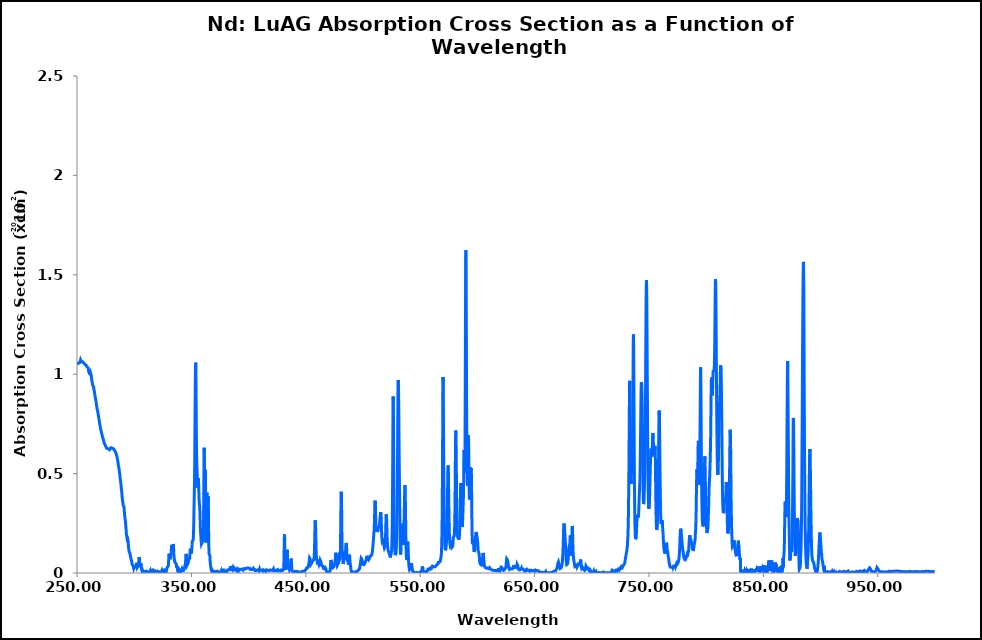
| Category | 295 K |
|---|---|
| 250.0 | 1.049 |
| 250.1 | 1.049 |
| 250.2 | 1.048 |
| 250.3 | 1.047 |
| 250.4 | 1.048 |
| 250.5 | 1.05 |
| 250.6 | 1.052 |
| 250.7 | 1.054 |
| 250.8 | 1.056 |
| 250.9 | 1.056 |
| 251.0 | 1.056 |
| 251.1 | 1.053 |
| 251.2 | 1.053 |
| 251.3 | 1.052 |
| 251.4 | 1.055 |
| 251.5 | 1.055 |
| 251.6 | 1.055 |
| 251.7 | 1.056 |
| 251.8 | 1.056 |
| 251.9 | 1.057 |
| 252.0 | 1.056 |
| 252.1 | 1.056 |
| 252.2 | 1.056 |
| 252.3 | 1.057 |
| 252.4 | 1.057 |
| 252.5 | 1.058 |
| 252.6 | 1.059 |
| 252.7 | 1.062 |
| 252.8 | 1.065 |
| 252.9 | 1.067 |
| 253.0 | 1.069 |
| 253.1 | 1.071 |
| 253.2 | 1.073 |
| 253.3 | 1.071 |
| 253.4 | 1.068 |
| 253.5 | 1.065 |
| 253.6 | 1.064 |
| 253.7 | 1.063 |
| 253.8 | 1.063 |
| 253.9 | 1.062 |
| 254.0 | 1.063 |
| 254.1 | 1.064 |
| 254.2 | 1.066 |
| 254.3 | 1.066 |
| 254.4 | 1.064 |
| 254.5 | 1.066 |
| 254.6 | 1.065 |
| 254.7 | 1.064 |
| 254.8 | 1.061 |
| 254.9 | 1.062 |
| 255.0 | 1.061 |
| 255.1 | 1.061 |
| 255.2 | 1.06 |
| 255.3 | 1.061 |
| 255.4 | 1.06 |
| 255.5 | 1.06 |
| 255.6 | 1.06 |
| 255.7 | 1.059 |
| 255.8 | 1.059 |
| 255.9 | 1.058 |
| 256.0 | 1.058 |
| 256.1 | 1.055 |
| 256.2 | 1.054 |
| 256.3 | 1.053 |
| 256.4 | 1.054 |
| 256.5 | 1.054 |
| 256.6 | 1.055 |
| 256.7 | 1.054 |
| 256.8 | 1.051 |
| 256.9 | 1.049 |
| 257.0 | 1.05 |
| 257.1 | 1.051 |
| 257.2 | 1.05 |
| 257.3 | 1.049 |
| 257.4 | 1.047 |
| 257.5 | 1.047 |
| 257.6 | 1.047 |
| 257.7 | 1.047 |
| 257.8 | 1.046 |
| 257.9 | 1.044 |
| 258.0 | 1.043 |
| 258.1 | 1.042 |
| 258.2 | 1.042 |
| 258.3 | 1.042 |
| 258.4 | 1.042 |
| 258.5 | 1.039 |
| 258.6 | 1.039 |
| 258.7 | 1.04 |
| 258.8 | 1.04 |
| 258.9 | 1.038 |
| 259.0 | 1.037 |
| 259.1 | 1.036 |
| 259.2 | 1.035 |
| 259.3 | 1.034 |
| 259.4 | 1.034 |
| 259.5 | 1.033 |
| 259.6 | 1.032 |
| 259.7 | 1.03 |
| 259.8 | 1.03 |
| 259.9 | 1.029 |
| 260.0 | 1.024 |
| 260.1 | 1.016 |
| 260.2 | 1.011 |
| 260.3 | 1.011 |
| 260.4 | 1.012 |
| 260.5 | 1.01 |
| 260.6 | 1.008 |
| 260.7 | 1.006 |
| 260.8 | 1.004 |
| 260.9 | 1.004 |
| 261.0 | 1.002 |
| 261.1 | 1 |
| 261.2 | 1 |
| 261.3 | 1.002 |
| 261.4 | 1.003 |
| 261.5 | 1 |
| 261.6 | 0.999 |
| 261.7 | 1.001 |
| 261.8 | 1.004 |
| 261.9 | 1.005 |
| 262.0 | 1.006 |
| 262.1 | 1.004 |
| 262.2 | 1.002 |
| 262.3 | 0.997 |
| 262.4 | 0.993 |
| 262.5 | 0.99 |
| 262.6 | 0.987 |
| 262.7 | 0.981 |
| 262.8 | 0.974 |
| 262.9 | 0.969 |
| 263.0 | 0.966 |
| 263.1 | 0.965 |
| 263.2 | 0.963 |
| 263.3 | 0.96 |
| 263.4 | 0.956 |
| 263.5 | 0.953 |
| 263.6 | 0.95 |
| 263.7 | 0.946 |
| 263.8 | 0.944 |
| 263.9 | 0.942 |
| 264.0 | 0.942 |
| 264.1 | 0.944 |
| 264.2 | 0.946 |
| 264.3 | 0.947 |
| 264.4 | 0.943 |
| 264.5 | 0.936 |
| 264.6 | 0.929 |
| 264.7 | 0.924 |
| 264.8 | 0.922 |
| 264.9 | 0.92 |
| 265.0 | 0.919 |
| 265.1 | 0.916 |
| 265.2 | 0.914 |
| 265.3 | 0.909 |
| 265.4 | 0.904 |
| 265.5 | 0.9 |
| 265.6 | 0.898 |
| 265.7 | 0.893 |
| 265.8 | 0.887 |
| 265.9 | 0.885 |
| 266.0 | 0.885 |
| 266.1 | 0.882 |
| 266.2 | 0.878 |
| 266.3 | 0.871 |
| 266.4 | 0.871 |
| 266.5 | 0.868 |
| 266.6 | 0.865 |
| 266.7 | 0.86 |
| 266.8 | 0.855 |
| 266.9 | 0.852 |
| 267.0 | 0.847 |
| 267.1 | 0.845 |
| 267.2 | 0.84 |
| 267.3 | 0.839 |
| 267.4 | 0.834 |
| 267.5 | 0.83 |
| 267.6 | 0.825 |
| 267.7 | 0.822 |
| 267.8 | 0.82 |
| 267.9 | 0.816 |
| 268.0 | 0.816 |
| 268.1 | 0.814 |
| 268.2 | 0.809 |
| 268.3 | 0.806 |
| 268.4 | 0.803 |
| 268.5 | 0.802 |
| 268.6 | 0.797 |
| 268.7 | 0.792 |
| 268.8 | 0.788 |
| 268.9 | 0.785 |
| 269.0 | 0.779 |
| 269.1 | 0.777 |
| 269.2 | 0.775 |
| 269.3 | 0.774 |
| 269.4 | 0.768 |
| 269.5 | 0.763 |
| 269.6 | 0.76 |
| 269.7 | 0.756 |
| 269.8 | 0.755 |
| 269.9 | 0.749 |
| 270.0 | 0.748 |
| 270.1 | 0.744 |
| 270.2 | 0.742 |
| 270.3 | 0.738 |
| 270.4 | 0.733 |
| 270.5 | 0.728 |
| 270.6 | 0.725 |
| 270.7 | 0.723 |
| 270.8 | 0.721 |
| 270.9 | 0.718 |
| 271.0 | 0.717 |
| 271.1 | 0.717 |
| 271.2 | 0.713 |
| 271.3 | 0.71 |
| 271.4 | 0.705 |
| 271.5 | 0.703 |
| 271.6 | 0.7 |
| 271.7 | 0.699 |
| 271.8 | 0.697 |
| 271.9 | 0.694 |
| 272.0 | 0.695 |
| 272.1 | 0.69 |
| 272.2 | 0.688 |
| 272.3 | 0.684 |
| 272.4 | 0.685 |
| 272.5 | 0.683 |
| 272.6 | 0.68 |
| 272.7 | 0.677 |
| 272.8 | 0.675 |
| 272.9 | 0.673 |
| 273.0 | 0.673 |
| 273.1 | 0.669 |
| 273.2 | 0.668 |
| 273.3 | 0.665 |
| 273.4 | 0.664 |
| 273.5 | 0.66 |
| 273.6 | 0.656 |
| 273.7 | 0.656 |
| 273.8 | 0.656 |
| 273.9 | 0.656 |
| 274.0 | 0.654 |
| 274.1 | 0.651 |
| 274.2 | 0.65 |
| 274.3 | 0.647 |
| 274.4 | 0.647 |
| 274.5 | 0.645 |
| 274.6 | 0.645 |
| 274.7 | 0.642 |
| 274.8 | 0.641 |
| 274.9 | 0.64 |
| 275.0 | 0.64 |
| 275.1 | 0.638 |
| 275.2 | 0.638 |
| 275.3 | 0.636 |
| 275.4 | 0.635 |
| 275.5 | 0.631 |
| 275.6 | 0.631 |
| 275.7 | 0.629 |
| 275.8 | 0.629 |
| 275.9 | 0.628 |
| 276.0 | 0.628 |
| 276.1 | 0.626 |
| 276.2 | 0.625 |
| 276.3 | 0.624 |
| 276.4 | 0.625 |
| 276.5 | 0.626 |
| 276.6 | 0.626 |
| 276.7 | 0.624 |
| 276.8 | 0.625 |
| 276.9 | 0.627 |
| 277.0 | 0.63 |
| 277.1 | 0.629 |
| 277.2 | 0.63 |
| 277.3 | 0.629 |
| 277.4 | 0.629 |
| 277.5 | 0.624 |
| 277.6 | 0.622 |
| 277.7 | 0.621 |
| 277.8 | 0.622 |
| 277.9 | 0.622 |
| 278.0 | 0.623 |
| 278.1 | 0.627 |
| 278.2 | 0.628 |
| 278.3 | 0.629 |
| 278.4 | 0.624 |
| 278.5 | 0.624 |
| 278.6 | 0.627 |
| 278.7 | 0.63 |
| 278.8 | 0.629 |
| 278.9 | 0.624 |
| 279.0 | 0.624 |
| 279.1 | 0.625 |
| 279.2 | 0.627 |
| 279.3 | 0.628 |
| 279.4 | 0.628 |
| 279.5 | 0.627 |
| 279.6 | 0.628 |
| 279.7 | 0.63 |
| 279.8 | 0.63 |
| 279.9 | 0.631 |
| 280.0 | 0.63 |
| 280.1 | 0.632 |
| 280.2 | 0.631 |
| 280.3 | 0.628 |
| 280.4 | 0.628 |
| 280.5 | 0.627 |
| 280.6 | 0.628 |
| 280.7 | 0.628 |
| 280.8 | 0.629 |
| 280.9 | 0.629 |
| 281.0 | 0.628 |
| 281.1 | 0.629 |
| 281.2 | 0.63 |
| 281.3 | 0.63 |
| 281.4 | 0.627 |
| 281.5 | 0.627 |
| 281.6 | 0.625 |
| 281.7 | 0.627 |
| 281.8 | 0.626 |
| 281.9 | 0.624 |
| 282.0 | 0.623 |
| 282.1 | 0.624 |
| 282.2 | 0.623 |
| 282.3 | 0.622 |
| 282.4 | 0.621 |
| 282.5 | 0.623 |
| 282.6 | 0.622 |
| 282.7 | 0.623 |
| 282.8 | 0.62 |
| 282.9 | 0.618 |
| 283.0 | 0.616 |
| 283.1 | 0.614 |
| 283.2 | 0.613 |
| 283.3 | 0.611 |
| 283.4 | 0.614 |
| 283.5 | 0.611 |
| 283.6 | 0.611 |
| 283.7 | 0.608 |
| 283.8 | 0.608 |
| 283.9 | 0.605 |
| 284.0 | 0.604 |
| 284.1 | 0.601 |
| 284.2 | 0.599 |
| 284.3 | 0.6 |
| 284.4 | 0.598 |
| 284.5 | 0.596 |
| 284.6 | 0.592 |
| 284.7 | 0.59 |
| 284.8 | 0.589 |
| 284.9 | 0.587 |
| 285.0 | 0.584 |
| 285.1 | 0.58 |
| 285.2 | 0.576 |
| 285.3 | 0.575 |
| 285.4 | 0.574 |
| 285.5 | 0.571 |
| 285.6 | 0.568 |
| 285.7 | 0.562 |
| 285.8 | 0.559 |
| 285.9 | 0.554 |
| 286.0 | 0.55 |
| 286.1 | 0.544 |
| 286.2 | 0.539 |
| 286.3 | 0.536 |
| 286.4 | 0.534 |
| 286.5 | 0.535 |
| 286.6 | 0.531 |
| 286.7 | 0.526 |
| 286.8 | 0.519 |
| 286.9 | 0.518 |
| 287.0 | 0.514 |
| 287.1 | 0.508 |
| 287.2 | 0.503 |
| 287.3 | 0.499 |
| 287.4 | 0.498 |
| 287.5 | 0.493 |
| 287.6 | 0.486 |
| 287.7 | 0.478 |
| 287.8 | 0.472 |
| 287.9 | 0.468 |
| 288.0 | 0.467 |
| 288.1 | 0.463 |
| 288.2 | 0.458 |
| 288.3 | 0.451 |
| 288.4 | 0.446 |
| 288.5 | 0.44 |
| 288.6 | 0.435 |
| 288.7 | 0.428 |
| 288.8 | 0.423 |
| 288.9 | 0.418 |
| 289.0 | 0.414 |
| 289.1 | 0.408 |
| 289.2 | 0.401 |
| 289.3 | 0.393 |
| 289.4 | 0.387 |
| 289.5 | 0.381 |
| 289.6 | 0.376 |
| 289.7 | 0.368 |
| 289.8 | 0.363 |
| 289.9 | 0.36 |
| 290.0 | 0.358 |
| 290.1 | 0.356 |
| 290.2 | 0.347 |
| 290.3 | 0.344 |
| 290.4 | 0.34 |
| 290.5 | 0.341 |
| 290.6 | 0.34 |
| 290.7 | 0.34 |
| 290.8 | 0.342 |
| 290.9 | 0.342 |
| 291.0 | 0.34 |
| 291.1 | 0.332 |
| 291.2 | 0.323 |
| 291.3 | 0.314 |
| 291.4 | 0.308 |
| 291.5 | 0.3 |
| 291.6 | 0.293 |
| 291.7 | 0.285 |
| 291.8 | 0.28 |
| 291.9 | 0.278 |
| 292.0 | 0.274 |
| 292.1 | 0.272 |
| 292.2 | 0.267 |
| 292.3 | 0.264 |
| 292.4 | 0.257 |
| 292.5 | 0.247 |
| 292.6 | 0.239 |
| 292.7 | 0.232 |
| 292.8 | 0.229 |
| 292.9 | 0.221 |
| 293.0 | 0.21 |
| 293.1 | 0.201 |
| 293.2 | 0.194 |
| 293.3 | 0.194 |
| 293.4 | 0.188 |
| 293.5 | 0.185 |
| 293.6 | 0.179 |
| 293.7 | 0.176 |
| 293.8 | 0.172 |
| 293.9 | 0.167 |
| 294.0 | 0.165 |
| 294.1 | 0.16 |
| 294.2 | 0.155 |
| 294.3 | 0.153 |
| 294.4 | 0.154 |
| 294.5 | 0.159 |
| 294.6 | 0.161 |
| 294.7 | 0.158 |
| 294.8 | 0.153 |
| 294.9 | 0.143 |
| 295.0 | 0.136 |
| 295.1 | 0.129 |
| 295.2 | 0.123 |
| 295.3 | 0.119 |
| 295.4 | 0.114 |
| 295.5 | 0.113 |
| 295.6 | 0.108 |
| 295.7 | 0.108 |
| 295.8 | 0.107 |
| 295.9 | 0.107 |
| 296.0 | 0.102 |
| 296.1 | 0.098 |
| 296.2 | 0.099 |
| 296.3 | 0.099 |
| 296.4 | 0.096 |
| 296.5 | 0.09 |
| 296.6 | 0.089 |
| 296.7 | 0.086 |
| 296.8 | 0.087 |
| 296.9 | 0.08 |
| 297.0 | 0.077 |
| 297.1 | 0.073 |
| 297.2 | 0.069 |
| 297.3 | 0.071 |
| 297.4 | 0.068 |
| 297.5 | 0.07 |
| 297.6 | 0.063 |
| 297.7 | 0.06 |
| 297.8 | 0.058 |
| 297.9 | 0.059 |
| 298.0 | 0.055 |
| 298.1 | 0.048 |
| 298.2 | 0.043 |
| 298.3 | 0.044 |
| 298.4 | 0.042 |
| 298.5 | 0.041 |
| 298.6 | 0.041 |
| 298.7 | 0.041 |
| 298.8 | 0.041 |
| 298.9 | 0.039 |
| 299.0 | 0.039 |
| 299.1 | 0.036 |
| 299.2 | 0.033 |
| 299.3 | 0.029 |
| 299.4 | 0.027 |
| 299.5 | 0.024 |
| 299.6 | 0.023 |
| 299.7 | 0.021 |
| 299.8 | 0.024 |
| 299.9 | 0.025 |
| 300.0 | 0.029 |
| 300.1 | 0.03 |
| 300.2 | 0.032 |
| 300.3 | 0.033 |
| 300.4 | 0.033 |
| 300.5 | 0.034 |
| 300.6 | 0.029 |
| 300.7 | 0.03 |
| 300.8 | 0.028 |
| 300.9 | 0.03 |
| 301.0 | 0.026 |
| 301.1 | 0.027 |
| 301.2 | 0.029 |
| 301.3 | 0.027 |
| 301.4 | 0.027 |
| 301.5 | 0.027 |
| 301.6 | 0.032 |
| 301.7 | 0.036 |
| 301.8 | 0.043 |
| 301.9 | 0.046 |
| 302.0 | 0.051 |
| 302.1 | 0.05 |
| 302.2 | 0.047 |
| 302.3 | 0.045 |
| 302.4 | 0.046 |
| 302.5 | 0.043 |
| 302.6 | 0.034 |
| 302.7 | 0.029 |
| 302.8 | 0.03 |
| 302.9 | 0.031 |
| 303.0 | 0.026 |
| 303.1 | 0.029 |
| 303.2 | 0.03 |
| 303.3 | 0.035 |
| 303.4 | 0.029 |
| 303.5 | 0.03 |
| 303.6 | 0.031 |
| 303.7 | 0.034 |
| 303.8 | 0.039 |
| 303.9 | 0.045 |
| 304.0 | 0.054 |
| 304.1 | 0.064 |
| 304.2 | 0.072 |
| 304.3 | 0.079 |
| 304.4 | 0.079 |
| 304.5 | 0.074 |
| 304.6 | 0.069 |
| 304.7 | 0.061 |
| 304.8 | 0.059 |
| 304.9 | 0.05 |
| 305.0 | 0.045 |
| 305.1 | 0.042 |
| 305.2 | 0.037 |
| 305.3 | 0.035 |
| 305.4 | 0.031 |
| 305.5 | 0.032 |
| 305.6 | 0.029 |
| 305.7 | 0.036 |
| 305.8 | 0.04 |
| 305.9 | 0.047 |
| 306.0 | 0.044 |
| 306.1 | 0.041 |
| 306.2 | 0.035 |
| 306.3 | 0.031 |
| 306.4 | 0.023 |
| 306.5 | 0.019 |
| 306.6 | 0.014 |
| 306.7 | 0.014 |
| 306.8 | 0.013 |
| 306.9 | 0.009 |
| 307.0 | 0.009 |
| 307.1 | 0.01 |
| 307.2 | 0.015 |
| 307.3 | 0.016 |
| 307.4 | 0.017 |
| 307.5 | 0.015 |
| 307.6 | 0.009 |
| 307.7 | 0.009 |
| 307.8 | 0.011 |
| 307.9 | 0.014 |
| 308.0 | 0.002 |
| 308.1 | 0.001 |
| 308.2 | 0.003 |
| 308.3 | 0.008 |
| 308.4 | 0.01 |
| 308.5 | 0.012 |
| 308.6 | 0.01 |
| 308.7 | 0.01 |
| 308.8 | 0.01 |
| 308.9 | 0.01 |
| 309.0 | 0.01 |
| 309.1 | 0.007 |
| 309.2 | 0.008 |
| 309.3 | 0.007 |
| 309.4 | 0.008 |
| 309.5 | 0.004 |
| 309.6 | 0.003 |
| 309.7 | 0.001 |
| 309.8 | 0.003 |
| 309.9 | 0.004 |
| 310.0 | 0.004 |
| 310.1 | 0.002 |
| 310.2 | 0.004 |
| 310.3 | 0.005 |
| 310.4 | 0.006 |
| 310.5 | 0.004 |
| 310.6 | 0.002 |
| 310.7 | 0.002 |
| 310.8 | 0.006 |
| 310.9 | 0 |
| 311.0 | 0.005 |
| 311.1 | 0.006 |
| 311.2 | 0.007 |
| 311.3 | 0.005 |
| 311.4 | 0.005 |
| 311.5 | 0.005 |
| 311.6 | 0.004 |
| 311.7 | 0.007 |
| 311.8 | 0.007 |
| 311.9 | 0.009 |
| 312.0 | 0.006 |
| 312.1 | 0.005 |
| 312.2 | 0.005 |
| 312.3 | 0.003 |
| 312.4 | 0.006 |
| 312.5 | 0.004 |
| 312.6 | 0.009 |
| 312.7 | 0.007 |
| 312.8 | 0.007 |
| 312.9 | 0.005 |
| 313.0 | 0.004 |
| 313.1 | 0.003 |
| 313.2 | 0.003 |
| 313.3 | 0.003 |
| 313.4 | 0.007 |
| 313.5 | 0.006 |
| 313.6 | 0.007 |
| 313.7 | 0.007 |
| 313.8 | 0.006 |
| 313.9 | 0.004 |
| 314.0 | 0.006 |
| 314.1 | 0.007 |
| 314.2 | 0.012 |
| 314.3 | 0.009 |
| 314.4 | 0.01 |
| 314.5 | 0.006 |
| 314.6 | 0.006 |
| 314.7 | 0.008 |
| 314.8 | 0.008 |
| 314.9 | 0.011 |
| 315.0 | 0.01 |
| 315.1 | 0.011 |
| 315.2 | 0.01 |
| 315.3 | 0.011 |
| 315.4 | 0.011 |
| 315.5 | 0.009 |
| 315.6 | 0.008 |
| 315.7 | 0.007 |
| 315.8 | 0.003 |
| 315.9 | 0.005 |
| 316.0 | 0.005 |
| 316.1 | 0.008 |
| 316.2 | 0.007 |
| 316.3 | 0.007 |
| 316.4 | 0.008 |
| 316.5 | 0.006 |
| 316.6 | 0.008 |
| 316.7 | 0.006 |
| 316.8 | 0.007 |
| 316.9 | 0.008 |
| 317.0 | 0.011 |
| 317.1 | 0.011 |
| 317.2 | 0.011 |
| 317.3 | 0.012 |
| 317.4 | 0.012 |
| 317.5 | 0.013 |
| 317.6 | 0.011 |
| 317.7 | 0.01 |
| 317.8 | 0.006 |
| 317.9 | 0.005 |
| 318.0 | 0.006 |
| 318.1 | 0.001 |
| 318.2 | 0.003 |
| 318.3 | 0.008 |
| 318.4 | 0.01 |
| 318.5 | 0.012 |
| 318.6 | 0.01 |
| 318.7 | 0.01 |
| 318.8 | 0.01 |
| 318.9 | 0.01 |
| 319.0 | 0.01 |
| 319.1 | 0.007 |
| 319.2 | 0.008 |
| 319.3 | 0.007 |
| 319.4 | 0.008 |
| 319.5 | 0.004 |
| 319.6 | 0.003 |
| 319.7 | 0.001 |
| 319.8 | 0.003 |
| 319.9 | 0.004 |
| 320.0 | 0.004 |
| 320.1 | 0.002 |
| 320.2 | 0.004 |
| 320.3 | 0.005 |
| 320.4 | 0.006 |
| 320.5 | 0.004 |
| 320.6 | 0.002 |
| 320.7 | 0.002 |
| 320.8 | 0.003 |
| 320.9 | 0 |
| 321.0 | 0.005 |
| 321.1 | 0.006 |
| 321.2 | 0.007 |
| 321.3 | 0.005 |
| 321.4 | 0.005 |
| 321.5 | 0.005 |
| 321.6 | 0.004 |
| 321.7 | 0.007 |
| 321.8 | 0.007 |
| 321.9 | 0.009 |
| 322.0 | 0.006 |
| 322.1 | 0.005 |
| 322.2 | 0.005 |
| 322.3 | 0.003 |
| 322.4 | 0.006 |
| 322.5 | 0.004 |
| 322.6 | 0.009 |
| 322.7 | 0.007 |
| 322.8 | 0.007 |
| 322.9 | 0.005 |
| 323.0 | 0.004 |
| 323.1 | 0.003 |
| 323.2 | 0.003 |
| 323.3 | 0.003 |
| 323.4 | 0.007 |
| 323.5 | 0.006 |
| 323.6 | 0.007 |
| 323.7 | 0.007 |
| 323.8 | 0.006 |
| 323.9 | 0.004 |
| 324.0 | 0.006 |
| 324.1 | 0.007 |
| 324.2 | 0.012 |
| 324.3 | 0.009 |
| 324.4 | 0.01 |
| 324.5 | 0.006 |
| 324.6 | 0.006 |
| 324.7 | 0.008 |
| 324.8 | 0.008 |
| 324.9 | 0.011 |
| 325.0 | 0.01 |
| 325.1 | 0.011 |
| 325.2 | 0.01 |
| 325.3 | 0.011 |
| 325.4 | 0.011 |
| 325.5 | 0.009 |
| 325.6 | 0.008 |
| 325.7 | 0.007 |
| 325.8 | 0.003 |
| 325.9 | 0.005 |
| 326.0 | 0.005 |
| 326.1 | 0.008 |
| 326.2 | 0.007 |
| 326.3 | 0.007 |
| 326.4 | 0.008 |
| 326.5 | 0.006 |
| 326.6 | 0.008 |
| 326.7 | 0.006 |
| 326.8 | 0.007 |
| 326.9 | 0.008 |
| 327.0 | 0.011 |
| 327.1 | 0.011 |
| 327.2 | 0.011 |
| 327.3 | 0.012 |
| 327.4 | 0.012 |
| 327.5 | 0.013 |
| 327.6 | 0.011 |
| 327.7 | 0.01 |
| 327.8 | 0.006 |
| 327.9 | 0.005 |
| 328.0 | 0.006 |
| 328.1 | 0.008 |
| 328.2 | 0.015 |
| 328.3 | 0.018 |
| 328.4 | 0.021 |
| 328.5 | 0.022 |
| 328.6 | 0.02 |
| 328.7 | 0.025 |
| 328.8 | 0.025 |
| 328.9 | 0.028 |
| 329.0 | 0.026 |
| 329.1 | 0.028 |
| 329.2 | 0.03 |
| 329.3 | 0.03 |
| 329.4 | 0.029 |
| 329.5 | 0.028 |
| 329.6 | 0.029 |
| 329.7 | 0.028 |
| 329.8 | 0.036 |
| 329.9 | 0.042 |
| 330.0 | 0.052 |
| 330.1 | 0.062 |
| 330.2 | 0.074 |
| 330.3 | 0.084 |
| 330.4 | 0.092 |
| 330.5 | 0.097 |
| 330.6 | 0.095 |
| 330.7 | 0.093 |
| 330.8 | 0.086 |
| 330.9 | 0.085 |
| 331.0 | 0.08 |
| 331.1 | 0.076 |
| 331.2 | 0.075 |
| 331.3 | 0.071 |
| 331.4 | 0.071 |
| 331.5 | 0.069 |
| 331.6 | 0.074 |
| 331.7 | 0.077 |
| 331.8 | 0.082 |
| 331.9 | 0.082 |
| 332.0 | 0.083 |
| 332.1 | 0.085 |
| 332.2 | 0.094 |
| 332.3 | 0.102 |
| 332.4 | 0.11 |
| 332.5 | 0.12 |
| 332.6 | 0.134 |
| 332.7 | 0.141 |
| 332.8 | 0.144 |
| 332.9 | 0.14 |
| 333.0 | 0.137 |
| 333.1 | 0.13 |
| 333.2 | 0.126 |
| 333.3 | 0.125 |
| 333.4 | 0.128 |
| 333.5 | 0.131 |
| 333.6 | 0.132 |
| 333.7 | 0.136 |
| 333.8 | 0.138 |
| 333.9 | 0.141 |
| 334.0 | 0.145 |
| 334.1 | 0.148 |
| 334.2 | 0.148 |
| 334.3 | 0.14 |
| 334.4 | 0.13 |
| 334.5 | 0.118 |
| 334.6 | 0.102 |
| 334.7 | 0.09 |
| 334.8 | 0.08 |
| 334.9 | 0.075 |
| 335.0 | 0.073 |
| 335.1 | 0.072 |
| 335.2 | 0.064 |
| 335.3 | 0.06 |
| 335.4 | 0.057 |
| 335.5 | 0.06 |
| 335.6 | 0.059 |
| 335.7 | 0.058 |
| 335.8 | 0.054 |
| 335.9 | 0.052 |
| 336.0 | 0.051 |
| 336.1 | 0.053 |
| 336.2 | 0.052 |
| 336.3 | 0.053 |
| 336.4 | 0.053 |
| 336.5 | 0.051 |
| 336.6 | 0.051 |
| 336.7 | 0.049 |
| 336.8 | 0.045 |
| 336.9 | 0.04 |
| 337.0 | 0.036 |
| 337.1 | 0.032 |
| 337.2 | 0.027 |
| 337.3 | 0.028 |
| 337.4 | 0.031 |
| 337.5 | 0.034 |
| 337.6 | 0.033 |
| 337.7 | 0.03 |
| 337.8 | 0.023 |
| 337.9 | 0.015 |
| 338.0 | 0.01 |
| 338.1 | 0.007 |
| 338.2 | 0.008 |
| 338.3 | 0.007 |
| 338.4 | 0.008 |
| 338.5 | 0.004 |
| 338.6 | 0.003 |
| 338.7 | 0.001 |
| 338.8 | 0.003 |
| 338.9 | 0.004 |
| 339.0 | 0.004 |
| 339.1 | 0.002 |
| 339.2 | 0.004 |
| 339.3 | 0.005 |
| 339.4 | 0.006 |
| 339.5 | 0.004 |
| 339.6 | 0.002 |
| 339.7 | 0.002 |
| 339.8 | 0.004 |
| 339.9 | 0 |
| 340.0 | 0.01 |
| 340.1 | 0.007 |
| 340.2 | 0.008 |
| 340.3 | 0.007 |
| 340.4 | 0.008 |
| 340.5 | 0.004 |
| 340.6 | 0.003 |
| 340.7 | 0.001 |
| 340.8 | 0.003 |
| 340.9 | 0.004 |
| 341.0 | 0.004 |
| 341.1 | 0.004 |
| 341.2 | 0.004 |
| 341.3 | 0.008 |
| 341.4 | 0.013 |
| 341.5 | 0.015 |
| 341.6 | 0.016 |
| 341.7 | 0.018 |
| 341.8 | 0.02 |
| 341.9 | 0.019 |
| 342.0 | 0.022 |
| 342.1 | 0.02 |
| 342.2 | 0.018 |
| 342.3 | 0.012 |
| 342.4 | 0.015 |
| 342.5 | 0.016 |
| 342.6 | 0.013 |
| 342.7 | 0.009 |
| 342.8 | 0.009 |
| 342.9 | 0.013 |
| 343.0 | 0.015 |
| 343.1 | 0.013 |
| 343.2 | 0.013 |
| 343.3 | 0.014 |
| 343.4 | 0.017 |
| 343.5 | 0.019 |
| 343.6 | 0.022 |
| 343.7 | 0.021 |
| 343.8 | 0.024 |
| 343.9 | 0.026 |
| 344.0 | 0.027 |
| 344.1 | 0.03 |
| 344.2 | 0.03 |
| 344.3 | 0.034 |
| 344.4 | 0.035 |
| 344.5 | 0.041 |
| 344.6 | 0.043 |
| 344.7 | 0.043 |
| 344.8 | 0.047 |
| 344.9 | 0.051 |
| 345.0 | 0.066 |
| 345.1 | 0.075 |
| 345.2 | 0.089 |
| 345.3 | 0.092 |
| 345.4 | 0.096 |
| 345.5 | 0.094 |
| 345.6 | 0.087 |
| 345.7 | 0.083 |
| 345.8 | 0.072 |
| 345.9 | 0.066 |
| 346.0 | 0.052 |
| 346.1 | 0.046 |
| 346.2 | 0.038 |
| 346.3 | 0.037 |
| 346.4 | 0.037 |
| 346.5 | 0.04 |
| 346.6 | 0.039 |
| 346.7 | 0.041 |
| 346.8 | 0.04 |
| 346.9 | 0.042 |
| 347.0 | 0.041 |
| 347.1 | 0.049 |
| 347.2 | 0.052 |
| 347.3 | 0.058 |
| 347.4 | 0.058 |
| 347.5 | 0.065 |
| 347.6 | 0.07 |
| 347.7 | 0.076 |
| 347.8 | 0.074 |
| 347.9 | 0.068 |
| 348.0 | 0.067 |
| 348.1 | 0.069 |
| 348.2 | 0.069 |
| 348.3 | 0.067 |
| 348.4 | 0.066 |
| 348.5 | 0.075 |
| 348.6 | 0.084 |
| 348.7 | 0.096 |
| 348.8 | 0.101 |
| 348.9 | 0.11 |
| 349.0 | 0.114 |
| 349.1 | 0.122 |
| 349.2 | 0.127 |
| 349.3 | 0.125 |
| 349.4 | 0.12 |
| 349.5 | 0.112 |
| 349.6 | 0.104 |
| 349.7 | 0.099 |
| 349.8 | 0.095 |
| 349.9 | 0.096 |
| 350.0 | 0.099 |
| 350.1 | 0.101 |
| 350.2 | 0.108 |
| 350.3 | 0.115 |
| 350.4 | 0.124 |
| 350.5 | 0.135 |
| 350.6 | 0.142 |
| 350.7 | 0.154 |
| 350.8 | 0.16 |
| 350.9 | 0.164 |
| 351.0 | 0.162 |
| 351.1 | 0.159 |
| 351.2 | 0.156 |
| 351.3 | 0.155 |
| 351.4 | 0.155 |
| 351.5 | 0.16 |
| 351.6 | 0.167 |
| 351.7 | 0.182 |
| 351.8 | 0.198 |
| 351.9 | 0.216 |
| 352.0 | 0.237 |
| 352.1 | 0.268 |
| 352.2 | 0.298 |
| 352.3 | 0.331 |
| 352.4 | 0.359 |
| 352.5 | 0.391 |
| 352.6 | 0.421 |
| 352.7 | 0.456 |
| 352.8 | 0.501 |
| 352.9 | 0.555 |
| 353.0 | 0.624 |
| 353.1 | 0.706 |
| 353.2 | 0.791 |
| 353.3 | 0.869 |
| 353.4 | 0.937 |
| 353.5 | 0.996 |
| 353.6 | 1.039 |
| 353.7 | 1.058 |
| 353.8 | 1.055 |
| 353.9 | 1.024 |
| 354.0 | 0.975 |
| 354.1 | 0.904 |
| 354.2 | 0.824 |
| 354.3 | 0.741 |
| 354.4 | 0.673 |
| 354.5 | 0.618 |
| 354.6 | 0.58 |
| 354.7 | 0.555 |
| 354.8 | 0.538 |
| 354.9 | 0.527 |
| 355.0 | 0.508 |
| 355.1 | 0.487 |
| 355.2 | 0.463 |
| 355.3 | 0.442 |
| 355.4 | 0.43 |
| 355.5 | 0.426 |
| 355.6 | 0.433 |
| 355.7 | 0.445 |
| 355.8 | 0.456 |
| 355.9 | 0.47 |
| 356.0 | 0.476 |
| 356.1 | 0.479 |
| 356.2 | 0.469 |
| 356.3 | 0.455 |
| 356.4 | 0.433 |
| 356.5 | 0.414 |
| 356.6 | 0.395 |
| 356.7 | 0.379 |
| 356.8 | 0.364 |
| 356.9 | 0.352 |
| 357.0 | 0.348 |
| 357.1 | 0.345 |
| 357.2 | 0.341 |
| 357.3 | 0.327 |
| 357.4 | 0.314 |
| 357.5 | 0.294 |
| 357.6 | 0.273 |
| 357.7 | 0.253 |
| 357.8 | 0.235 |
| 357.9 | 0.22 |
| 358.0 | 0.206 |
| 358.1 | 0.199 |
| 358.2 | 0.193 |
| 358.3 | 0.183 |
| 358.4 | 0.171 |
| 358.5 | 0.163 |
| 358.6 | 0.157 |
| 358.7 | 0.153 |
| 358.8 | 0.146 |
| 358.9 | 0.143 |
| 359.0 | 0.141 |
| 359.1 | 0.143 |
| 359.2 | 0.151 |
| 359.3 | 0.159 |
| 359.4 | 0.167 |
| 359.5 | 0.172 |
| 359.6 | 0.178 |
| 359.7 | 0.18 |
| 359.8 | 0.175 |
| 359.9 | 0.165 |
| 360.0 | 0.161 |
| 360.1 | 0.156 |
| 360.2 | 0.158 |
| 360.3 | 0.161 |
| 360.4 | 0.179 |
| 360.5 | 0.207 |
| 360.6 | 0.25 |
| 360.7 | 0.31 |
| 360.8 | 0.387 |
| 360.9 | 0.471 |
| 361.0 | 0.55 |
| 361.1 | 0.606 |
| 361.2 | 0.63 |
| 361.3 | 0.611 |
| 361.4 | 0.559 |
| 361.5 | 0.486 |
| 361.6 | 0.422 |
| 361.7 | 0.387 |
| 361.8 | 0.396 |
| 361.9 | 0.437 |
| 362.0 | 0.487 |
| 362.1 | 0.519 |
| 362.2 | 0.518 |
| 362.3 | 0.478 |
| 362.4 | 0.406 |
| 362.5 | 0.324 |
| 362.6 | 0.248 |
| 362.7 | 0.199 |
| 362.8 | 0.165 |
| 362.9 | 0.153 |
| 363.0 | 0.153 |
| 363.1 | 0.176 |
| 363.2 | 0.217 |
| 363.3 | 0.276 |
| 363.4 | 0.336 |
| 363.5 | 0.384 |
| 363.6 | 0.404 |
| 363.7 | 0.395 |
| 363.8 | 0.359 |
| 363.9 | 0.314 |
| 364.0 | 0.271 |
| 364.1 | 0.253 |
| 364.2 | 0.258 |
| 364.3 | 0.286 |
| 364.4 | 0.324 |
| 364.5 | 0.362 |
| 364.6 | 0.386 |
| 364.7 | 0.383 |
| 364.8 | 0.355 |
| 364.9 | 0.301 |
| 365.0 | 0.244 |
| 365.1 | 0.187 |
| 365.2 | 0.149 |
| 365.3 | 0.12 |
| 365.4 | 0.104 |
| 365.5 | 0.095 |
| 365.6 | 0.091 |
| 365.7 | 0.093 |
| 365.8 | 0.095 |
| 365.9 | 0.093 |
| 366.0 | 0.093 |
| 366.1 | 0.089 |
| 366.2 | 0.083 |
| 366.3 | 0.07 |
| 366.4 | 0.055 |
| 366.5 | 0.048 |
| 366.6 | 0.045 |
| 366.7 | 0.042 |
| 366.8 | 0.038 |
| 366.9 | 0.031 |
| 367.0 | 0.028 |
| 367.1 | 0.021 |
| 367.2 | 0.02 |
| 367.3 | 0.017 |
| 367.4 | 0.016 |
| 367.5 | 0.013 |
| 367.6 | 0.014 |
| 367.7 | 0.013 |
| 367.8 | 0.013 |
| 367.9 | 0.012 |
| 368.0 | 0.011 |
| 368.1 | 0.009 |
| 368.2 | 0.003 |
| 368.3 | 0.006 |
| 368.4 | 0.007 |
| 368.5 | 0.012 |
| 368.6 | 0.01 |
| 368.7 | 0.009 |
| 368.8 | 0.009 |
| 368.9 | 0.01 |
| 369.0 | 0.011 |
| 369.1 | 0.007 |
| 369.2 | 0.004 |
| 369.3 | 0.003 |
| 369.4 | 0.007 |
| 369.5 | 0.008 |
| 369.6 | 0.006 |
| 369.7 | 0.004 |
| 369.8 | 0.003 |
| 369.9 | 0.005 |
| 370.0 | 0.002 |
| 370.1 | 0.001 |
| 370.2 | 0.003 |
| 370.3 | 0.008 |
| 370.4 | 0.01 |
| 370.5 | 0.012 |
| 370.6 | 0.01 |
| 370.7 | 0.01 |
| 370.8 | 0.01 |
| 370.9 | 0.01 |
| 371.0 | 0.01 |
| 371.1 | 0.007 |
| 371.2 | 0.008 |
| 371.3 | 0.007 |
| 371.4 | 0.008 |
| 371.5 | 0.004 |
| 371.6 | 0.003 |
| 371.7 | 0.001 |
| 371.8 | 0.003 |
| 371.9 | 0.004 |
| 372.0 | 0.004 |
| 372.1 | 0.002 |
| 372.2 | 0.004 |
| 372.3 | 0.005 |
| 372.4 | 0.006 |
| 372.5 | 0.004 |
| 372.6 | 0.002 |
| 372.7 | 0.002 |
| 372.8 | 0.002 |
| 372.9 | 0 |
| 373.0 | 0.005 |
| 373.1 | 0.006 |
| 373.2 | 0.007 |
| 373.3 | 0.005 |
| 373.4 | 0.005 |
| 373.5 | 0.005 |
| 373.6 | 0.004 |
| 373.7 | 0.007 |
| 373.8 | 0.007 |
| 373.9 | 0.009 |
| 374.0 | 0.006 |
| 374.1 | 0.005 |
| 374.2 | 0.005 |
| 374.3 | 0.003 |
| 374.4 | 0.006 |
| 374.5 | 0.004 |
| 374.6 | 0.009 |
| 374.7 | 0.007 |
| 374.8 | 0.007 |
| 374.9 | 0.005 |
| 375.0 | 0.004 |
| 375.1 | 0.003 |
| 375.2 | 0.003 |
| 375.3 | 0.003 |
| 375.4 | 0.007 |
| 375.5 | 0.006 |
| 375.6 | 0.007 |
| 375.7 | 0.007 |
| 375.8 | 0.006 |
| 375.9 | 0.004 |
| 376.0 | 0.006 |
| 376.1 | 0.007 |
| 376.2 | 0.012 |
| 376.3 | 0.009 |
| 376.4 | 0.01 |
| 376.5 | 0.006 |
| 376.6 | 0.006 |
| 376.7 | 0.008 |
| 376.8 | 0.008 |
| 376.9 | 0.011 |
| 377.0 | 0.01 |
| 377.1 | 0.011 |
| 377.2 | 0.01 |
| 377.3 | 0.011 |
| 377.4 | 0.011 |
| 377.5 | 0.009 |
| 377.6 | 0.008 |
| 377.7 | 0.007 |
| 377.8 | 0.003 |
| 377.9 | 0.005 |
| 378.0 | 0.005 |
| 378.1 | 0.008 |
| 378.2 | 0.007 |
| 378.3 | 0.007 |
| 378.4 | 0.008 |
| 378.5 | 0.006 |
| 378.6 | 0.008 |
| 378.7 | 0.006 |
| 378.8 | 0.007 |
| 378.9 | 0.008 |
| 379.0 | 0.011 |
| 379.1 | 0.011 |
| 379.2 | 0.011 |
| 379.3 | 0.012 |
| 379.4 | 0.012 |
| 379.5 | 0.013 |
| 379.6 | 0.011 |
| 379.7 | 0.01 |
| 379.8 | 0.006 |
| 379.9 | 0.005 |
| 380.0 | 0.006 |
| 380.1 | 0.008 |
| 380.2 | 0.009 |
| 380.3 | 0.006 |
| 380.4 | 0.006 |
| 380.5 | 0.006 |
| 380.6 | 0.006 |
| 380.7 | 0.002 |
| 380.8 | 0.003 |
| 380.9 | 0.006 |
| 381.0 | 0.01 |
| 381.1 | 0.011 |
| 381.2 | 0.011 |
| 381.3 | 0.013 |
| 381.4 | 0.015 |
| 381.5 | 0.016 |
| 381.6 | 0.012 |
| 381.7 | 0.012 |
| 381.8 | 0.011 |
| 381.9 | 0.013 |
| 382.0 | 0.012 |
| 382.1 | 0.012 |
| 382.2 | 0.016 |
| 382.3 | 0.016 |
| 382.4 | 0.017 |
| 382.5 | 0.014 |
| 382.6 | 0.012 |
| 382.7 | 0.012 |
| 382.8 | 0.012 |
| 382.9 | 0.013 |
| 383.0 | 0.013 |
| 383.1 | 0.014 |
| 383.2 | 0.016 |
| 383.3 | 0.016 |
| 383.4 | 0.016 |
| 383.5 | 0.015 |
| 383.6 | 0.017 |
| 383.7 | 0.02 |
| 383.8 | 0.022 |
| 383.9 | 0.025 |
| 384.0 | 0.029 |
| 384.1 | 0.034 |
| 384.2 | 0.037 |
| 384.3 | 0.037 |
| 384.4 | 0.031 |
| 384.5 | 0.028 |
| 384.6 | 0.023 |
| 384.7 | 0.024 |
| 384.8 | 0.021 |
| 384.9 | 0.02 |
| 385.0 | 0.017 |
| 385.1 | 0.018 |
| 385.2 | 0.018 |
| 385.3 | 0.021 |
| 385.4 | 0.02 |
| 385.5 | 0.022 |
| 385.6 | 0.019 |
| 385.7 | 0.021 |
| 385.8 | 0.018 |
| 385.9 | 0.019 |
| 386.0 | 0.018 |
| 386.1 | 0.021 |
| 386.2 | 0.024 |
| 386.3 | 0.024 |
| 386.4 | 0.021 |
| 386.5 | 0.018 |
| 386.6 | 0.015 |
| 386.7 | 0.017 |
| 386.8 | 0.017 |
| 386.9 | 0.017 |
| 387.0 | 0.018 |
| 387.1 | 0.022 |
| 387.2 | 0.023 |
| 387.3 | 0.022 |
| 387.4 | 0.019 |
| 387.5 | 0.02 |
| 387.6 | 0.017 |
| 387.7 | 0.015 |
| 387.8 | 0.015 |
| 387.9 | 0.016 |
| 388.0 | 0.018 |
| 388.1 | 0.018 |
| 388.2 | 0.019 |
| 388.3 | 0.019 |
| 388.4 | 0.02 |
| 388.5 | 0.02 |
| 388.6 | 0.02 |
| 388.7 | 0.019 |
| 388.8 | 0.018 |
| 388.9 | 0.019 |
| 389.0 | 0.018 |
| 389.1 | 0.02 |
| 389.2 | 0.017 |
| 389.3 | 0.016 |
| 389.4 | 0.013 |
| 389.5 | 0.014 |
| 389.6 | 0.015 |
| 389.7 | 0.015 |
| 389.8 | 0.017 |
| 389.9 | 0.019 |
| 390.0 | 0.021 |
| 390.1 | 0.019 |
| 390.2 | 0.018 |
| 390.3 | 0.018 |
| 390.4 | 0.019 |
| 390.5 | 0.017 |
| 390.6 | 0.015 |
| 390.7 | 0.013 |
| 390.8 | 0.015 |
| 390.9 | 0.019 |
| 391.0 | 0.021 |
| 391.1 | 0.02 |
| 391.2 | 0.017 |
| 391.3 | 0.014 |
| 391.4 | 0.016 |
| 391.5 | 0.015 |
| 391.6 | 0.016 |
| 391.7 | 0.016 |
| 391.8 | 0.014 |
| 391.9 | 0.015 |
| 392.0 | 0.015 |
| 392.1 | 0.017 |
| 392.2 | 0.017 |
| 392.3 | 0.017 |
| 392.4 | 0.019 |
| 392.5 | 0.021 |
| 392.6 | 0.022 |
| 392.7 | 0.02 |
| 392.8 | 0.019 |
| 392.9 | 0.018 |
| 393.0 | 0.02 |
| 393.1 | 0.017 |
| 393.2 | 0.02 |
| 393.3 | 0.018 |
| 393.4 | 0.02 |
| 393.5 | 0.017 |
| 393.6 | 0.019 |
| 393.7 | 0.016 |
| 393.8 | 0.016 |
| 393.9 | 0.017 |
| 394.0 | 0.019 |
| 394.1 | 0.02 |
| 394.2 | 0.019 |
| 394.3 | 0.02 |
| 394.4 | 0.019 |
| 394.5 | 0.016 |
| 394.6 | 0.017 |
| 394.7 | 0.019 |
| 394.8 | 0.02 |
| 394.9 | 0.019 |
| 395.0 | 0.018 |
| 395.1 | 0.015 |
| 395.2 | 0.017 |
| 395.3 | 0.017 |
| 395.4 | 0.021 |
| 395.5 | 0.02 |
| 395.6 | 0.019 |
| 395.7 | 0.018 |
| 395.8 | 0.02 |
| 395.9 | 0.022 |
| 396.0 | 0.025 |
| 396.1 | 0.022 |
| 396.2 | 0.023 |
| 396.3 | 0.022 |
| 396.4 | 0.022 |
| 396.5 | 0.023 |
| 396.6 | 0.023 |
| 396.7 | 0.025 |
| 396.8 | 0.023 |
| 396.9 | 0.021 |
| 397.0 | 0.019 |
| 397.1 | 0.018 |
| 397.2 | 0.02 |
| 397.3 | 0.021 |
| 397.4 | 0.022 |
| 397.5 | 0.021 |
| 397.6 | 0.021 |
| 397.7 | 0.022 |
| 397.8 | 0.02 |
| 397.9 | 0.022 |
| 398.0 | 0.021 |
| 398.1 | 0.024 |
| 398.2 | 0.023 |
| 398.3 | 0.022 |
| 398.4 | 0.022 |
| 398.5 | 0.022 |
| 398.6 | 0.023 |
| 398.7 | 0.022 |
| 398.8 | 0.023 |
| 398.9 | 0.025 |
| 399.0 | 0.026 |
| 399.1 | 0.027 |
| 399.2 | 0.027 |
| 399.3 | 0.026 |
| 399.4 | 0.024 |
| 399.5 | 0.024 |
| 399.6 | 0.025 |
| 399.7 | 0.024 |
| 399.8 | 0.025 |
| 399.9 | 0.025 |
| 400.0 | 0.024 |
| 400.1 | 0.022 |
| 400.2 | 0.021 |
| 400.3 | 0.023 |
| 400.4 | 0.024 |
| 400.5 | 0.026 |
| 400.6 | 0.025 |
| 400.7 | 0.026 |
| 400.8 | 0.024 |
| 400.9 | 0.025 |
| 401.0 | 0.024 |
| 401.1 | 0.024 |
| 401.2 | 0.023 |
| 401.3 | 0.02 |
| 401.4 | 0.018 |
| 401.5 | 0.016 |
| 401.6 | 0.018 |
| 401.7 | 0.019 |
| 401.8 | 0.022 |
| 401.9 | 0.021 |
| 402.0 | 0.021 |
| 402.1 | 0.02 |
| 402.2 | 0.021 |
| 402.3 | 0.02 |
| 402.4 | 0.019 |
| 402.5 | 0.019 |
| 402.6 | 0.021 |
| 402.7 | 0.018 |
| 402.8 | 0.017 |
| 402.9 | 0.016 |
| 403.0 | 0.017 |
| 403.1 | 0.016 |
| 403.2 | 0.017 |
| 403.3 | 0.018 |
| 403.4 | 0.019 |
| 403.5 | 0.019 |
| 403.6 | 0.02 |
| 403.7 | 0.02 |
| 403.8 | 0.017 |
| 403.9 | 0.018 |
| 404.0 | 0.021 |
| 404.1 | 0.023 |
| 404.2 | 0.022 |
| 404.3 | 0.022 |
| 404.4 | 0.019 |
| 404.5 | 0.018 |
| 404.6 | 0.017 |
| 404.7 | 0.016 |
| 404.8 | 0.017 |
| 404.9 | 0.018 |
| 405.0 | 0.019 |
| 405.1 | 0.021 |
| 405.2 | 0.019 |
| 405.3 | 0.02 |
| 405.4 | 0.018 |
| 405.5 | 0.015 |
| 405.6 | 0.013 |
| 405.7 | 0.012 |
| 405.8 | 0.012 |
| 405.9 | 0.01 |
| 406.0 | 0.012 |
| 406.1 | 0.014 |
| 406.2 | 0.016 |
| 406.3 | 0.016 |
| 406.4 | 0.015 |
| 406.5 | 0.015 |
| 406.6 | 0.011 |
| 406.7 | 0.014 |
| 406.8 | 0.011 |
| 406.9 | 0.013 |
| 407.0 | 0.01 |
| 407.1 | 0.013 |
| 407.2 | 0.015 |
| 407.3 | 0.014 |
| 407.4 | 0.015 |
| 407.5 | 0.014 |
| 407.6 | 0.015 |
| 407.7 | 0.014 |
| 407.8 | 0.014 |
| 407.9 | 0.014 |
| 408.0 | 0.016 |
| 408.1 | 0.016 |
| 408.2 | 0.017 |
| 408.3 | 0.017 |
| 408.4 | 0.016 |
| 408.5 | 0.013 |
| 408.6 | 0.012 |
| 408.7 | 0.012 |
| 408.8 | 0.013 |
| 408.9 | 0.014 |
| 409.0 | 0.014 |
| 409.1 | 0.014 |
| 409.2 | 0.011 |
| 409.3 | 0.01 |
| 409.4 | 0.012 |
| 409.5 | 0.016 |
| 409.6 | 0.019 |
| 409.7 | 0.016 |
| 409.8 | 0.015 |
| 409.9 | 0.013 |
| 410.0 | 0.014 |
| 410.1 | 0.014 |
| 410.2 | 0.014 |
| 410.3 | 0.013 |
| 410.4 | 0.013 |
| 410.5 | 0.015 |
| 410.6 | 0.014 |
| 410.7 | 0.014 |
| 410.8 | 0.014 |
| 410.9 | 0.015 |
| 411.0 | 0.017 |
| 411.1 | 0.016 |
| 411.2 | 0.015 |
| 411.3 | 0.011 |
| 411.4 | 0.01 |
| 411.5 | 0.012 |
| 411.6 | 0.013 |
| 411.7 | 0.014 |
| 411.8 | 0.012 |
| 411.9 | 0.012 |
| 412.0 | 0.01 |
| 412.1 | 0.012 |
| 412.2 | 0.011 |
| 412.3 | 0.011 |
| 412.4 | 0.01 |
| 412.5 | 0.01 |
| 412.6 | 0.01 |
| 412.7 | 0.011 |
| 412.8 | 0.014 |
| 412.9 | 0.015 |
| 413.0 | 0.015 |
| 413.1 | 0.013 |
| 413.2 | 0.013 |
| 413.3 | 0.013 |
| 413.4 | 0.015 |
| 413.5 | 0.017 |
| 413.6 | 0.015 |
| 413.7 | 0.015 |
| 413.8 | 0.011 |
| 413.9 | 0.008 |
| 414.0 | 0.007 |
| 414.1 | 0.011 |
| 414.2 | 0.015 |
| 414.3 | 0.014 |
| 414.4 | 0.013 |
| 414.5 | 0.011 |
| 414.6 | 0.015 |
| 414.7 | 0.014 |
| 414.8 | 0.017 |
| 414.9 | 0.014 |
| 415.0 | 0.012 |
| 415.1 | 0.009 |
| 415.2 | 0.01 |
| 415.3 | 0.012 |
| 415.4 | 0.014 |
| 415.5 | 0.015 |
| 415.6 | 0.014 |
| 415.7 | 0.014 |
| 415.8 | 0.012 |
| 415.9 | 0.012 |
| 416.0 | 0.013 |
| 416.1 | 0.014 |
| 416.2 | 0.015 |
| 416.3 | 0.015 |
| 416.4 | 0.016 |
| 416.5 | 0.014 |
| 416.6 | 0.012 |
| 416.7 | 0.011 |
| 416.8 | 0.011 |
| 416.9 | 0.011 |
| 417.0 | 0.011 |
| 417.1 | 0.011 |
| 417.2 | 0.013 |
| 417.3 | 0.016 |
| 417.4 | 0.014 |
| 417.5 | 0.012 |
| 417.6 | 0.013 |
| 417.7 | 0.013 |
| 417.8 | 0.014 |
| 417.9 | 0.013 |
| 418.0 | 0.013 |
| 418.1 | 0.012 |
| 418.2 | 0.011 |
| 418.3 | 0.012 |
| 418.4 | 0.014 |
| 418.5 | 0.014 |
| 418.6 | 0.013 |
| 418.7 | 0.013 |
| 418.8 | 0.014 |
| 418.9 | 0.016 |
| 419.0 | 0.015 |
| 419.1 | 0.014 |
| 419.2 | 0.014 |
| 419.3 | 0.017 |
| 419.4 | 0.017 |
| 419.5 | 0.016 |
| 419.6 | 0.015 |
| 419.7 | 0.015 |
| 419.8 | 0.016 |
| 419.9 | 0.014 |
| 420.0 | 0.014 |
| 420.1 | 0.012 |
| 420.2 | 0.014 |
| 420.3 | 0.013 |
| 420.4 | 0.015 |
| 420.5 | 0.014 |
| 420.6 | 0.014 |
| 420.7 | 0.012 |
| 420.8 | 0.013 |
| 420.9 | 0.013 |
| 421.0 | 0.012 |
| 421.1 | 0.012 |
| 421.2 | 0.014 |
| 421.3 | 0.014 |
| 421.4 | 0.017 |
| 421.5 | 0.018 |
| 421.6 | 0.02 |
| 421.7 | 0.017 |
| 421.8 | 0.013 |
| 421.9 | 0.01 |
| 422.0 | 0.009 |
| 422.1 | 0.009 |
| 422.2 | 0.01 |
| 422.3 | 0.012 |
| 422.4 | 0.013 |
| 422.5 | 0.012 |
| 422.6 | 0.011 |
| 422.7 | 0.011 |
| 422.8 | 0.014 |
| 422.9 | 0.015 |
| 423.0 | 0.015 |
| 423.1 | 0.015 |
| 423.2 | 0.013 |
| 423.3 | 0.013 |
| 423.4 | 0.013 |
| 423.5 | 0.014 |
| 423.6 | 0.014 |
| 423.7 | 0.012 |
| 423.8 | 0.011 |
| 423.9 | 0.012 |
| 424.0 | 0.013 |
| 424.1 | 0.012 |
| 424.2 | 0.012 |
| 424.3 | 0.014 |
| 424.4 | 0.013 |
| 424.5 | 0.013 |
| 424.6 | 0.011 |
| 424.7 | 0.013 |
| 424.8 | 0.015 |
| 424.9 | 0.017 |
| 425.0 | 0.016 |
| 425.1 | 0.014 |
| 425.2 | 0.014 |
| 425.3 | 0.016 |
| 425.4 | 0.017 |
| 425.5 | 0.014 |
| 425.6 | 0.012 |
| 425.7 | 0.011 |
| 425.8 | 0.012 |
| 425.9 | 0.013 |
| 426.0 | 0.014 |
| 426.1 | 0.014 |
| 426.2 | 0.011 |
| 426.3 | 0.01 |
| 426.4 | 0.011 |
| 426.5 | 0.01 |
| 426.6 | 0.012 |
| 426.7 | 0.011 |
| 426.8 | 0.013 |
| 426.9 | 0.011 |
| 427.0 | 0.01 |
| 427.1 | 0.01 |
| 427.2 | 0.012 |
| 427.3 | 0.012 |
| 427.4 | 0.012 |
| 427.5 | 0.011 |
| 427.6 | 0.012 |
| 427.7 | 0.013 |
| 427.8 | 0.015 |
| 427.9 | 0.015 |
| 428.0 | 0.015 |
| 428.1 | 0.012 |
| 428.2 | 0.012 |
| 428.3 | 0.014 |
| 428.4 | 0.015 |
| 428.5 | 0.014 |
| 428.6 | 0.013 |
| 428.7 | 0.012 |
| 428.8 | 0.011 |
| 428.9 | 0.011 |
| 429.0 | 0.012 |
| 429.1 | 0.012 |
| 429.2 | 0.013 |
| 429.3 | 0.012 |
| 429.4 | 0.012 |
| 429.5 | 0.011 |
| 429.6 | 0.013 |
| 429.7 | 0.013 |
| 429.8 | 0.015 |
| 429.9 | 0.015 |
| 430.0 | 0.015 |
| 430.1 | 0.013 |
| 430.2 | 0.015 |
| 430.3 | 0.015 |
| 430.4 | 0.016 |
| 430.5 | 0.018 |
| 430.6 | 0.021 |
| 430.7 | 0.029 |
| 430.8 | 0.042 |
| 430.9 | 0.067 |
| 431.0 | 0.098 |
| 431.1 | 0.132 |
| 431.2 | 0.164 |
| 431.3 | 0.187 |
| 431.4 | 0.194 |
| 431.5 | 0.179 |
| 431.6 | 0.151 |
| 431.7 | 0.116 |
| 431.8 | 0.084 |
| 431.9 | 0.056 |
| 432.0 | 0.038 |
| 432.1 | 0.028 |
| 432.2 | 0.022 |
| 432.3 | 0.019 |
| 432.4 | 0.016 |
| 432.5 | 0.016 |
| 432.6 | 0.016 |
| 432.7 | 0.015 |
| 432.8 | 0.017 |
| 432.9 | 0.02 |
| 433.0 | 0.029 |
| 433.1 | 0.04 |
| 433.2 | 0.052 |
| 433.3 | 0.067 |
| 433.4 | 0.082 |
| 433.5 | 0.1 |
| 433.6 | 0.112 |
| 433.7 | 0.117 |
| 433.8 | 0.113 |
| 433.9 | 0.101 |
| 434.0 | 0.085 |
| 434.1 | 0.067 |
| 434.2 | 0.048 |
| 434.3 | 0.033 |
| 434.4 | 0.023 |
| 434.5 | 0.02 |
| 434.6 | 0.02 |
| 434.7 | 0.022 |
| 434.8 | 0.026 |
| 434.9 | 0.029 |
| 435.0 | 0.031 |
| 435.1 | 0.033 |
| 435.2 | 0.033 |
| 435.3 | 0.03 |
| 435.4 | 0.027 |
| 435.5 | 0.025 |
| 435.6 | 0.023 |
| 435.7 | 0.018 |
| 435.8 | 0.016 |
| 435.9 | 0.016 |
| 436.0 | 0.015 |
| 436.1 | 0.014 |
| 436.2 | 0.014 |
| 436.3 | 0.015 |
| 436.4 | 0.016 |
| 436.5 | 0.021 |
| 436.6 | 0.027 |
| 436.7 | 0.036 |
| 436.8 | 0.046 |
| 436.9 | 0.056 |
| 437.0 | 0.066 |
| 437.1 | 0.072 |
| 437.2 | 0.074 |
| 437.3 | 0.067 |
| 437.4 | 0.057 |
| 437.5 | 0.046 |
| 437.6 | 0.036 |
| 437.7 | 0.028 |
| 437.8 | 0.022 |
| 437.9 | 0.018 |
| 438.0 | 0.014 |
| 438.1 | 0.012 |
| 438.2 | 0.009 |
| 438.3 | 0.009 |
| 438.4 | 0.007 |
| 438.5 | 0.008 |
| 438.6 | 0.007 |
| 438.7 | 0.006 |
| 438.8 | 0.006 |
| 438.9 | 0.006 |
| 439.0 | 0.007 |
| 439.1 | 0.006 |
| 439.2 | 0.005 |
| 439.3 | 0.005 |
| 439.4 | 0.004 |
| 439.5 | 0.003 |
| 439.6 | 0.004 |
| 439.7 | 0.004 |
| 439.8 | 0.004 |
| 439.9 | 0.003 |
| 440.0 | 0.005 |
| 440.1 | 0.005 |
| 440.2 | 0.006 |
| 440.3 | 0.005 |
| 440.4 | 0.006 |
| 440.5 | 0.006 |
| 440.6 | 0.007 |
| 440.7 | 0.009 |
| 440.8 | 0.009 |
| 440.9 | 0.008 |
| 441.0 | 0.007 |
| 441.1 | 0.007 |
| 441.2 | 0.007 |
| 441.3 | 0.005 |
| 441.4 | 0.005 |
| 441.5 | 0.005 |
| 441.6 | 0.007 |
| 441.7 | 0.008 |
| 441.8 | 0.007 |
| 441.9 | 0.007 |
| 442.0 | 0.007 |
| 442.1 | 0.005 |
| 442.2 | 0.005 |
| 442.3 | 0.005 |
| 442.4 | 0.006 |
| 442.5 | 0.007 |
| 442.6 | 0.007 |
| 442.7 | 0.008 |
| 442.8 | 0.006 |
| 442.9 | 0.006 |
| 443.0 | 0.006 |
| 443.1 | 0.006 |
| 443.2 | 0.006 |
| 443.3 | 0.004 |
| 443.4 | 0.005 |
| 443.5 | 0.006 |
| 443.6 | 0.006 |
| 443.7 | 0.006 |
| 443.8 | 0.006 |
| 443.9 | 0.007 |
| 444.0 | 0.007 |
| 444.1 | 0.006 |
| 444.2 | 0.006 |
| 444.3 | 0.004 |
| 444.4 | 0.005 |
| 444.5 | 0.003 |
| 444.6 | 0.005 |
| 444.7 | 0.005 |
| 444.8 | 0.006 |
| 444.9 | 0.005 |
| 445.0 | 0.005 |
| 445.1 | 0.006 |
| 445.2 | 0.008 |
| 445.3 | 0.006 |
| 445.4 | 0.004 |
| 445.5 | 0.003 |
| 445.6 | 0.005 |
| 445.7 | 0.007 |
| 445.8 | 0.009 |
| 445.9 | 0.009 |
| 446.0 | 0.007 |
| 446.1 | 0.006 |
| 446.2 | 0.005 |
| 446.3 | 0.007 |
| 446.4 | 0.007 |
| 446.5 | 0.007 |
| 446.6 | 0.008 |
| 446.7 | 0.008 |
| 446.8 | 0.009 |
| 446.9 | 0.007 |
| 447.0 | 0.01 |
| 447.1 | 0.008 |
| 447.2 | 0.009 |
| 447.3 | 0.007 |
| 447.4 | 0.008 |
| 447.5 | 0.007 |
| 447.6 | 0.007 |
| 447.7 | 0.009 |
| 447.8 | 0.009 |
| 447.9 | 0.009 |
| 448.0 | 0.007 |
| 448.1 | 0.008 |
| 448.2 | 0.01 |
| 448.3 | 0.012 |
| 448.4 | 0.013 |
| 448.5 | 0.01 |
| 448.6 | 0.01 |
| 448.7 | 0.01 |
| 448.8 | 0.011 |
| 448.9 | 0.01 |
| 449.0 | 0.009 |
| 449.1 | 0.008 |
| 449.2 | 0.009 |
| 449.3 | 0.012 |
| 449.4 | 0.015 |
| 449.5 | 0.014 |
| 449.6 | 0.012 |
| 449.7 | 0.013 |
| 449.8 | 0.013 |
| 449.9 | 0.015 |
| 450.0 | 0.016 |
| 450.1 | 0.017 |
| 450.2 | 0.017 |
| 450.3 | 0.018 |
| 450.4 | 0.019 |
| 450.5 | 0.022 |
| 450.6 | 0.023 |
| 450.7 | 0.026 |
| 450.8 | 0.025 |
| 450.9 | 0.024 |
| 451.0 | 0.021 |
| 451.1 | 0.022 |
| 451.2 | 0.024 |
| 451.3 | 0.024 |
| 451.4 | 0.024 |
| 451.5 | 0.025 |
| 451.6 | 0.027 |
| 451.7 | 0.027 |
| 451.8 | 0.026 |
| 451.9 | 0.026 |
| 452.0 | 0.029 |
| 452.1 | 0.033 |
| 452.2 | 0.037 |
| 452.3 | 0.037 |
| 452.4 | 0.039 |
| 452.5 | 0.04 |
| 452.6 | 0.045 |
| 452.7 | 0.048 |
| 452.8 | 0.052 |
| 452.9 | 0.056 |
| 453.0 | 0.061 |
| 453.1 | 0.067 |
| 453.2 | 0.071 |
| 453.3 | 0.075 |
| 453.4 | 0.077 |
| 453.5 | 0.077 |
| 453.6 | 0.077 |
| 453.7 | 0.074 |
| 453.8 | 0.069 |
| 453.9 | 0.063 |
| 454.0 | 0.057 |
| 454.1 | 0.054 |
| 454.2 | 0.05 |
| 454.3 | 0.048 |
| 454.4 | 0.044 |
| 454.5 | 0.043 |
| 454.6 | 0.042 |
| 454.7 | 0.043 |
| 454.8 | 0.043 |
| 454.9 | 0.045 |
| 455.0 | 0.046 |
| 455.1 | 0.048 |
| 455.2 | 0.051 |
| 455.3 | 0.055 |
| 455.4 | 0.059 |
| 455.5 | 0.061 |
| 455.6 | 0.061 |
| 455.7 | 0.06 |
| 455.8 | 0.062 |
| 455.9 | 0.06 |
| 456.0 | 0.062 |
| 456.1 | 0.062 |
| 456.2 | 0.063 |
| 456.3 | 0.062 |
| 456.4 | 0.061 |
| 456.5 | 0.059 |
| 456.6 | 0.058 |
| 456.7 | 0.058 |
| 456.8 | 0.058 |
| 456.9 | 0.059 |
| 457.0 | 0.061 |
| 457.1 | 0.065 |
| 457.2 | 0.071 |
| 457.3 | 0.079 |
| 457.4 | 0.089 |
| 457.5 | 0.101 |
| 457.6 | 0.118 |
| 457.7 | 0.141 |
| 457.8 | 0.17 |
| 457.9 | 0.2 |
| 458.0 | 0.229 |
| 458.1 | 0.251 |
| 458.2 | 0.265 |
| 458.3 | 0.27 |
| 458.4 | 0.264 |
| 458.5 | 0.249 |
| 458.6 | 0.227 |
| 458.7 | 0.2 |
| 458.8 | 0.171 |
| 458.9 | 0.141 |
| 459.0 | 0.118 |
| 459.1 | 0.101 |
| 459.2 | 0.09 |
| 459.3 | 0.079 |
| 459.4 | 0.072 |
| 459.5 | 0.067 |
| 459.6 | 0.066 |
| 459.7 | 0.063 |
| 459.8 | 0.06 |
| 459.9 | 0.057 |
| 460.0 | 0.055 |
| 460.1 | 0.053 |
| 460.2 | 0.054 |
| 460.3 | 0.056 |
| 460.4 | 0.058 |
| 460.5 | 0.058 |
| 460.6 | 0.061 |
| 460.7 | 0.064 |
| 460.8 | 0.067 |
| 460.9 | 0.066 |
| 461.0 | 0.064 |
| 461.1 | 0.059 |
| 461.2 | 0.055 |
| 461.3 | 0.052 |
| 461.4 | 0.05 |
| 461.5 | 0.048 |
| 461.6 | 0.044 |
| 461.7 | 0.044 |
| 461.8 | 0.045 |
| 461.9 | 0.046 |
| 462.0 | 0.049 |
| 462.1 | 0.052 |
| 462.2 | 0.056 |
| 462.3 | 0.06 |
| 462.4 | 0.063 |
| 462.5 | 0.065 |
| 462.6 | 0.066 |
| 462.7 | 0.067 |
| 462.8 | 0.068 |
| 462.9 | 0.068 |
| 463.0 | 0.065 |
| 463.1 | 0.061 |
| 463.2 | 0.056 |
| 463.3 | 0.052 |
| 463.4 | 0.05 |
| 463.5 | 0.048 |
| 463.6 | 0.044 |
| 463.7 | 0.041 |
| 463.8 | 0.038 |
| 463.9 | 0.037 |
| 464.0 | 0.037 |
| 464.1 | 0.036 |
| 464.2 | 0.036 |
| 464.3 | 0.036 |
| 464.4 | 0.036 |
| 464.5 | 0.036 |
| 464.6 | 0.034 |
| 464.7 | 0.036 |
| 464.8 | 0.036 |
| 464.9 | 0.035 |
| 465.0 | 0.032 |
| 465.1 | 0.03 |
| 465.2 | 0.03 |
| 465.3 | 0.028 |
| 465.4 | 0.027 |
| 465.5 | 0.023 |
| 465.6 | 0.022 |
| 465.7 | 0.022 |
| 465.8 | 0.023 |
| 465.9 | 0.021 |
| 466.0 | 0.02 |
| 466.1 | 0.019 |
| 466.2 | 0.021 |
| 466.3 | 0.022 |
| 466.4 | 0.022 |
| 466.5 | 0.024 |
| 466.6 | 0.024 |
| 466.7 | 0.026 |
| 466.8 | 0.027 |
| 466.9 | 0.027 |
| 467.0 | 0.026 |
| 467.1 | 0.024 |
| 467.2 | 0.023 |
| 467.3 | 0.023 |
| 467.4 | 0.023 |
| 467.5 | 0.022 |
| 467.6 | 0.019 |
| 467.7 | 0.016 |
| 467.8 | 0.013 |
| 467.9 | 0.011 |
| 468.0 | 0.009 |
| 468.1 | 0.01 |
| 468.2 | 0.01 |
| 468.3 | 0.009 |
| 468.4 | 0.007 |
| 468.5 | 0.005 |
| 468.6 | 0.005 |
| 468.7 | 0.006 |
| 468.8 | 0.007 |
| 468.9 | 0.007 |
| 469.0 | 0.005 |
| 469.1 | 0.005 |
| 469.2 | 0.004 |
| 469.3 | 0.005 |
| 469.4 | 0.004 |
| 469.5 | 0.004 |
| 469.6 | 0.003 |
| 469.7 | 0.004 |
| 469.8 | 0.004 |
| 469.9 | 0.005 |
| 470.0 | 0.005 |
| 470.1 | 0.005 |
| 470.2 | 0.005 |
| 470.3 | 0.003 |
| 470.4 | 0.003 |
| 470.5 | 0.004 |
| 470.6 | 0.004 |
| 470.7 | 0.002 |
| 470.8 | 0.002 |
| 470.9 | 0.002 |
| 471.0 | 0.005 |
| 471.1 | 0.006 |
| 471.2 | 0.011 |
| 471.3 | 0.016 |
| 471.4 | 0.022 |
| 471.5 | 0.028 |
| 471.6 | 0.037 |
| 471.7 | 0.048 |
| 471.8 | 0.059 |
| 471.9 | 0.065 |
| 472.0 | 0.07 |
| 472.1 | 0.069 |
| 472.2 | 0.067 |
| 472.3 | 0.062 |
| 472.4 | 0.057 |
| 472.5 | 0.051 |
| 472.6 | 0.045 |
| 472.7 | 0.041 |
| 472.8 | 0.037 |
| 472.9 | 0.036 |
| 473.0 | 0.033 |
| 473.1 | 0.031 |
| 473.2 | 0.029 |
| 473.3 | 0.026 |
| 473.4 | 0.026 |
| 473.5 | 0.025 |
| 473.6 | 0.025 |
| 473.7 | 0.027 |
| 473.8 | 0.029 |
| 473.9 | 0.031 |
| 474.0 | 0.031 |
| 474.1 | 0.03 |
| 474.2 | 0.03 |
| 474.3 | 0.03 |
| 474.4 | 0.031 |
| 474.5 | 0.032 |
| 474.6 | 0.036 |
| 474.7 | 0.038 |
| 474.8 | 0.041 |
| 474.9 | 0.043 |
| 475.0 | 0.044 |
| 475.1 | 0.045 |
| 475.2 | 0.046 |
| 475.3 | 0.048 |
| 475.4 | 0.05 |
| 475.5 | 0.052 |
| 475.6 | 0.055 |
| 475.7 | 0.059 |
| 475.8 | 0.064 |
| 475.9 | 0.073 |
| 476.0 | 0.082 |
| 476.1 | 0.093 |
| 476.2 | 0.102 |
| 476.3 | 0.107 |
| 476.4 | 0.106 |
| 476.5 | 0.099 |
| 476.6 | 0.087 |
| 476.7 | 0.074 |
| 476.8 | 0.062 |
| 476.9 | 0.051 |
| 477.0 | 0.044 |
| 477.1 | 0.04 |
| 477.2 | 0.039 |
| 477.3 | 0.037 |
| 477.4 | 0.039 |
| 477.5 | 0.038 |
| 477.6 | 0.041 |
| 477.7 | 0.04 |
| 477.8 | 0.043 |
| 477.9 | 0.043 |
| 478.0 | 0.043 |
| 478.1 | 0.044 |
| 478.2 | 0.043 |
| 478.3 | 0.044 |
| 478.4 | 0.043 |
| 478.5 | 0.045 |
| 478.6 | 0.047 |
| 478.7 | 0.052 |
| 478.8 | 0.057 |
| 478.9 | 0.063 |
| 479.0 | 0.069 |
| 479.1 | 0.075 |
| 479.2 | 0.08 |
| 479.3 | 0.082 |
| 479.4 | 0.083 |
| 479.5 | 0.082 |
| 479.6 | 0.078 |
| 479.7 | 0.074 |
| 479.8 | 0.07 |
| 479.9 | 0.07 |
| 480.0 | 0.073 |
| 480.1 | 0.083 |
| 480.2 | 0.102 |
| 480.3 | 0.132 |
| 480.4 | 0.172 |
| 480.5 | 0.225 |
| 480.6 | 0.279 |
| 480.7 | 0.333 |
| 480.8 | 0.373 |
| 480.9 | 0.399 |
| 481.0 | 0.409 |
| 481.1 | 0.399 |
| 481.2 | 0.371 |
| 481.3 | 0.33 |
| 481.4 | 0.277 |
| 481.5 | 0.224 |
| 481.6 | 0.172 |
| 481.7 | 0.131 |
| 481.8 | 0.108 |
| 481.9 | 0.095 |
| 482.0 | 0.092 |
| 482.1 | 0.088 |
| 482.2 | 0.084 |
| 482.3 | 0.077 |
| 482.4 | 0.068 |
| 482.5 | 0.06 |
| 482.6 | 0.051 |
| 482.7 | 0.045 |
| 482.8 | 0.044 |
| 482.9 | 0.047 |
| 483.0 | 0.055 |
| 483.1 | 0.063 |
| 483.2 | 0.075 |
| 483.3 | 0.086 |
| 483.4 | 0.097 |
| 483.5 | 0.105 |
| 483.6 | 0.107 |
| 483.7 | 0.104 |
| 483.8 | 0.097 |
| 483.9 | 0.089 |
| 484.0 | 0.08 |
| 484.1 | 0.072 |
| 484.2 | 0.067 |
| 484.3 | 0.064 |
| 484.4 | 0.066 |
| 484.5 | 0.072 |
| 484.6 | 0.083 |
| 484.7 | 0.097 |
| 484.8 | 0.111 |
| 484.9 | 0.125 |
| 485.0 | 0.137 |
| 485.1 | 0.145 |
| 485.2 | 0.151 |
| 485.3 | 0.151 |
| 485.4 | 0.15 |
| 485.5 | 0.145 |
| 485.6 | 0.139 |
| 485.7 | 0.127 |
| 485.8 | 0.114 |
| 485.9 | 0.099 |
| 486.0 | 0.085 |
| 486.1 | 0.073 |
| 486.2 | 0.065 |
| 486.3 | 0.062 |
| 486.4 | 0.061 |
| 486.5 | 0.062 |
| 486.6 | 0.065 |
| 486.7 | 0.067 |
| 486.8 | 0.066 |
| 486.9 | 0.061 |
| 487.0 | 0.055 |
| 487.1 | 0.049 |
| 487.2 | 0.044 |
| 487.3 | 0.043 |
| 487.4 | 0.044 |
| 487.5 | 0.049 |
| 487.6 | 0.059 |
| 487.7 | 0.069 |
| 487.8 | 0.078 |
| 487.9 | 0.087 |
| 488.0 | 0.092 |
| 488.1 | 0.096 |
| 488.2 | 0.094 |
| 488.3 | 0.089 |
| 488.4 | 0.081 |
| 488.5 | 0.069 |
| 488.6 | 0.06 |
| 488.7 | 0.052 |
| 488.8 | 0.048 |
| 488.9 | 0.043 |
| 489.0 | 0.038 |
| 489.1 | 0.035 |
| 489.2 | 0.03 |
| 489.3 | 0.026 |
| 489.4 | 0.021 |
| 489.5 | 0.018 |
| 489.6 | 0.013 |
| 489.7 | 0.013 |
| 489.8 | 0.01 |
| 489.9 | 0.009 |
| 490.0 | 0.005 |
| 490.1 | 0.004 |
| 490.2 | 0.005 |
| 490.3 | 0.004 |
| 490.4 | 0.005 |
| 490.5 | 0.004 |
| 490.6 | 0.003 |
| 490.7 | 0.002 |
| 490.8 | 0.003 |
| 490.9 | 0.003 |
| 491.0 | 0.001 |
| 491.1 | 0.001 |
| 491.2 | 0.001 |
| 491.3 | 0.003 |
| 491.4 | 0.003 |
| 491.5 | 0.004 |
| 491.6 | 0.003 |
| 491.7 | 0.004 |
| 491.8 | 0.005 |
| 491.9 | 0.006 |
| 492.0 | 0.005 |
| 492.1 | 0.003 |
| 492.2 | 0.003 |
| 492.3 | 0.002 |
| 492.4 | 0.003 |
| 492.5 | 0.004 |
| 492.6 | 0.004 |
| 492.7 | 0.002 |
| 492.8 | 0 |
| 492.9 | 0.001 |
| 493.0 | 0.001 |
| 493.1 | 0.003 |
| 493.2 | 0.005 |
| 493.3 | 0.007 |
| 493.4 | 0.005 |
| 493.5 | 0.006 |
| 493.6 | 0.007 |
| 493.7 | 0.008 |
| 493.8 | 0.006 |
| 493.9 | 0.005 |
| 494.0 | 0.005 |
| 494.1 | 0.007 |
| 494.2 | 0.006 |
| 494.3 | 0.006 |
| 494.4 | 0.007 |
| 494.5 | 0.007 |
| 494.6 | 0.007 |
| 494.7 | 0.005 |
| 494.8 | 0.006 |
| 494.9 | 0.006 |
| 495.0 | 0.005 |
| 495.1 | 0.005 |
| 495.2 | 0.007 |
| 495.3 | 0.01 |
| 495.4 | 0.011 |
| 495.5 | 0.01 |
| 495.6 | 0.008 |
| 495.7 | 0.01 |
| 495.8 | 0.011 |
| 495.9 | 0.012 |
| 496.0 | 0.011 |
| 496.1 | 0.011 |
| 496.2 | 0.013 |
| 496.3 | 0.016 |
| 496.4 | 0.015 |
| 496.5 | 0.015 |
| 496.6 | 0.015 |
| 496.7 | 0.017 |
| 496.8 | 0.018 |
| 496.9 | 0.021 |
| 497.0 | 0.025 |
| 497.1 | 0.027 |
| 497.2 | 0.028 |
| 497.3 | 0.031 |
| 497.4 | 0.036 |
| 497.5 | 0.04 |
| 497.6 | 0.044 |
| 497.7 | 0.047 |
| 497.8 | 0.051 |
| 497.9 | 0.055 |
| 498.0 | 0.059 |
| 498.1 | 0.064 |
| 498.2 | 0.066 |
| 498.3 | 0.071 |
| 498.4 | 0.074 |
| 498.5 | 0.077 |
| 498.6 | 0.076 |
| 498.7 | 0.074 |
| 498.8 | 0.073 |
| 498.9 | 0.071 |
| 499.0 | 0.069 |
| 499.1 | 0.065 |
| 499.2 | 0.063 |
| 499.3 | 0.061 |
| 499.4 | 0.057 |
| 499.5 | 0.054 |
| 499.6 | 0.05 |
| 499.7 | 0.049 |
| 499.8 | 0.049 |
| 499.9 | 0.048 |
| 500.0 | 0.044 |
| 500.1 | 0.041 |
| 500.2 | 0.04 |
| 500.3 | 0.04 |
| 500.4 | 0.039 |
| 500.5 | 0.041 |
| 500.6 | 0.042 |
| 500.7 | 0.043 |
| 500.8 | 0.042 |
| 500.9 | 0.042 |
| 501.0 | 0.042 |
| 501.1 | 0.043 |
| 501.2 | 0.045 |
| 501.3 | 0.047 |
| 501.4 | 0.05 |
| 501.5 | 0.05 |
| 501.6 | 0.052 |
| 501.7 | 0.052 |
| 501.8 | 0.053 |
| 501.9 | 0.053 |
| 502.0 | 0.055 |
| 502.1 | 0.057 |
| 502.2 | 0.058 |
| 502.3 | 0.059 |
| 502.4 | 0.058 |
| 502.5 | 0.06 |
| 502.6 | 0.061 |
| 502.7 | 0.065 |
| 502.8 | 0.07 |
| 502.9 | 0.072 |
| 503.0 | 0.075 |
| 503.1 | 0.077 |
| 503.2 | 0.081 |
| 503.3 | 0.084 |
| 503.4 | 0.086 |
| 503.5 | 0.086 |
| 503.6 | 0.085 |
| 503.7 | 0.083 |
| 503.8 | 0.084 |
| 503.9 | 0.082 |
| 504.0 | 0.081 |
| 504.1 | 0.081 |
| 504.2 | 0.079 |
| 504.3 | 0.077 |
| 504.4 | 0.073 |
| 504.5 | 0.073 |
| 504.6 | 0.071 |
| 504.7 | 0.071 |
| 504.8 | 0.069 |
| 504.9 | 0.07 |
| 505.0 | 0.068 |
| 505.1 | 0.068 |
| 505.2 | 0.068 |
| 505.3 | 0.069 |
| 505.4 | 0.07 |
| 505.5 | 0.07 |
| 505.6 | 0.072 |
| 505.7 | 0.075 |
| 505.8 | 0.077 |
| 505.9 | 0.079 |
| 506.0 | 0.079 |
| 506.1 | 0.081 |
| 506.2 | 0.081 |
| 506.3 | 0.082 |
| 506.4 | 0.083 |
| 506.5 | 0.085 |
| 506.6 | 0.086 |
| 506.7 | 0.087 |
| 506.8 | 0.088 |
| 506.9 | 0.089 |
| 507.0 | 0.089 |
| 507.1 | 0.089 |
| 507.2 | 0.089 |
| 507.3 | 0.09 |
| 507.4 | 0.09 |
| 507.5 | 0.091 |
| 507.6 | 0.091 |
| 507.7 | 0.094 |
| 507.8 | 0.096 |
| 507.9 | 0.099 |
| 508.0 | 0.099 |
| 508.1 | 0.104 |
| 508.2 | 0.108 |
| 508.3 | 0.114 |
| 508.4 | 0.117 |
| 508.5 | 0.122 |
| 508.6 | 0.13 |
| 508.7 | 0.137 |
| 508.8 | 0.145 |
| 508.9 | 0.152 |
| 509.0 | 0.16 |
| 509.1 | 0.167 |
| 509.2 | 0.174 |
| 509.3 | 0.183 |
| 509.4 | 0.191 |
| 509.5 | 0.201 |
| 509.6 | 0.206 |
| 509.7 | 0.215 |
| 509.8 | 0.224 |
| 509.9 | 0.24 |
| 510.0 | 0.257 |
| 510.1 | 0.278 |
| 510.2 | 0.303 |
| 510.3 | 0.327 |
| 510.4 | 0.351 |
| 510.5 | 0.364 |
| 510.6 | 0.368 |
| 510.7 | 0.361 |
| 510.8 | 0.345 |
| 510.9 | 0.321 |
| 511.0 | 0.296 |
| 511.1 | 0.271 |
| 511.2 | 0.249 |
| 511.3 | 0.231 |
| 511.4 | 0.219 |
| 511.5 | 0.214 |
| 511.6 | 0.209 |
| 511.7 | 0.207 |
| 511.8 | 0.204 |
| 511.9 | 0.206 |
| 512.0 | 0.211 |
| 512.1 | 0.214 |
| 512.2 | 0.218 |
| 512.3 | 0.219 |
| 512.4 | 0.224 |
| 512.5 | 0.225 |
| 512.6 | 0.227 |
| 512.7 | 0.227 |
| 512.8 | 0.225 |
| 512.9 | 0.223 |
| 513.0 | 0.22 |
| 513.1 | 0.219 |
| 513.2 | 0.218 |
| 513.3 | 0.22 |
| 513.4 | 0.223 |
| 513.5 | 0.228 |
| 513.6 | 0.23 |
| 513.7 | 0.232 |
| 513.8 | 0.231 |
| 513.9 | 0.233 |
| 514.0 | 0.233 |
| 514.1 | 0.236 |
| 514.2 | 0.239 |
| 514.3 | 0.244 |
| 514.4 | 0.249 |
| 514.5 | 0.254 |
| 514.6 | 0.262 |
| 514.7 | 0.267 |
| 514.8 | 0.272 |
| 514.9 | 0.276 |
| 515.0 | 0.282 |
| 515.1 | 0.288 |
| 515.2 | 0.294 |
| 515.3 | 0.3 |
| 515.4 | 0.306 |
| 515.5 | 0.31 |
| 515.6 | 0.311 |
| 515.7 | 0.305 |
| 515.8 | 0.292 |
| 515.9 | 0.275 |
| 516.0 | 0.256 |
| 516.1 | 0.239 |
| 516.2 | 0.22 |
| 516.3 | 0.203 |
| 516.4 | 0.187 |
| 516.5 | 0.178 |
| 516.6 | 0.169 |
| 516.7 | 0.165 |
| 516.8 | 0.16 |
| 516.9 | 0.158 |
| 517.0 | 0.155 |
| 517.1 | 0.157 |
| 517.2 | 0.16 |
| 517.3 | 0.166 |
| 517.4 | 0.171 |
| 517.5 | 0.173 |
| 517.6 | 0.172 |
| 517.7 | 0.17 |
| 517.8 | 0.168 |
| 517.9 | 0.166 |
| 518.0 | 0.162 |
| 518.1 | 0.155 |
| 518.2 | 0.147 |
| 518.3 | 0.139 |
| 518.4 | 0.134 |
| 518.5 | 0.131 |
| 518.6 | 0.129 |
| 518.7 | 0.126 |
| 518.8 | 0.124 |
| 518.9 | 0.125 |
| 519.0 | 0.126 |
| 519.1 | 0.127 |
| 519.2 | 0.133 |
| 519.3 | 0.139 |
| 519.4 | 0.149 |
| 519.5 | 0.158 |
| 519.6 | 0.171 |
| 519.7 | 0.184 |
| 519.8 | 0.203 |
| 519.9 | 0.226 |
| 520.0 | 0.25 |
| 520.1 | 0.27 |
| 520.2 | 0.286 |
| 520.3 | 0.295 |
| 520.4 | 0.299 |
| 520.5 | 0.294 |
| 520.6 | 0.281 |
| 520.7 | 0.263 |
| 520.8 | 0.241 |
| 520.9 | 0.219 |
| 521.0 | 0.195 |
| 521.1 | 0.176 |
| 521.2 | 0.163 |
| 521.3 | 0.153 |
| 521.4 | 0.145 |
| 521.5 | 0.138 |
| 521.6 | 0.131 |
| 521.7 | 0.125 |
| 521.8 | 0.117 |
| 521.9 | 0.113 |
| 522.0 | 0.11 |
| 522.1 | 0.111 |
| 522.2 | 0.111 |
| 522.3 | 0.11 |
| 522.4 | 0.11 |
| 522.5 | 0.109 |
| 522.6 | 0.108 |
| 522.7 | 0.104 |
| 522.8 | 0.101 |
| 522.9 | 0.099 |
| 523.0 | 0.096 |
| 523.1 | 0.094 |
| 523.2 | 0.092 |
| 523.3 | 0.092 |
| 523.4 | 0.09 |
| 523.5 | 0.089 |
| 523.6 | 0.084 |
| 523.7 | 0.082 |
| 523.8 | 0.079 |
| 523.9 | 0.079 |
| 524.0 | 0.082 |
| 524.1 | 0.083 |
| 524.2 | 0.087 |
| 524.3 | 0.088 |
| 524.4 | 0.091 |
| 524.5 | 0.093 |
| 524.6 | 0.097 |
| 524.7 | 0.1 |
| 524.8 | 0.105 |
| 524.9 | 0.109 |
| 525.0 | 0.115 |
| 525.1 | 0.124 |
| 525.2 | 0.138 |
| 525.3 | 0.156 |
| 525.4 | 0.179 |
| 525.5 | 0.207 |
| 525.6 | 0.25 |
| 525.7 | 0.309 |
| 525.8 | 0.384 |
| 525.9 | 0.472 |
| 526.0 | 0.576 |
| 526.1 | 0.691 |
| 526.2 | 0.793 |
| 526.3 | 0.86 |
| 526.4 | 0.887 |
| 526.5 | 0.867 |
| 526.6 | 0.803 |
| 526.7 | 0.708 |
| 526.8 | 0.602 |
| 526.9 | 0.497 |
| 527.0 | 0.404 |
| 527.1 | 0.325 |
| 527.2 | 0.272 |
| 527.3 | 0.23 |
| 527.4 | 0.196 |
| 527.5 | 0.166 |
| 527.6 | 0.142 |
| 527.7 | 0.126 |
| 527.8 | 0.116 |
| 527.9 | 0.108 |
| 528.0 | 0.102 |
| 528.1 | 0.096 |
| 528.2 | 0.092 |
| 528.3 | 0.09 |
| 528.4 | 0.088 |
| 528.5 | 0.088 |
| 528.6 | 0.088 |
| 528.7 | 0.091 |
| 528.8 | 0.095 |
| 528.9 | 0.101 |
| 529.0 | 0.11 |
| 529.1 | 0.122 |
| 529.2 | 0.133 |
| 529.3 | 0.152 |
| 529.4 | 0.172 |
| 529.5 | 0.202 |
| 529.6 | 0.231 |
| 529.7 | 0.265 |
| 529.8 | 0.307 |
| 529.9 | 0.358 |
| 530.0 | 0.428 |
| 530.1 | 0.506 |
| 530.2 | 0.598 |
| 530.3 | 0.697 |
| 530.4 | 0.794 |
| 530.5 | 0.878 |
| 530.6 | 0.93 |
| 530.7 | 0.961 |
| 530.8 | 0.97 |
| 530.9 | 0.964 |
| 531.0 | 0.944 |
| 531.1 | 0.909 |
| 531.2 | 0.862 |
| 531.3 | 0.802 |
| 531.4 | 0.733 |
| 531.5 | 0.659 |
| 531.6 | 0.595 |
| 531.7 | 0.538 |
| 531.8 | 0.49 |
| 531.9 | 0.442 |
| 532.0 | 0.396 |
| 532.1 | 0.348 |
| 532.2 | 0.296 |
| 532.3 | 0.242 |
| 532.4 | 0.194 |
| 532.5 | 0.154 |
| 532.6 | 0.124 |
| 532.7 | 0.104 |
| 532.8 | 0.093 |
| 532.9 | 0.088 |
| 533.0 | 0.092 |
| 533.1 | 0.101 |
| 533.2 | 0.118 |
| 533.3 | 0.138 |
| 533.4 | 0.162 |
| 533.5 | 0.189 |
| 533.6 | 0.21 |
| 533.7 | 0.232 |
| 533.8 | 0.241 |
| 533.9 | 0.248 |
| 534.0 | 0.241 |
| 534.1 | 0.232 |
| 534.2 | 0.218 |
| 534.3 | 0.203 |
| 534.4 | 0.19 |
| 534.5 | 0.182 |
| 534.6 | 0.176 |
| 534.7 | 0.171 |
| 534.8 | 0.166 |
| 534.9 | 0.16 |
| 535.0 | 0.153 |
| 535.1 | 0.146 |
| 535.2 | 0.141 |
| 535.3 | 0.139 |
| 535.4 | 0.143 |
| 535.5 | 0.155 |
| 535.6 | 0.172 |
| 535.7 | 0.196 |
| 535.8 | 0.223 |
| 535.9 | 0.254 |
| 536.0 | 0.282 |
| 536.1 | 0.311 |
| 536.2 | 0.338 |
| 536.3 | 0.368 |
| 536.4 | 0.394 |
| 536.5 | 0.419 |
| 536.6 | 0.435 |
| 536.7 | 0.441 |
| 536.8 | 0.434 |
| 536.9 | 0.411 |
| 537.0 | 0.38 |
| 537.1 | 0.341 |
| 537.2 | 0.298 |
| 537.3 | 0.251 |
| 537.4 | 0.208 |
| 537.5 | 0.172 |
| 537.6 | 0.144 |
| 537.7 | 0.12 |
| 537.8 | 0.101 |
| 537.9 | 0.084 |
| 538.0 | 0.073 |
| 538.1 | 0.068 |
| 538.2 | 0.067 |
| 538.3 | 0.069 |
| 538.4 | 0.073 |
| 538.5 | 0.082 |
| 538.6 | 0.093 |
| 538.7 | 0.11 |
| 538.8 | 0.124 |
| 538.9 | 0.139 |
| 539.0 | 0.15 |
| 539.1 | 0.157 |
| 539.2 | 0.156 |
| 539.3 | 0.146 |
| 539.4 | 0.132 |
| 539.5 | 0.116 |
| 539.6 | 0.098 |
| 539.7 | 0.082 |
| 539.8 | 0.068 |
| 539.9 | 0.056 |
| 540.0 | 0.047 |
| 540.1 | 0.041 |
| 540.2 | 0.036 |
| 540.3 | 0.031 |
| 540.4 | 0.027 |
| 540.5 | 0.022 |
| 540.6 | 0.02 |
| 540.7 | 0.016 |
| 540.8 | 0.016 |
| 540.9 | 0.016 |
| 541.0 | 0.016 |
| 541.1 | 0.017 |
| 541.2 | 0.016 |
| 541.3 | 0.017 |
| 541.4 | 0.019 |
| 541.5 | 0.02 |
| 541.6 | 0.023 |
| 541.7 | 0.026 |
| 541.8 | 0.031 |
| 541.9 | 0.036 |
| 542.0 | 0.041 |
| 542.1 | 0.046 |
| 542.2 | 0.05 |
| 542.3 | 0.051 |
| 542.4 | 0.05 |
| 542.5 | 0.046 |
| 542.6 | 0.04 |
| 542.7 | 0.036 |
| 542.8 | 0.032 |
| 542.9 | 0.029 |
| 543.0 | 0.023 |
| 543.1 | 0.019 |
| 543.2 | 0.016 |
| 543.3 | 0.014 |
| 543.4 | 0.013 |
| 543.5 | 0.01 |
| 543.6 | 0.008 |
| 543.7 | 0.005 |
| 543.8 | 0.006 |
| 543.9 | 0.005 |
| 544.0 | 0.007 |
| 544.1 | 0.005 |
| 544.2 | 0.005 |
| 544.3 | 0.006 |
| 544.4 | 0.005 |
| 544.5 | 0.006 |
| 544.6 | 0.003 |
| 544.7 | 0.003 |
| 544.8 | 0.002 |
| 544.9 | 0.003 |
| 545.0 | 0.004 |
| 545.1 | 0.002 |
| 545.2 | 0.002 |
| 545.3 | 0.003 |
| 545.4 | 0.004 |
| 545.5 | 0.001 |
| 545.6 | 0 |
| 545.7 | 0 |
| 545.8 | 0 |
| 545.9 | 0.001 |
| 546.0 | 0.001 |
| 546.1 | 0.001 |
| 546.2 | 0.003 |
| 546.3 | 0.004 |
| 546.4 | 0.001 |
| 546.5 | 0 |
| 546.6 | 0 |
| 546.7 | 0.001 |
| 546.8 | 0.001 |
| 546.9 | 0.003 |
| 547.0 | 0.001 |
| 547.1 | 0.002 |
| 547.2 | 0.002 |
| 547.3 | 0.003 |
| 547.4 | 0.003 |
| 547.5 | 0.003 |
| 547.6 | 0 |
| 547.7 | 0 |
| 547.8 | 0 |
| 547.9 | 0 |
| 548.0 | 0 |
| 548.1 | 0.003 |
| 548.2 | 0.002 |
| 548.3 | 0.002 |
| 548.4 | 0.001 |
| 548.5 | 0.001 |
| 548.6 | 0.001 |
| 548.7 | 0.001 |
| 548.8 | 0.002 |
| 548.9 | 0.002 |
| 549.0 | 0.003 |
| 549.1 | 0.003 |
| 549.2 | 0.003 |
| 549.3 | 0.003 |
| 549.4 | 0.003 |
| 549.5 | 0.003 |
| 549.6 | 0.004 |
| 549.7 | 0.002 |
| 549.8 | 0.001 |
| 549.9 | 0.003 |
| 550.0 | 0.002 |
| 550.1 | 0.003 |
| 550.2 | 0.002 |
| 550.3 | 0.002 |
| 550.4 | 0.003 |
| 550.5 | 0.004 |
| 550.6 | 0.006 |
| 550.7 | 0.006 |
| 550.8 | 0.008 |
| 550.9 | 0.007 |
| 551.0 | 0.007 |
| 551.1 | 0.006 |
| 551.2 | 0.007 |
| 551.3 | 0.009 |
| 551.4 | 0.013 |
| 551.5 | 0.016 |
| 551.6 | 0.02 |
| 551.7 | 0.024 |
| 551.8 | 0.028 |
| 551.9 | 0.031 |
| 552.0 | 0.033 |
| 552.1 | 0.032 |
| 552.2 | 0.029 |
| 552.3 | 0.025 |
| 552.4 | 0.021 |
| 552.5 | 0.016 |
| 552.6 | 0.012 |
| 552.7 | 0.009 |
| 552.8 | 0.008 |
| 552.9 | 0.008 |
| 553.0 | 0.007 |
| 553.1 | 0.005 |
| 553.2 | 0.006 |
| 553.3 | 0.004 |
| 553.4 | 0.004 |
| 553.5 | 0.004 |
| 553.6 | 0.007 |
| 553.7 | 0.006 |
| 553.8 | 0.003 |
| 553.9 | 0.002 |
| 554.0 | 0.001 |
| 554.1 | 0.001 |
| 554.2 | 0.001 |
| 554.3 | 0.002 |
| 554.4 | 0.003 |
| 554.5 | 0.005 |
| 554.6 | 0.004 |
| 554.7 | 0.003 |
| 554.8 | 0.002 |
| 554.9 | 0.002 |
| 555.0 | 0.002 |
| 555.1 | 0.003 |
| 555.2 | 0.006 |
| 555.3 | 0.007 |
| 555.4 | 0.007 |
| 555.5 | 0.008 |
| 555.6 | 0.01 |
| 555.7 | 0.008 |
| 555.8 | 0.008 |
| 555.9 | 0.008 |
| 556.0 | 0.009 |
| 556.1 | 0.009 |
| 556.2 | 0.009 |
| 556.3 | 0.012 |
| 556.4 | 0.012 |
| 556.5 | 0.012 |
| 556.6 | 0.014 |
| 556.7 | 0.017 |
| 556.8 | 0.019 |
| 556.9 | 0.018 |
| 557.0 | 0.018 |
| 557.1 | 0.017 |
| 557.2 | 0.017 |
| 557.3 | 0.018 |
| 557.4 | 0.02 |
| 557.5 | 0.021 |
| 557.6 | 0.021 |
| 557.7 | 0.021 |
| 557.8 | 0.02 |
| 557.9 | 0.019 |
| 558.0 | 0.018 |
| 558.1 | 0.018 |
| 558.2 | 0.019 |
| 558.3 | 0.021 |
| 558.4 | 0.021 |
| 558.5 | 0.02 |
| 558.6 | 0.019 |
| 558.7 | 0.021 |
| 558.8 | 0.023 |
| 558.9 | 0.024 |
| 559.0 | 0.022 |
| 559.1 | 0.022 |
| 559.2 | 0.023 |
| 559.3 | 0.025 |
| 559.4 | 0.025 |
| 559.5 | 0.026 |
| 559.6 | 0.025 |
| 559.7 | 0.026 |
| 559.8 | 0.024 |
| 559.9 | 0.025 |
| 560.0 | 0.028 |
| 560.1 | 0.029 |
| 560.2 | 0.031 |
| 560.3 | 0.031 |
| 560.4 | 0.032 |
| 560.5 | 0.033 |
| 560.6 | 0.035 |
| 560.7 | 0.036 |
| 560.8 | 0.037 |
| 560.9 | 0.034 |
| 561.0 | 0.034 |
| 561.1 | 0.033 |
| 561.2 | 0.033 |
| 561.3 | 0.032 |
| 561.4 | 0.031 |
| 561.5 | 0.033 |
| 561.6 | 0.033 |
| 561.7 | 0.032 |
| 561.8 | 0.031 |
| 561.9 | 0.029 |
| 562.0 | 0.029 |
| 562.1 | 0.029 |
| 562.2 | 0.029 |
| 562.3 | 0.031 |
| 562.4 | 0.031 |
| 562.5 | 0.032 |
| 562.6 | 0.033 |
| 562.7 | 0.032 |
| 562.8 | 0.032 |
| 562.9 | 0.032 |
| 563.0 | 0.032 |
| 563.1 | 0.032 |
| 563.2 | 0.031 |
| 563.3 | 0.033 |
| 563.4 | 0.034 |
| 563.5 | 0.034 |
| 563.6 | 0.034 |
| 563.7 | 0.034 |
| 563.8 | 0.035 |
| 563.9 | 0.037 |
| 564.0 | 0.038 |
| 564.1 | 0.039 |
| 564.2 | 0.04 |
| 564.3 | 0.041 |
| 564.4 | 0.043 |
| 564.5 | 0.043 |
| 564.6 | 0.043 |
| 564.7 | 0.043 |
| 564.8 | 0.042 |
| 564.9 | 0.043 |
| 565.0 | 0.043 |
| 565.1 | 0.045 |
| 565.2 | 0.046 |
| 565.3 | 0.047 |
| 565.4 | 0.046 |
| 565.5 | 0.047 |
| 565.6 | 0.048 |
| 565.7 | 0.051 |
| 565.8 | 0.053 |
| 565.9 | 0.053 |
| 566.0 | 0.053 |
| 566.1 | 0.052 |
| 566.2 | 0.053 |
| 566.3 | 0.052 |
| 566.4 | 0.054 |
| 566.5 | 0.052 |
| 566.6 | 0.053 |
| 566.7 | 0.054 |
| 566.8 | 0.055 |
| 566.9 | 0.056 |
| 567.0 | 0.057 |
| 567.1 | 0.058 |
| 567.2 | 0.058 |
| 567.3 | 0.059 |
| 567.4 | 0.058 |
| 567.5 | 0.059 |
| 567.6 | 0.062 |
| 567.7 | 0.066 |
| 567.8 | 0.067 |
| 567.9 | 0.07 |
| 568.0 | 0.073 |
| 568.1 | 0.077 |
| 568.2 | 0.08 |
| 568.3 | 0.085 |
| 568.4 | 0.091 |
| 568.5 | 0.098 |
| 568.6 | 0.109 |
| 568.7 | 0.121 |
| 568.8 | 0.139 |
| 568.9 | 0.162 |
| 569.0 | 0.195 |
| 569.1 | 0.233 |
| 569.2 | 0.283 |
| 569.3 | 0.349 |
| 569.4 | 0.438 |
| 569.5 | 0.546 |
| 569.6 | 0.666 |
| 569.7 | 0.787 |
| 569.8 | 0.893 |
| 569.9 | 0.966 |
| 570.0 | 0.986 |
| 570.1 | 0.958 |
| 570.2 | 0.892 |
| 570.3 | 0.803 |
| 570.4 | 0.705 |
| 570.5 | 0.611 |
| 570.6 | 0.529 |
| 570.7 | 0.454 |
| 570.8 | 0.387 |
| 570.9 | 0.333 |
| 571.0 | 0.288 |
| 571.1 | 0.253 |
| 571.2 | 0.221 |
| 571.3 | 0.196 |
| 571.4 | 0.172 |
| 571.5 | 0.154 |
| 571.6 | 0.139 |
| 571.7 | 0.129 |
| 571.8 | 0.122 |
| 571.9 | 0.117 |
| 572.0 | 0.115 |
| 572.1 | 0.116 |
| 572.2 | 0.116 |
| 572.3 | 0.118 |
| 572.4 | 0.121 |
| 572.5 | 0.125 |
| 572.6 | 0.129 |
| 572.7 | 0.135 |
| 572.8 | 0.143 |
| 572.9 | 0.151 |
| 573.0 | 0.159 |
| 573.1 | 0.168 |
| 573.2 | 0.18 |
| 573.3 | 0.194 |
| 573.4 | 0.213 |
| 573.5 | 0.236 |
| 573.6 | 0.267 |
| 573.7 | 0.305 |
| 573.8 | 0.349 |
| 573.9 | 0.397 |
| 574.0 | 0.441 |
| 574.1 | 0.48 |
| 574.2 | 0.511 |
| 574.3 | 0.533 |
| 574.4 | 0.541 |
| 574.5 | 0.535 |
| 574.6 | 0.515 |
| 574.7 | 0.482 |
| 574.8 | 0.441 |
| 574.9 | 0.394 |
| 575.0 | 0.353 |
| 575.1 | 0.313 |
| 575.2 | 0.278 |
| 575.3 | 0.247 |
| 575.4 | 0.221 |
| 575.5 | 0.199 |
| 575.6 | 0.182 |
| 575.7 | 0.169 |
| 575.8 | 0.16 |
| 575.9 | 0.153 |
| 576.0 | 0.147 |
| 576.1 | 0.143 |
| 576.2 | 0.14 |
| 576.3 | 0.14 |
| 576.4 | 0.141 |
| 576.5 | 0.141 |
| 576.6 | 0.142 |
| 576.7 | 0.144 |
| 576.8 | 0.147 |
| 576.9 | 0.147 |
| 577.0 | 0.146 |
| 577.1 | 0.144 |
| 577.2 | 0.14 |
| 577.3 | 0.138 |
| 577.4 | 0.134 |
| 577.5 | 0.131 |
| 577.6 | 0.128 |
| 577.7 | 0.128 |
| 577.8 | 0.127 |
| 577.9 | 0.126 |
| 578.0 | 0.124 |
| 578.1 | 0.124 |
| 578.2 | 0.125 |
| 578.3 | 0.129 |
| 578.4 | 0.134 |
| 578.5 | 0.14 |
| 578.6 | 0.148 |
| 578.7 | 0.156 |
| 578.8 | 0.166 |
| 578.9 | 0.174 |
| 579.0 | 0.181 |
| 579.1 | 0.184 |
| 579.2 | 0.185 |
| 579.3 | 0.183 |
| 579.4 | 0.181 |
| 579.5 | 0.179 |
| 579.6 | 0.178 |
| 579.7 | 0.183 |
| 579.8 | 0.188 |
| 579.9 | 0.199 |
| 580.0 | 0.211 |
| 580.1 | 0.23 |
| 580.2 | 0.257 |
| 580.3 | 0.292 |
| 580.4 | 0.337 |
| 580.5 | 0.388 |
| 580.6 | 0.452 |
| 580.7 | 0.522 |
| 580.8 | 0.595 |
| 580.9 | 0.657 |
| 581.0 | 0.697 |
| 581.1 | 0.716 |
| 581.2 | 0.71 |
| 581.3 | 0.683 |
| 581.4 | 0.64 |
| 581.5 | 0.583 |
| 581.6 | 0.52 |
| 581.7 | 0.454 |
| 581.8 | 0.393 |
| 581.9 | 0.342 |
| 582.0 | 0.299 |
| 582.1 | 0.263 |
| 582.2 | 0.234 |
| 582.3 | 0.212 |
| 582.4 | 0.198 |
| 582.5 | 0.187 |
| 582.6 | 0.182 |
| 582.7 | 0.178 |
| 582.8 | 0.177 |
| 582.9 | 0.177 |
| 583.0 | 0.178 |
| 583.1 | 0.178 |
| 583.2 | 0.179 |
| 583.3 | 0.176 |
| 583.4 | 0.174 |
| 583.5 | 0.171 |
| 583.6 | 0.168 |
| 583.7 | 0.165 |
| 583.8 | 0.165 |
| 583.9 | 0.166 |
| 584.0 | 0.169 |
| 584.1 | 0.172 |
| 584.2 | 0.181 |
| 584.3 | 0.191 |
| 584.4 | 0.205 |
| 584.5 | 0.22 |
| 584.6 | 0.24 |
| 584.7 | 0.262 |
| 584.8 | 0.288 |
| 584.9 | 0.313 |
| 585.0 | 0.341 |
| 585.1 | 0.37 |
| 585.2 | 0.4 |
| 585.3 | 0.423 |
| 585.4 | 0.44 |
| 585.5 | 0.452 |
| 585.6 | 0.453 |
| 585.7 | 0.443 |
| 585.8 | 0.422 |
| 585.9 | 0.396 |
| 586.0 | 0.366 |
| 586.1 | 0.333 |
| 586.2 | 0.301 |
| 586.3 | 0.275 |
| 586.4 | 0.255 |
| 586.5 | 0.24 |
| 586.6 | 0.231 |
| 586.7 | 0.226 |
| 586.8 | 0.229 |
| 586.9 | 0.235 |
| 587.0 | 0.247 |
| 587.1 | 0.263 |
| 587.2 | 0.282 |
| 587.3 | 0.301 |
| 587.4 | 0.32 |
| 587.5 | 0.337 |
| 587.6 | 0.352 |
| 587.7 | 0.367 |
| 587.8 | 0.39 |
| 587.9 | 0.424 |
| 588.0 | 0.471 |
| 588.1 | 0.525 |
| 588.2 | 0.575 |
| 588.3 | 0.608 |
| 588.4 | 0.619 |
| 588.5 | 0.604 |
| 588.6 | 0.571 |
| 588.7 | 0.536 |
| 588.8 | 0.511 |
| 588.9 | 0.506 |
| 589.0 | 0.524 |
| 589.1 | 0.576 |
| 589.2 | 0.659 |
| 589.3 | 0.789 |
| 589.4 | 0.953 |
| 589.5 | 1.145 |
| 589.6 | 1.321 |
| 589.7 | 1.47 |
| 589.8 | 1.572 |
| 589.9 | 1.623 |
| 590.0 | 1.615 |
| 590.1 | 1.553 |
| 590.2 | 1.444 |
| 590.3 | 1.299 |
| 590.4 | 1.137 |
| 590.5 | 0.973 |
| 590.6 | 0.836 |
| 590.7 | 0.722 |
| 590.8 | 0.63 |
| 590.9 | 0.558 |
| 591.0 | 0.504 |
| 591.1 | 0.472 |
| 591.2 | 0.451 |
| 591.3 | 0.44 |
| 591.4 | 0.443 |
| 591.5 | 0.457 |
| 591.6 | 0.486 |
| 591.7 | 0.523 |
| 591.8 | 0.571 |
| 591.9 | 0.618 |
| 592.0 | 0.661 |
| 592.1 | 0.687 |
| 592.2 | 0.694 |
| 592.3 | 0.673 |
| 592.4 | 0.631 |
| 592.5 | 0.576 |
| 592.6 | 0.521 |
| 592.7 | 0.468 |
| 592.8 | 0.424 |
| 592.9 | 0.389 |
| 593.0 | 0.37 |
| 593.1 | 0.365 |
| 593.2 | 0.375 |
| 593.3 | 0.398 |
| 593.4 | 0.429 |
| 593.5 | 0.464 |
| 593.6 | 0.495 |
| 593.7 | 0.519 |
| 593.8 | 0.531 |
| 593.9 | 0.534 |
| 594.0 | 0.529 |
| 594.1 | 0.523 |
| 594.2 | 0.515 |
| 594.3 | 0.513 |
| 594.4 | 0.518 |
| 594.5 | 0.526 |
| 594.6 | 0.527 |
| 594.7 | 0.514 |
| 594.8 | 0.483 |
| 594.9 | 0.436 |
| 595.0 | 0.379 |
| 595.1 | 0.316 |
| 595.2 | 0.263 |
| 595.3 | 0.215 |
| 595.4 | 0.185 |
| 595.5 | 0.162 |
| 595.6 | 0.153 |
| 595.7 | 0.145 |
| 595.8 | 0.143 |
| 595.9 | 0.144 |
| 596.0 | 0.151 |
| 596.1 | 0.157 |
| 596.2 | 0.164 |
| 596.3 | 0.17 |
| 596.4 | 0.169 |
| 596.5 | 0.164 |
| 596.6 | 0.153 |
| 596.7 | 0.143 |
| 596.8 | 0.131 |
| 596.9 | 0.12 |
| 597.0 | 0.112 |
| 597.1 | 0.106 |
| 597.2 | 0.103 |
| 597.3 | 0.101 |
| 597.4 | 0.102 |
| 597.5 | 0.105 |
| 597.6 | 0.107 |
| 597.7 | 0.111 |
| 597.8 | 0.116 |
| 597.9 | 0.123 |
| 598.0 | 0.132 |
| 598.1 | 0.142 |
| 598.2 | 0.155 |
| 598.3 | 0.167 |
| 598.4 | 0.181 |
| 598.5 | 0.191 |
| 598.6 | 0.198 |
| 598.7 | 0.203 |
| 598.8 | 0.206 |
| 598.9 | 0.208 |
| 599.0 | 0.205 |
| 599.1 | 0.2 |
| 599.2 | 0.196 |
| 599.3 | 0.194 |
| 599.4 | 0.191 |
| 599.5 | 0.186 |
| 599.6 | 0.183 |
| 599.7 | 0.181 |
| 599.8 | 0.179 |
| 599.9 | 0.173 |
| 600.0 | 0.167 |
| 600.1 | 0.161 |
| 600.2 | 0.155 |
| 600.3 | 0.145 |
| 600.4 | 0.136 |
| 600.5 | 0.126 |
| 600.6 | 0.118 |
| 600.7 | 0.113 |
| 600.8 | 0.109 |
| 600.9 | 0.106 |
| 601.0 | 0.105 |
| 601.1 | 0.105 |
| 601.2 | 0.109 |
| 601.3 | 0.109 |
| 601.4 | 0.108 |
| 601.5 | 0.103 |
| 601.6 | 0.094 |
| 601.7 | 0.084 |
| 601.8 | 0.073 |
| 601.9 | 0.063 |
| 602.0 | 0.057 |
| 602.1 | 0.052 |
| 602.2 | 0.05 |
| 602.3 | 0.047 |
| 602.4 | 0.047 |
| 602.5 | 0.046 |
| 602.6 | 0.046 |
| 602.7 | 0.044 |
| 602.8 | 0.043 |
| 602.9 | 0.041 |
| 603.0 | 0.042 |
| 603.1 | 0.043 |
| 603.2 | 0.043 |
| 603.3 | 0.043 |
| 603.4 | 0.042 |
| 603.5 | 0.04 |
| 603.6 | 0.04 |
| 603.7 | 0.039 |
| 603.8 | 0.041 |
| 603.9 | 0.042 |
| 604.0 | 0.044 |
| 604.1 | 0.047 |
| 604.2 | 0.052 |
| 604.3 | 0.057 |
| 604.4 | 0.064 |
| 604.5 | 0.07 |
| 604.6 | 0.078 |
| 604.7 | 0.086 |
| 604.8 | 0.094 |
| 604.9 | 0.101 |
| 605.0 | 0.105 |
| 605.1 | 0.104 |
| 605.2 | 0.1 |
| 605.3 | 0.092 |
| 605.4 | 0.085 |
| 605.5 | 0.076 |
| 605.6 | 0.068 |
| 605.7 | 0.061 |
| 605.8 | 0.055 |
| 605.9 | 0.049 |
| 606.0 | 0.045 |
| 606.1 | 0.04 |
| 606.2 | 0.036 |
| 606.3 | 0.033 |
| 606.4 | 0.031 |
| 606.5 | 0.031 |
| 606.6 | 0.029 |
| 606.7 | 0.028 |
| 606.8 | 0.028 |
| 606.9 | 0.028 |
| 607.0 | 0.026 |
| 607.1 | 0.025 |
| 607.2 | 0.024 |
| 607.3 | 0.025 |
| 607.4 | 0.026 |
| 607.5 | 0.028 |
| 607.6 | 0.028 |
| 607.7 | 0.026 |
| 607.8 | 0.024 |
| 607.9 | 0.024 |
| 608.0 | 0.025 |
| 608.1 | 0.026 |
| 608.2 | 0.026 |
| 608.3 | 0.028 |
| 608.4 | 0.029 |
| 608.5 | 0.027 |
| 608.6 | 0.026 |
| 608.7 | 0.025 |
| 608.8 | 0.025 |
| 608.9 | 0.023 |
| 609.0 | 0.021 |
| 609.1 | 0.022 |
| 609.2 | 0.023 |
| 609.3 | 0.023 |
| 609.4 | 0.024 |
| 609.5 | 0.022 |
| 609.6 | 0.023 |
| 609.7 | 0.022 |
| 609.8 | 0.025 |
| 609.9 | 0.024 |
| 610.0 | 0.025 |
| 610.1 | 0.024 |
| 610.2 | 0.024 |
| 610.3 | 0.025 |
| 610.4 | 0.025 |
| 610.5 | 0.028 |
| 610.6 | 0.027 |
| 610.7 | 0.028 |
| 610.8 | 0.029 |
| 610.9 | 0.027 |
| 611.0 | 0.026 |
| 611.1 | 0.024 |
| 611.2 | 0.024 |
| 611.3 | 0.023 |
| 611.4 | 0.021 |
| 611.5 | 0.021 |
| 611.6 | 0.019 |
| 611.7 | 0.018 |
| 611.8 | 0.017 |
| 611.9 | 0.017 |
| 612.0 | 0.017 |
| 612.1 | 0.016 |
| 612.2 | 0.016 |
| 612.3 | 0.016 |
| 612.4 | 0.017 |
| 612.5 | 0.017 |
| 612.6 | 0.017 |
| 612.7 | 0.017 |
| 612.8 | 0.017 |
| 612.9 | 0.015 |
| 613.0 | 0.015 |
| 613.1 | 0.013 |
| 613.2 | 0.014 |
| 613.3 | 0.013 |
| 613.4 | 0.014 |
| 613.5 | 0.014 |
| 613.6 | 0.016 |
| 613.7 | 0.015 |
| 613.8 | 0.015 |
| 613.9 | 0.014 |
| 614.0 | 0.014 |
| 614.1 | 0.013 |
| 614.2 | 0.012 |
| 614.3 | 0.013 |
| 614.4 | 0.011 |
| 614.5 | 0.012 |
| 614.6 | 0.013 |
| 614.7 | 0.015 |
| 614.8 | 0.016 |
| 614.9 | 0.014 |
| 615.0 | 0.012 |
| 615.1 | 0.011 |
| 615.2 | 0.01 |
| 615.3 | 0.01 |
| 615.4 | 0.011 |
| 615.5 | 0.013 |
| 615.6 | 0.012 |
| 615.7 | 0.01 |
| 615.8 | 0.01 |
| 615.9 | 0.012 |
| 616.0 | 0.013 |
| 616.1 | 0.012 |
| 616.2 | 0.009 |
| 616.3 | 0.008 |
| 616.4 | 0.01 |
| 616.5 | 0.013 |
| 616.6 | 0.014 |
| 616.7 | 0.013 |
| 616.8 | 0.012 |
| 616.9 | 0.014 |
| 617.0 | 0.015 |
| 617.1 | 0.013 |
| 617.2 | 0.013 |
| 617.3 | 0.013 |
| 617.4 | 0.016 |
| 617.5 | 0.014 |
| 617.6 | 0.013 |
| 617.7 | 0.011 |
| 617.8 | 0.012 |
| 617.9 | 0.015 |
| 618.0 | 0.017 |
| 618.1 | 0.017 |
| 618.2 | 0.017 |
| 618.3 | 0.017 |
| 618.4 | 0.02 |
| 618.5 | 0.021 |
| 618.6 | 0.021 |
| 618.7 | 0.021 |
| 618.8 | 0.019 |
| 618.9 | 0.018 |
| 619.0 | 0.016 |
| 619.1 | 0.015 |
| 619.2 | 0.015 |
| 619.3 | 0.016 |
| 619.4 | 0.016 |
| 619.5 | 0.014 |
| 619.6 | 0.013 |
| 619.7 | 0.012 |
| 619.8 | 0.014 |
| 619.9 | 0.015 |
| 620.0 | 0.018 |
| 620.1 | 0.021 |
| 620.2 | 0.024 |
| 620.3 | 0.025 |
| 620.4 | 0.026 |
| 620.5 | 0.026 |
| 620.6 | 0.028 |
| 620.7 | 0.03 |
| 620.8 | 0.03 |
| 620.9 | 0.029 |
| 621.0 | 0.029 |
| 621.1 | 0.029 |
| 621.2 | 0.032 |
| 621.3 | 0.033 |
| 621.4 | 0.034 |
| 621.5 | 0.03 |
| 621.6 | 0.026 |
| 621.7 | 0.025 |
| 621.8 | 0.021 |
| 621.9 | 0.019 |
| 622.0 | 0.016 |
| 622.1 | 0.017 |
| 622.2 | 0.015 |
| 622.3 | 0.016 |
| 622.4 | 0.017 |
| 622.5 | 0.018 |
| 622.6 | 0.016 |
| 622.7 | 0.014 |
| 622.8 | 0.013 |
| 622.9 | 0.013 |
| 623.0 | 0.015 |
| 623.1 | 0.017 |
| 623.2 | 0.017 |
| 623.3 | 0.017 |
| 623.4 | 0.016 |
| 623.5 | 0.016 |
| 623.6 | 0.017 |
| 623.7 | 0.018 |
| 623.8 | 0.018 |
| 623.9 | 0.018 |
| 624.0 | 0.017 |
| 624.1 | 0.017 |
| 624.2 | 0.017 |
| 624.3 | 0.017 |
| 624.4 | 0.019 |
| 624.5 | 0.021 |
| 624.6 | 0.025 |
| 624.7 | 0.026 |
| 624.8 | 0.028 |
| 624.9 | 0.03 |
| 625.0 | 0.037 |
| 625.1 | 0.042 |
| 625.2 | 0.049 |
| 625.3 | 0.055 |
| 625.4 | 0.063 |
| 625.5 | 0.068 |
| 625.6 | 0.072 |
| 625.7 | 0.074 |
| 625.8 | 0.075 |
| 625.9 | 0.075 |
| 626.0 | 0.071 |
| 626.1 | 0.069 |
| 626.2 | 0.067 |
| 626.3 | 0.064 |
| 626.4 | 0.061 |
| 626.5 | 0.057 |
| 626.6 | 0.054 |
| 626.7 | 0.05 |
| 626.8 | 0.047 |
| 626.9 | 0.046 |
| 627.0 | 0.043 |
| 627.1 | 0.039 |
| 627.2 | 0.036 |
| 627.3 | 0.032 |
| 627.4 | 0.029 |
| 627.5 | 0.025 |
| 627.6 | 0.024 |
| 627.7 | 0.022 |
| 627.8 | 0.021 |
| 627.9 | 0.02 |
| 628.0 | 0.019 |
| 628.1 | 0.019 |
| 628.2 | 0.021 |
| 628.3 | 0.021 |
| 628.4 | 0.021 |
| 628.5 | 0.02 |
| 628.6 | 0.022 |
| 628.7 | 0.021 |
| 628.8 | 0.022 |
| 628.9 | 0.023 |
| 629.0 | 0.026 |
| 629.1 | 0.025 |
| 629.2 | 0.026 |
| 629.3 | 0.023 |
| 629.4 | 0.024 |
| 629.5 | 0.021 |
| 629.6 | 0.022 |
| 629.7 | 0.02 |
| 629.8 | 0.02 |
| 629.9 | 0.02 |
| 630.0 | 0.023 |
| 630.1 | 0.023 |
| 630.2 | 0.025 |
| 630.3 | 0.025 |
| 630.4 | 0.024 |
| 630.5 | 0.023 |
| 630.6 | 0.022 |
| 630.7 | 0.021 |
| 630.8 | 0.018 |
| 630.9 | 0.016 |
| 631.0 | 0.019 |
| 631.1 | 0.021 |
| 631.2 | 0.024 |
| 631.3 | 0.025 |
| 631.4 | 0.026 |
| 631.5 | 0.029 |
| 631.6 | 0.033 |
| 631.7 | 0.037 |
| 631.8 | 0.04 |
| 631.9 | 0.039 |
| 632.0 | 0.037 |
| 632.1 | 0.034 |
| 632.2 | 0.034 |
| 632.3 | 0.032 |
| 632.4 | 0.03 |
| 632.5 | 0.028 |
| 632.6 | 0.027 |
| 632.7 | 0.029 |
| 632.8 | 0.029 |
| 632.9 | 0.031 |
| 633.0 | 0.03 |
| 633.1 | 0.03 |
| 633.2 | 0.029 |
| 633.3 | 0.029 |
| 633.4 | 0.027 |
| 633.5 | 0.026 |
| 633.6 | 0.026 |
| 633.7 | 0.027 |
| 633.8 | 0.028 |
| 633.9 | 0.027 |
| 634.0 | 0.028 |
| 634.1 | 0.029 |
| 634.2 | 0.031 |
| 634.3 | 0.032 |
| 634.4 | 0.034 |
| 634.5 | 0.037 |
| 634.6 | 0.041 |
| 634.7 | 0.044 |
| 634.8 | 0.045 |
| 634.9 | 0.047 |
| 635.0 | 0.047 |
| 635.1 | 0.046 |
| 635.2 | 0.041 |
| 635.3 | 0.037 |
| 635.4 | 0.033 |
| 635.5 | 0.03 |
| 635.6 | 0.029 |
| 635.7 | 0.026 |
| 635.8 | 0.022 |
| 635.9 | 0.019 |
| 636.0 | 0.017 |
| 636.1 | 0.019 |
| 636.2 | 0.016 |
| 636.3 | 0.017 |
| 636.4 | 0.016 |
| 636.5 | 0.016 |
| 636.6 | 0.016 |
| 636.7 | 0.017 |
| 636.8 | 0.018 |
| 636.9 | 0.016 |
| 637.0 | 0.016 |
| 637.1 | 0.015 |
| 637.2 | 0.015 |
| 637.3 | 0.015 |
| 637.4 | 0.015 |
| 637.5 | 0.018 |
| 637.6 | 0.017 |
| 637.7 | 0.018 |
| 637.8 | 0.018 |
| 637.9 | 0.019 |
| 638.0 | 0.02 |
| 638.1 | 0.022 |
| 638.2 | 0.023 |
| 638.3 | 0.024 |
| 638.4 | 0.024 |
| 638.5 | 0.026 |
| 638.6 | 0.025 |
| 638.7 | 0.024 |
| 638.8 | 0.02 |
| 638.9 | 0.02 |
| 639.0 | 0.019 |
| 639.1 | 0.02 |
| 639.2 | 0.021 |
| 639.3 | 0.023 |
| 639.4 | 0.024 |
| 639.5 | 0.024 |
| 639.6 | 0.023 |
| 639.7 | 0.02 |
| 639.8 | 0.019 |
| 639.9 | 0.017 |
| 640.0 | 0.017 |
| 640.1 | 0.017 |
| 640.2 | 0.019 |
| 640.3 | 0.018 |
| 640.4 | 0.018 |
| 640.5 | 0.015 |
| 640.6 | 0.017 |
| 640.7 | 0.016 |
| 640.8 | 0.018 |
| 640.9 | 0.015 |
| 641.0 | 0.015 |
| 641.1 | 0.014 |
| 641.2 | 0.014 |
| 641.3 | 0.014 |
| 641.4 | 0.01 |
| 641.5 | 0.01 |
| 641.6 | 0.009 |
| 641.7 | 0.013 |
| 641.8 | 0.014 |
| 641.9 | 0.014 |
| 642.0 | 0.014 |
| 642.1 | 0.016 |
| 642.2 | 0.015 |
| 642.3 | 0.015 |
| 642.4 | 0.014 |
| 642.5 | 0.015 |
| 642.6 | 0.016 |
| 642.7 | 0.018 |
| 642.8 | 0.019 |
| 642.9 | 0.02 |
| 643.0 | 0.019 |
| 643.1 | 0.019 |
| 643.2 | 0.017 |
| 643.3 | 0.017 |
| 643.4 | 0.017 |
| 643.5 | 0.015 |
| 643.6 | 0.013 |
| 643.7 | 0.012 |
| 643.8 | 0.014 |
| 643.9 | 0.014 |
| 644.0 | 0.014 |
| 644.1 | 0.013 |
| 644.2 | 0.014 |
| 644.3 | 0.014 |
| 644.4 | 0.015 |
| 644.5 | 0.014 |
| 644.6 | 0.013 |
| 644.7 | 0.014 |
| 644.8 | 0.015 |
| 644.9 | 0.015 |
| 645.0 | 0.013 |
| 645.1 | 0.013 |
| 645.2 | 0.013 |
| 645.3 | 0.014 |
| 645.4 | 0.015 |
| 645.5 | 0.015 |
| 645.6 | 0.014 |
| 645.7 | 0.011 |
| 645.8 | 0.009 |
| 645.9 | 0.009 |
| 646.0 | 0.01 |
| 646.1 | 0.01 |
| 646.2 | 0.01 |
| 646.3 | 0.011 |
| 646.4 | 0.013 |
| 646.5 | 0.011 |
| 646.6 | 0.012 |
| 646.7 | 0.012 |
| 646.8 | 0.013 |
| 646.9 | 0.011 |
| 647.0 | 0.011 |
| 647.1 | 0.011 |
| 647.2 | 0.013 |
| 647.3 | 0.013 |
| 647.4 | 0.014 |
| 647.5 | 0.014 |
| 647.6 | 0.013 |
| 647.7 | 0.014 |
| 647.8 | 0.012 |
| 647.9 | 0.015 |
| 648.0 | 0.013 |
| 648.1 | 0.014 |
| 648.2 | 0.013 |
| 648.3 | 0.013 |
| 648.4 | 0.013 |
| 648.5 | 0.011 |
| 648.6 | 0.011 |
| 648.7 | 0.01 |
| 648.8 | 0.012 |
| 648.9 | 0.011 |
| 649.0 | 0.011 |
| 649.1 | 0.012 |
| 649.2 | 0.012 |
| 649.3 | 0.012 |
| 649.4 | 0.012 |
| 649.5 | 0.011 |
| 649.6 | 0.012 |
| 649.7 | 0.012 |
| 649.8 | 0.014 |
| 649.9 | 0.015 |
| 650.0 | 0.015 |
| 650.1 | 0.014 |
| 650.2 | 0.013 |
| 650.3 | 0.014 |
| 650.4 | 0.015 |
| 650.5 | 0.014 |
| 650.6 | 0.013 |
| 650.7 | 0.009 |
| 650.8 | 0.01 |
| 650.9 | 0.009 |
| 651.0 | 0.01 |
| 651.1 | 0.009 |
| 651.2 | 0.009 |
| 651.3 | 0.011 |
| 651.4 | 0.013 |
| 651.5 | 0.014 |
| 651.6 | 0.013 |
| 651.7 | 0.011 |
| 651.8 | 0.01 |
| 651.9 | 0.011 |
| 652.0 | 0.012 |
| 652.1 | 0.012 |
| 652.2 | 0.014 |
| 652.3 | 0.014 |
| 652.4 | 0.013 |
| 652.5 | 0.012 |
| 652.6 | 0.011 |
| 652.7 | 0.011 |
| 652.8 | 0.01 |
| 652.9 | 0.009 |
| 653.0 | 0.011 |
| 653.1 | 0.013 |
| 653.2 | 0.014 |
| 653.3 | 0.013 |
| 653.4 | 0.011 |
| 653.5 | 0.008 |
| 653.6 | 0.008 |
| 653.7 | 0.007 |
| 653.8 | 0.009 |
| 653.9 | 0.006 |
| 654.0 | 0.006 |
| 654.1 | 0.006 |
| 654.2 | 0.007 |
| 654.3 | 0.007 |
| 654.4 | 0.005 |
| 654.5 | 0.004 |
| 654.6 | 0.006 |
| 654.7 | 0.006 |
| 654.8 | 0.005 |
| 654.9 | 0.005 |
| 655.0 | 0.005 |
| 655.1 | 0.005 |
| 655.2 | 0.006 |
| 655.3 | 0.008 |
| 655.4 | 0.008 |
| 655.5 | 0.008 |
| 655.6 | 0.006 |
| 655.7 | 0.007 |
| 655.8 | 0.005 |
| 655.9 | 0.004 |
| 656.0 | 0.004 |
| 656.1 | 0.004 |
| 656.2 | 0.005 |
| 656.3 | 0.005 |
| 656.4 | 0.007 |
| 656.5 | 0.007 |
| 656.6 | 0.006 |
| 656.7 | 0.005 |
| 656.8 | 0.004 |
| 656.9 | 0.004 |
| 657.0 | 0.003 |
| 657.1 | 0.002 |
| 657.2 | 0.003 |
| 657.3 | 0.001 |
| 657.4 | 0.004 |
| 657.5 | 0.001 |
| 657.6 | 0.004 |
| 657.7 | 0.002 |
| 657.8 | 0 |
| 657.9 | 0.001 |
| 658.0 | 0.001 |
| 658.1 | 0.002 |
| 658.2 | 0.002 |
| 658.3 | 0.001 |
| 658.4 | 0.001 |
| 658.5 | 0.001 |
| 658.6 | 0.001 |
| 658.7 | 0.001 |
| 658.8 | 0.001 |
| 658.9 | 0.002 |
| 659.0 | 0.001 |
| 659.1 | 0.004 |
| 659.2 | 0.001 |
| 659.3 | 0 |
| 659.4 | 0.001 |
| 659.5 | 0.007 |
| 659.6 | 0.001 |
| 659.7 | 0.001 |
| 659.8 | 0.002 |
| 659.9 | 0 |
| 660.0 | 0.002 |
| 660.1 | 0.002 |
| 660.2 | 0.001 |
| 660.3 | 0.001 |
| 660.4 | 0.001 |
| 660.5 | 0.001 |
| 660.6 | 0 |
| 660.7 | 0 |
| 660.8 | 0 |
| 660.9 | 0.001 |
| 661.0 | 0.001 |
| 661.1 | 0.002 |
| 661.2 | 0.002 |
| 661.3 | 0.001 |
| 661.4 | 0.002 |
| 661.5 | 0.002 |
| 661.6 | 0.002 |
| 661.7 | 0.003 |
| 661.8 | 0.003 |
| 661.9 | 0.003 |
| 662.0 | 0.003 |
| 662.1 | 0 |
| 662.2 | 0.002 |
| 662.3 | 0.001 |
| 662.4 | 0.004 |
| 662.5 | 0.002 |
| 662.6 | 0.003 |
| 662.7 | 0.001 |
| 662.8 | 0.001 |
| 662.9 | 0.001 |
| 663.0 | 0.001 |
| 663.1 | 0.001 |
| 663.2 | 0.001 |
| 663.3 | 0.002 |
| 663.4 | 0.003 |
| 663.5 | 0.004 |
| 663.6 | 0.004 |
| 663.7 | 0.001 |
| 663.8 | 0.001 |
| 663.9 | 0.001 |
| 664.0 | 0.003 |
| 664.1 | 0.003 |
| 664.2 | 0.003 |
| 664.3 | 0.003 |
| 664.4 | 0.003 |
| 664.5 | 0.004 |
| 664.6 | 0.006 |
| 664.7 | 0.006 |
| 664.8 | 0.004 |
| 664.9 | 0.002 |
| 665.0 | 0.002 |
| 665.1 | 0.001 |
| 665.2 | 0.004 |
| 665.3 | 0.006 |
| 665.4 | 0.006 |
| 665.5 | 0.006 |
| 665.6 | 0.006 |
| 665.7 | 0.005 |
| 665.8 | 0.005 |
| 665.9 | 0.004 |
| 666.0 | 0.006 |
| 666.1 | 0.005 |
| 666.2 | 0.006 |
| 666.3 | 0.004 |
| 666.4 | 0.005 |
| 666.5 | 0.004 |
| 666.6 | 0.007 |
| 666.7 | 0.008 |
| 666.8 | 0.009 |
| 666.9 | 0.008 |
| 667.0 | 0.006 |
| 667.1 | 0.007 |
| 667.2 | 0.006 |
| 667.3 | 0.007 |
| 667.4 | 0.006 |
| 667.5 | 0.008 |
| 667.6 | 0.008 |
| 667.7 | 0.01 |
| 667.8 | 0.011 |
| 667.9 | 0.012 |
| 668.0 | 0.011 |
| 668.1 | 0.011 |
| 668.2 | 0.012 |
| 668.3 | 0.013 |
| 668.4 | 0.012 |
| 668.5 | 0.013 |
| 668.6 | 0.013 |
| 668.7 | 0.015 |
| 668.8 | 0.015 |
| 668.9 | 0.017 |
| 669.0 | 0.017 |
| 669.1 | 0.018 |
| 669.2 | 0.019 |
| 669.3 | 0.021 |
| 669.4 | 0.022 |
| 669.5 | 0.024 |
| 669.6 | 0.026 |
| 669.7 | 0.028 |
| 669.8 | 0.031 |
| 669.9 | 0.036 |
| 670.0 | 0.038 |
| 670.1 | 0.039 |
| 670.2 | 0.043 |
| 670.3 | 0.045 |
| 670.4 | 0.05 |
| 670.5 | 0.051 |
| 670.6 | 0.055 |
| 670.7 | 0.055 |
| 670.8 | 0.056 |
| 670.9 | 0.054 |
| 671.0 | 0.052 |
| 671.1 | 0.048 |
| 671.2 | 0.044 |
| 671.3 | 0.04 |
| 671.4 | 0.036 |
| 671.5 | 0.035 |
| 671.6 | 0.034 |
| 671.7 | 0.032 |
| 671.8 | 0.032 |
| 671.9 | 0.03 |
| 672.0 | 0.028 |
| 672.1 | 0.025 |
| 672.2 | 0.024 |
| 672.3 | 0.023 |
| 672.4 | 0.022 |
| 672.5 | 0.022 |
| 672.6 | 0.024 |
| 672.7 | 0.023 |
| 672.8 | 0.025 |
| 672.9 | 0.027 |
| 673.0 | 0.027 |
| 673.1 | 0.027 |
| 673.2 | 0.026 |
| 673.3 | 0.027 |
| 673.4 | 0.028 |
| 673.5 | 0.03 |
| 673.6 | 0.032 |
| 673.7 | 0.032 |
| 673.8 | 0.036 |
| 673.9 | 0.04 |
| 674.0 | 0.046 |
| 674.1 | 0.049 |
| 674.2 | 0.053 |
| 674.3 | 0.06 |
| 674.4 | 0.069 |
| 674.5 | 0.079 |
| 674.6 | 0.088 |
| 674.7 | 0.097 |
| 674.8 | 0.109 |
| 674.9 | 0.124 |
| 675.0 | 0.14 |
| 675.1 | 0.157 |
| 675.2 | 0.178 |
| 675.3 | 0.202 |
| 675.4 | 0.225 |
| 675.5 | 0.241 |
| 675.6 | 0.249 |
| 675.7 | 0.251 |
| 675.8 | 0.248 |
| 675.9 | 0.244 |
| 676.0 | 0.237 |
| 676.1 | 0.232 |
| 676.2 | 0.225 |
| 676.3 | 0.214 |
| 676.4 | 0.202 |
| 676.5 | 0.192 |
| 676.6 | 0.182 |
| 676.7 | 0.174 |
| 676.8 | 0.163 |
| 676.9 | 0.152 |
| 677.0 | 0.137 |
| 677.1 | 0.122 |
| 677.2 | 0.108 |
| 677.3 | 0.093 |
| 677.4 | 0.081 |
| 677.5 | 0.069 |
| 677.6 | 0.062 |
| 677.7 | 0.055 |
| 677.8 | 0.049 |
| 677.9 | 0.044 |
| 678.0 | 0.042 |
| 678.1 | 0.043 |
| 678.2 | 0.042 |
| 678.3 | 0.04 |
| 678.4 | 0.038 |
| 678.5 | 0.039 |
| 678.6 | 0.041 |
| 678.7 | 0.043 |
| 678.8 | 0.043 |
| 678.9 | 0.047 |
| 679.0 | 0.05 |
| 679.1 | 0.053 |
| 679.2 | 0.058 |
| 679.3 | 0.065 |
| 679.4 | 0.075 |
| 679.5 | 0.082 |
| 679.6 | 0.091 |
| 679.7 | 0.102 |
| 679.8 | 0.113 |
| 679.9 | 0.123 |
| 680.0 | 0.129 |
| 680.1 | 0.133 |
| 680.2 | 0.135 |
| 680.3 | 0.135 |
| 680.4 | 0.135 |
| 680.5 | 0.134 |
| 680.6 | 0.134 |
| 680.7 | 0.138 |
| 680.8 | 0.146 |
| 680.9 | 0.159 |
| 681.0 | 0.171 |
| 681.1 | 0.182 |
| 681.2 | 0.188 |
| 681.3 | 0.186 |
| 681.4 | 0.174 |
| 681.5 | 0.154 |
| 681.6 | 0.13 |
| 681.7 | 0.112 |
| 681.8 | 0.095 |
| 681.9 | 0.088 |
| 682.0 | 0.083 |
| 682.1 | 0.086 |
| 682.2 | 0.09 |
| 682.3 | 0.102 |
| 682.4 | 0.12 |
| 682.5 | 0.147 |
| 682.6 | 0.176 |
| 682.7 | 0.204 |
| 682.8 | 0.225 |
| 682.9 | 0.237 |
| 683.0 | 0.239 |
| 683.1 | 0.229 |
| 683.2 | 0.208 |
| 683.3 | 0.181 |
| 683.4 | 0.155 |
| 683.5 | 0.134 |
| 683.6 | 0.117 |
| 683.7 | 0.103 |
| 683.8 | 0.092 |
| 683.9 | 0.083 |
| 684.0 | 0.078 |
| 684.1 | 0.071 |
| 684.2 | 0.067 |
| 684.3 | 0.063 |
| 684.4 | 0.06 |
| 684.5 | 0.058 |
| 684.6 | 0.053 |
| 684.7 | 0.05 |
| 684.8 | 0.046 |
| 684.9 | 0.042 |
| 685.0 | 0.039 |
| 685.1 | 0.038 |
| 685.2 | 0.036 |
| 685.3 | 0.032 |
| 685.4 | 0.029 |
| 685.5 | 0.028 |
| 685.6 | 0.028 |
| 685.7 | 0.028 |
| 685.8 | 0.028 |
| 685.9 | 0.03 |
| 686.0 | 0.032 |
| 686.1 | 0.033 |
| 686.2 | 0.035 |
| 686.3 | 0.034 |
| 686.4 | 0.034 |
| 686.5 | 0.036 |
| 686.6 | 0.037 |
| 686.7 | 0.039 |
| 686.8 | 0.038 |
| 686.9 | 0.039 |
| 687.0 | 0.04 |
| 687.1 | 0.04 |
| 687.2 | 0.038 |
| 687.3 | 0.032 |
| 687.4 | 0.031 |
| 687.5 | 0.031 |
| 687.6 | 0.034 |
| 687.7 | 0.033 |
| 687.8 | 0.031 |
| 687.9 | 0.033 |
| 688.0 | 0.036 |
| 688.1 | 0.041 |
| 688.2 | 0.04 |
| 688.3 | 0.04 |
| 688.4 | 0.04 |
| 688.5 | 0.042 |
| 688.6 | 0.04 |
| 688.7 | 0.041 |
| 688.8 | 0.041 |
| 688.9 | 0.046 |
| 689.0 | 0.043 |
| 689.1 | 0.043 |
| 689.2 | 0.039 |
| 689.3 | 0.042 |
| 689.4 | 0.043 |
| 689.5 | 0.046 |
| 689.6 | 0.049 |
| 689.7 | 0.05 |
| 689.8 | 0.05 |
| 689.9 | 0.054 |
| 690.0 | 0.061 |
| 690.1 | 0.065 |
| 690.2 | 0.068 |
| 690.3 | 0.065 |
| 690.4 | 0.063 |
| 690.5 | 0.057 |
| 690.6 | 0.05 |
| 690.7 | 0.044 |
| 690.8 | 0.036 |
| 690.9 | 0.03 |
| 691.0 | 0.027 |
| 691.1 | 0.025 |
| 691.2 | 0.025 |
| 691.3 | 0.023 |
| 691.4 | 0.025 |
| 691.5 | 0.026 |
| 691.6 | 0.028 |
| 691.7 | 0.03 |
| 691.8 | 0.034 |
| 691.9 | 0.035 |
| 692.0 | 0.034 |
| 692.1 | 0.032 |
| 692.2 | 0.031 |
| 692.3 | 0.029 |
| 692.4 | 0.027 |
| 692.5 | 0.025 |
| 692.6 | 0.023 |
| 692.7 | 0.02 |
| 692.8 | 0.018 |
| 692.9 | 0.015 |
| 693.0 | 0.016 |
| 693.1 | 0.014 |
| 693.2 | 0.015 |
| 693.3 | 0.014 |
| 693.4 | 0.013 |
| 693.5 | 0.013 |
| 693.6 | 0.013 |
| 693.7 | 0.013 |
| 693.8 | 0.013 |
| 693.9 | 0.014 |
| 694.0 | 0.012 |
| 694.1 | 0.011 |
| 694.2 | 0.013 |
| 694.3 | 0.018 |
| 694.4 | 0.018 |
| 694.5 | 0.019 |
| 694.6 | 0.022 |
| 694.7 | 0.027 |
| 694.8 | 0.032 |
| 694.9 | 0.035 |
| 695.0 | 0.034 |
| 695.1 | 0.035 |
| 695.2 | 0.036 |
| 695.3 | 0.038 |
| 695.4 | 0.036 |
| 695.5 | 0.031 |
| 695.6 | 0.028 |
| 695.7 | 0.026 |
| 695.8 | 0.026 |
| 695.9 | 0.026 |
| 696.0 | 0.023 |
| 696.1 | 0.021 |
| 696.2 | 0.019 |
| 696.3 | 0.019 |
| 696.4 | 0.019 |
| 696.5 | 0.02 |
| 696.6 | 0.019 |
| 696.7 | 0.02 |
| 696.8 | 0.02 |
| 696.9 | 0.023 |
| 697.0 | 0.023 |
| 697.1 | 0.023 |
| 697.2 | 0.02 |
| 697.3 | 0.017 |
| 697.4 | 0.016 |
| 697.5 | 0.017 |
| 697.6 | 0.016 |
| 697.7 | 0.015 |
| 697.8 | 0.011 |
| 697.9 | 0.012 |
| 698.0 | 0.013 |
| 698.1 | 0.016 |
| 698.2 | 0.012 |
| 698.3 | 0.01 |
| 698.4 | 0.006 |
| 698.5 | 0.009 |
| 698.6 | 0.005 |
| 698.7 | 0.007 |
| 698.8 | 0.009 |
| 698.9 | 0.012 |
| 699.0 | 0.015 |
| 699.1 | 0.013 |
| 699.2 | 0.011 |
| 699.3 | 0.009 |
| 699.4 | 0.008 |
| 699.5 | 0.008 |
| 699.6 | 0.005 |
| 699.7 | 0.005 |
| 699.8 | 0.006 |
| 699.9 | 0.007 |
| 700.0 | 0.008 |
| 700.1 | 0.005 |
| 700.2 | 0.002 |
| 700.3 | 0 |
| 700.4 | 0.001 |
| 700.5 | 0.004 |
| 700.6 | 0.005 |
| 700.7 | 0.007 |
| 700.8 | 0.004 |
| 700.9 | 0.003 |
| 701.0 | 0.003 |
| 701.1 | 0.004 |
| 701.2 | 0.003 |
| 701.3 | 0.003 |
| 701.4 | 0.004 |
| 701.5 | 0.004 |
| 701.6 | 0.005 |
| 701.7 | 0.007 |
| 701.8 | 0.01 |
| 701.9 | 0.009 |
| 702.0 | 0.007 |
| 702.1 | 0.005 |
| 702.2 | 0.005 |
| 702.3 | 0.005 |
| 702.4 | 0.004 |
| 702.5 | 0.005 |
| 702.6 | 0.005 |
| 702.7 | 0.007 |
| 702.8 | 0.005 |
| 702.9 | 0.004 |
| 703.0 | 0.001 |
| 703.1 | 0 |
| 703.2 | 0.001 |
| 703.3 | 0 |
| 703.4 | 0.001 |
| 703.5 | 0.003 |
| 703.6 | 0.004 |
| 703.7 | 0.007 |
| 703.8 | 0.006 |
| 703.9 | 0.005 |
| 704.0 | 0.002 |
| 704.1 | 0.001 |
| 704.2 | 0.002 |
| 704.3 | 0.003 |
| 704.4 | 0 |
| 704.5 | 0.004 |
| 704.6 | 0 |
| 704.7 | 0.002 |
| 704.8 | 0.002 |
| 704.9 | 0 |
| 705.0 | 0.001 |
| 705.1 | 0.002 |
| 705.2 | 0.005 |
| 705.3 | 0.004 |
| 705.4 | 0.001 |
| 705.5 | 0.002 |
| 705.6 | 0.002 |
| 705.7 | 0.004 |
| 705.8 | 0.002 |
| 705.9 | 0.002 |
| 706.0 | 0.002 |
| 706.1 | 0.002 |
| 706.2 | 0.004 |
| 706.3 | 0.007 |
| 706.4 | 0.003 |
| 706.5 | 0.002 |
| 706.6 | 0.002 |
| 706.7 | 0 |
| 706.8 | 0.002 |
| 706.9 | 0.001 |
| 707.0 | 0.002 |
| 707.1 | 0.005 |
| 707.2 | 0.006 |
| 707.3 | 0.005 |
| 707.4 | 0.002 |
| 707.5 | 0.001 |
| 707.6 | 0.001 |
| 707.7 | 0.002 |
| 707.8 | 0.005 |
| 707.9 | 0.001 |
| 708.0 | 0.004 |
| 708.1 | 0.003 |
| 708.2 | 0 |
| 708.3 | 0.001 |
| 708.4 | 0.002 |
| 708.5 | 0.003 |
| 708.6 | 0.002 |
| 708.7 | 0.003 |
| 708.8 | 0.001 |
| 708.9 | 0.002 |
| 709.0 | 0.003 |
| 709.1 | 0.005 |
| 709.2 | 0.003 |
| 709.3 | 0.001 |
| 709.4 | 0.005 |
| 709.5 | 0.003 |
| 709.6 | 0.001 |
| 709.7 | 0.003 |
| 709.8 | 0.004 |
| 709.9 | 0.003 |
| 710.0 | 0.001 |
| 710.1 | 0.005 |
| 710.2 | 0.003 |
| 710.3 | 0.001 |
| 710.4 | 0.005 |
| 710.5 | 0.003 |
| 710.6 | 0.001 |
| 710.7 | 0.005 |
| 710.8 | 0.003 |
| 710.9 | 0.001 |
| 711.0 | 0.005 |
| 711.1 | 0.003 |
| 711.2 | 0.001 |
| 711.3 | 0.001 |
| 711.4 | 0.001 |
| 711.5 | 0.005 |
| 711.6 | 0.003 |
| 711.7 | 0.001 |
| 711.8 | 0.001 |
| 711.9 | 0.001 |
| 712.0 | 0.001 |
| 712.1 | 0.001 |
| 712.2 | 0.001 |
| 712.3 | 0.001 |
| 712.4 | 0 |
| 712.5 | 0 |
| 712.6 | 0 |
| 712.7 | 0.001 |
| 712.8 | 0.002 |
| 712.9 | 0.002 |
| 713.0 | 0 |
| 713.1 | 0 |
| 713.2 | 0.001 |
| 713.3 | 0.002 |
| 713.4 | 0.001 |
| 713.5 | 0.002 |
| 713.6 | 0.001 |
| 713.7 | 0.002 |
| 713.8 | 0.002 |
| 713.9 | 0.002 |
| 714.0 | 0.001 |
| 714.1 | 0.005 |
| 714.2 | 0 |
| 714.3 | 0.004 |
| 714.4 | 0.001 |
| 714.5 | 0 |
| 714.6 | 0.001 |
| 714.7 | 0.003 |
| 714.8 | 0.005 |
| 714.9 | 0.001 |
| 715.0 | 0.001 |
| 715.1 | 0.003 |
| 715.2 | 0.001 |
| 715.3 | 0 |
| 715.4 | 0.001 |
| 715.5 | 0.002 |
| 715.6 | 0.003 |
| 715.7 | 0.001 |
| 715.8 | 0 |
| 715.9 | 0.003 |
| 716.0 | 0.004 |
| 716.1 | 0.004 |
| 716.2 | 0.004 |
| 716.3 | 0.003 |
| 716.4 | 0.005 |
| 716.5 | 0.003 |
| 716.6 | 0.004 |
| 716.7 | 0.003 |
| 716.8 | 0.005 |
| 716.9 | 0.004 |
| 717.0 | 0.003 |
| 717.1 | 0.004 |
| 717.2 | 0.008 |
| 717.3 | 0.009 |
| 717.4 | 0.009 |
| 717.5 | 0.007 |
| 717.6 | 0.005 |
| 717.7 | 0.002 |
| 717.8 | 0.002 |
| 717.9 | 0.003 |
| 718.0 | 0.006 |
| 718.1 | 0.004 |
| 718.2 | 0.003 |
| 718.3 | 0.005 |
| 718.4 | 0.006 |
| 718.5 | 0.01 |
| 718.6 | 0.005 |
| 718.7 | 0.007 |
| 718.8 | 0.005 |
| 718.9 | 0.006 |
| 719.0 | 0.005 |
| 719.1 | 0.004 |
| 719.2 | 0.006 |
| 719.3 | 0.008 |
| 719.4 | 0.009 |
| 719.5 | 0.005 |
| 719.6 | 0.006 |
| 719.7 | 0.005 |
| 719.8 | 0.01 |
| 719.9 | 0.008 |
| 720.0 | 0.006 |
| 720.1 | 0.005 |
| 720.2 | 0.006 |
| 720.3 | 0.008 |
| 720.4 | 0.008 |
| 720.5 | 0.009 |
| 720.6 | 0.01 |
| 720.7 | 0.012 |
| 720.8 | 0.01 |
| 720.9 | 0.013 |
| 721.0 | 0.012 |
| 721.1 | 0.014 |
| 721.2 | 0.014 |
| 721.3 | 0.014 |
| 721.4 | 0.013 |
| 721.5 | 0.013 |
| 721.6 | 0.012 |
| 721.7 | 0.011 |
| 721.8 | 0.01 |
| 721.9 | 0.01 |
| 722.0 | 0.014 |
| 722.1 | 0.015 |
| 722.2 | 0.017 |
| 722.3 | 0.016 |
| 722.4 | 0.016 |
| 722.5 | 0.015 |
| 722.6 | 0.014 |
| 722.7 | 0.014 |
| 722.8 | 0.016 |
| 722.9 | 0.02 |
| 723.0 | 0.02 |
| 723.1 | 0.021 |
| 723.2 | 0.019 |
| 723.3 | 0.021 |
| 723.4 | 0.021 |
| 723.5 | 0.021 |
| 723.6 | 0.02 |
| 723.7 | 0.019 |
| 723.8 | 0.016 |
| 723.9 | 0.014 |
| 724.0 | 0.013 |
| 724.1 | 0.014 |
| 724.2 | 0.017 |
| 724.3 | 0.018 |
| 724.4 | 0.02 |
| 724.5 | 0.019 |
| 724.6 | 0.02 |
| 724.7 | 0.018 |
| 724.8 | 0.021 |
| 724.9 | 0.022 |
| 725.0 | 0.025 |
| 725.1 | 0.018 |
| 725.2 | 0.019 |
| 725.3 | 0.015 |
| 725.4 | 0.018 |
| 725.5 | 0.021 |
| 725.6 | 0.027 |
| 725.7 | 0.026 |
| 725.8 | 0.023 |
| 725.9 | 0.026 |
| 726.0 | 0.028 |
| 726.1 | 0.031 |
| 726.2 | 0.029 |
| 726.3 | 0.027 |
| 726.4 | 0.026 |
| 726.5 | 0.026 |
| 726.6 | 0.03 |
| 726.7 | 0.03 |
| 726.8 | 0.03 |
| 726.9 | 0.029 |
| 727.0 | 0.032 |
| 727.1 | 0.034 |
| 727.2 | 0.036 |
| 727.3 | 0.034 |
| 727.4 | 0.035 |
| 727.5 | 0.035 |
| 727.6 | 0.038 |
| 727.7 | 0.035 |
| 727.8 | 0.036 |
| 727.9 | 0.035 |
| 728.0 | 0.039 |
| 728.1 | 0.038 |
| 728.2 | 0.042 |
| 728.3 | 0.044 |
| 728.4 | 0.046 |
| 728.5 | 0.045 |
| 728.6 | 0.045 |
| 728.7 | 0.046 |
| 728.8 | 0.051 |
| 728.9 | 0.055 |
| 729.0 | 0.058 |
| 729.1 | 0.06 |
| 729.2 | 0.063 |
| 729.3 | 0.069 |
| 729.4 | 0.075 |
| 729.5 | 0.077 |
| 729.6 | 0.078 |
| 729.7 | 0.081 |
| 729.8 | 0.085 |
| 729.9 | 0.09 |
| 730.0 | 0.092 |
| 730.1 | 0.097 |
| 730.2 | 0.098 |
| 730.3 | 0.102 |
| 730.4 | 0.103 |
| 730.5 | 0.108 |
| 730.6 | 0.11 |
| 730.7 | 0.117 |
| 730.8 | 0.124 |
| 730.9 | 0.129 |
| 731.0 | 0.132 |
| 731.1 | 0.135 |
| 731.2 | 0.146 |
| 731.3 | 0.158 |
| 731.4 | 0.169 |
| 731.5 | 0.179 |
| 731.6 | 0.19 |
| 731.7 | 0.209 |
| 731.8 | 0.233 |
| 731.9 | 0.26 |
| 732.0 | 0.292 |
| 732.1 | 0.333 |
| 732.2 | 0.382 |
| 732.3 | 0.441 |
| 732.4 | 0.498 |
| 732.5 | 0.568 |
| 732.6 | 0.642 |
| 732.7 | 0.726 |
| 732.8 | 0.804 |
| 732.9 | 0.871 |
| 733.0 | 0.928 |
| 733.1 | 0.959 |
| 733.2 | 0.966 |
| 733.3 | 0.94 |
| 733.4 | 0.901 |
| 733.5 | 0.843 |
| 733.6 | 0.778 |
| 733.7 | 0.706 |
| 733.8 | 0.643 |
| 733.9 | 0.586 |
| 734.0 | 0.537 |
| 734.1 | 0.494 |
| 734.2 | 0.465 |
| 734.3 | 0.449 |
| 734.4 | 0.452 |
| 734.5 | 0.468 |
| 734.6 | 0.498 |
| 734.7 | 0.536 |
| 734.8 | 0.576 |
| 734.9 | 0.618 |
| 735.0 | 0.65 |
| 735.1 | 0.677 |
| 735.2 | 0.687 |
| 735.3 | 0.685 |
| 735.4 | 0.678 |
| 735.5 | 0.671 |
| 735.6 | 0.675 |
| 735.7 | 0.697 |
| 735.8 | 0.747 |
| 735.9 | 0.827 |
| 736.0 | 0.931 |
| 736.1 | 1.036 |
| 736.2 | 1.127 |
| 736.3 | 1.181 |
| 736.4 | 1.199 |
| 736.5 | 1.175 |
| 736.6 | 1.12 |
| 736.7 | 1.037 |
| 736.8 | 0.941 |
| 736.9 | 0.829 |
| 737.0 | 0.715 |
| 737.1 | 0.604 |
| 737.2 | 0.511 |
| 737.3 | 0.437 |
| 737.4 | 0.375 |
| 737.5 | 0.324 |
| 737.6 | 0.28 |
| 737.7 | 0.249 |
| 737.8 | 0.224 |
| 737.9 | 0.206 |
| 738.0 | 0.188 |
| 738.1 | 0.177 |
| 738.2 | 0.17 |
| 738.3 | 0.167 |
| 738.4 | 0.167 |
| 738.5 | 0.167 |
| 738.6 | 0.169 |
| 738.7 | 0.173 |
| 738.8 | 0.179 |
| 738.9 | 0.19 |
| 739.0 | 0.201 |
| 739.1 | 0.216 |
| 739.2 | 0.231 |
| 739.3 | 0.245 |
| 739.4 | 0.257 |
| 739.5 | 0.269 |
| 739.6 | 0.278 |
| 739.7 | 0.287 |
| 739.8 | 0.29 |
| 739.9 | 0.293 |
| 740.0 | 0.29 |
| 740.1 | 0.285 |
| 740.2 | 0.281 |
| 740.3 | 0.278 |
| 740.4 | 0.277 |
| 740.5 | 0.274 |
| 740.6 | 0.273 |
| 740.7 | 0.274 |
| 740.8 | 0.283 |
| 740.9 | 0.292 |
| 741.0 | 0.306 |
| 741.1 | 0.32 |
| 741.2 | 0.338 |
| 741.3 | 0.357 |
| 741.4 | 0.374 |
| 741.5 | 0.39 |
| 741.6 | 0.403 |
| 741.7 | 0.416 |
| 741.8 | 0.43 |
| 741.9 | 0.445 |
| 742.0 | 0.459 |
| 742.1 | 0.48 |
| 742.2 | 0.504 |
| 742.3 | 0.54 |
| 742.4 | 0.58 |
| 742.5 | 0.629 |
| 742.6 | 0.679 |
| 742.7 | 0.731 |
| 742.8 | 0.783 |
| 742.9 | 0.835 |
| 743.0 | 0.882 |
| 743.1 | 0.921 |
| 743.2 | 0.946 |
| 743.3 | 0.959 |
| 743.4 | 0.963 |
| 743.5 | 0.961 |
| 743.6 | 0.949 |
| 743.7 | 0.933 |
| 743.8 | 0.913 |
| 743.9 | 0.887 |
| 744.0 | 0.854 |
| 744.1 | 0.813 |
| 744.2 | 0.762 |
| 744.3 | 0.707 |
| 744.4 | 0.646 |
| 744.5 | 0.589 |
| 744.6 | 0.537 |
| 744.7 | 0.49 |
| 744.8 | 0.448 |
| 744.9 | 0.409 |
| 745.0 | 0.378 |
| 745.1 | 0.359 |
| 745.2 | 0.347 |
| 745.3 | 0.344 |
| 745.4 | 0.347 |
| 745.5 | 0.352 |
| 745.6 | 0.363 |
| 745.7 | 0.378 |
| 745.8 | 0.397 |
| 745.9 | 0.416 |
| 746.0 | 0.433 |
| 746.1 | 0.457 |
| 746.2 | 0.477 |
| 746.3 | 0.509 |
| 746.4 | 0.537 |
| 746.5 | 0.58 |
| 746.6 | 0.628 |
| 746.7 | 0.693 |
| 746.8 | 0.762 |
| 746.9 | 0.843 |
| 747.0 | 0.935 |
| 747.1 | 1.036 |
| 747.2 | 1.14 |
| 747.3 | 1.231 |
| 747.4 | 1.318 |
| 747.5 | 1.385 |
| 747.6 | 1.437 |
| 747.7 | 1.465 |
| 747.8 | 1.472 |
| 747.9 | 1.456 |
| 748.0 | 1.414 |
| 748.1 | 1.352 |
| 748.2 | 1.275 |
| 748.3 | 1.188 |
| 748.4 | 1.089 |
| 748.5 | 0.987 |
| 748.6 | 0.887 |
| 748.7 | 0.789 |
| 748.8 | 0.693 |
| 748.9 | 0.608 |
| 749.0 | 0.542 |
| 749.1 | 0.491 |
| 749.2 | 0.448 |
| 749.3 | 0.413 |
| 749.4 | 0.387 |
| 749.5 | 0.363 |
| 749.6 | 0.344 |
| 749.7 | 0.329 |
| 749.8 | 0.323 |
| 749.9 | 0.32 |
| 750.0 | 0.322 |
| 750.1 | 0.323 |
| 750.2 | 0.332 |
| 750.3 | 0.339 |
| 750.4 | 0.357 |
| 750.5 | 0.376 |
| 750.6 | 0.398 |
| 750.7 | 0.424 |
| 750.8 | 0.446 |
| 750.9 | 0.475 |
| 751.0 | 0.497 |
| 751.1 | 0.522 |
| 751.2 | 0.54 |
| 751.3 | 0.559 |
| 751.4 | 0.58 |
| 751.5 | 0.597 |
| 751.6 | 0.61 |
| 751.7 | 0.617 |
| 751.8 | 0.626 |
| 751.9 | 0.627 |
| 752.0 | 0.624 |
| 752.1 | 0.614 |
| 752.2 | 0.603 |
| 752.3 | 0.592 |
| 752.4 | 0.585 |
| 752.5 | 0.585 |
| 752.6 | 0.591 |
| 752.7 | 0.598 |
| 752.8 | 0.611 |
| 752.9 | 0.628 |
| 753.0 | 0.653 |
| 753.1 | 0.675 |
| 753.2 | 0.692 |
| 753.3 | 0.704 |
| 753.4 | 0.708 |
| 753.5 | 0.706 |
| 753.6 | 0.694 |
| 753.7 | 0.677 |
| 753.8 | 0.658 |
| 753.9 | 0.644 |
| 754.0 | 0.626 |
| 754.1 | 0.612 |
| 754.2 | 0.598 |
| 754.3 | 0.593 |
| 754.4 | 0.589 |
| 754.5 | 0.59 |
| 754.6 | 0.592 |
| 754.7 | 0.597 |
| 754.8 | 0.608 |
| 754.9 | 0.621 |
| 755.0 | 0.631 |
| 755.1 | 0.636 |
| 755.2 | 0.639 |
| 755.3 | 0.637 |
| 755.4 | 0.624 |
| 755.5 | 0.601 |
| 755.6 | 0.562 |
| 755.7 | 0.512 |
| 755.8 | 0.455 |
| 755.9 | 0.406 |
| 756.0 | 0.365 |
| 756.1 | 0.33 |
| 756.2 | 0.3 |
| 756.3 | 0.274 |
| 756.4 | 0.251 |
| 756.5 | 0.233 |
| 756.6 | 0.222 |
| 756.7 | 0.217 |
| 756.8 | 0.216 |
| 756.9 | 0.216 |
| 757.0 | 0.22 |
| 757.1 | 0.225 |
| 757.2 | 0.231 |
| 757.3 | 0.241 |
| 757.4 | 0.253 |
| 757.5 | 0.274 |
| 757.6 | 0.293 |
| 757.7 | 0.32 |
| 757.8 | 0.346 |
| 757.9 | 0.382 |
| 758.0 | 0.417 |
| 758.1 | 0.46 |
| 758.2 | 0.505 |
| 758.3 | 0.559 |
| 758.4 | 0.616 |
| 758.5 | 0.675 |
| 758.6 | 0.73 |
| 758.7 | 0.772 |
| 758.8 | 0.803 |
| 758.9 | 0.817 |
| 759.0 | 0.815 |
| 759.1 | 0.794 |
| 759.2 | 0.759 |
| 759.3 | 0.71 |
| 759.4 | 0.651 |
| 759.5 | 0.59 |
| 759.6 | 0.536 |
| 759.7 | 0.484 |
| 759.8 | 0.439 |
| 759.9 | 0.393 |
| 760.0 | 0.362 |
| 760.1 | 0.327 |
| 760.2 | 0.3 |
| 760.3 | 0.277 |
| 760.4 | 0.263 |
| 760.5 | 0.254 |
| 760.6 | 0.246 |
| 760.7 | 0.245 |
| 760.8 | 0.245 |
| 760.9 | 0.248 |
| 761.0 | 0.249 |
| 761.1 | 0.255 |
| 761.2 | 0.26 |
| 761.3 | 0.264 |
| 761.4 | 0.265 |
| 761.5 | 0.264 |
| 761.6 | 0.262 |
| 761.7 | 0.256 |
| 761.8 | 0.246 |
| 761.9 | 0.232 |
| 762.0 | 0.222 |
| 762.1 | 0.211 |
| 762.2 | 0.205 |
| 762.3 | 0.198 |
| 762.4 | 0.188 |
| 762.5 | 0.172 |
| 762.6 | 0.159 |
| 762.7 | 0.151 |
| 762.8 | 0.145 |
| 762.9 | 0.136 |
| 763.0 | 0.127 |
| 763.1 | 0.122 |
| 763.2 | 0.115 |
| 763.3 | 0.114 |
| 763.4 | 0.111 |
| 763.5 | 0.112 |
| 763.6 | 0.111 |
| 763.7 | 0.106 |
| 763.8 | 0.103 |
| 763.9 | 0.097 |
| 764.0 | 0.099 |
| 764.1 | 0.099 |
| 764.2 | 0.104 |
| 764.3 | 0.109 |
| 764.4 | 0.116 |
| 764.5 | 0.119 |
| 764.6 | 0.125 |
| 764.7 | 0.13 |
| 764.8 | 0.138 |
| 764.9 | 0.142 |
| 765.0 | 0.144 |
| 765.1 | 0.148 |
| 765.2 | 0.152 |
| 765.3 | 0.155 |
| 765.4 | 0.154 |
| 765.5 | 0.147 |
| 765.6 | 0.142 |
| 765.7 | 0.133 |
| 765.8 | 0.127 |
| 765.9 | 0.117 |
| 766.0 | 0.114 |
| 766.1 | 0.111 |
| 766.2 | 0.111 |
| 766.3 | 0.107 |
| 766.4 | 0.103 |
| 766.5 | 0.097 |
| 766.6 | 0.093 |
| 766.7 | 0.087 |
| 766.8 | 0.083 |
| 766.9 | 0.079 |
| 767.0 | 0.075 |
| 767.1 | 0.074 |
| 767.2 | 0.073 |
| 767.3 | 0.068 |
| 767.4 | 0.062 |
| 767.5 | 0.053 |
| 767.6 | 0.052 |
| 767.7 | 0.05 |
| 767.8 | 0.048 |
| 767.9 | 0.048 |
| 768.0 | 0.042 |
| 768.1 | 0.037 |
| 768.2 | 0.032 |
| 768.3 | 0.034 |
| 768.4 | 0.037 |
| 768.5 | 0.039 |
| 768.6 | 0.039 |
| 768.7 | 0.034 |
| 768.8 | 0.029 |
| 768.9 | 0.026 |
| 769.0 | 0.028 |
| 769.1 | 0.028 |
| 769.2 | 0.03 |
| 769.3 | 0.029 |
| 769.4 | 0.028 |
| 769.5 | 0.027 |
| 769.6 | 0.026 |
| 769.7 | 0.028 |
| 769.8 | 0.032 |
| 769.9 | 0.032 |
| 770.0 | 0.03 |
| 770.1 | 0.027 |
| 770.2 | 0.029 |
| 770.3 | 0.032 |
| 770.4 | 0.03 |
| 770.5 | 0.029 |
| 770.6 | 0.028 |
| 770.7 | 0.03 |
| 770.8 | 0.033 |
| 770.9 | 0.035 |
| 771.0 | 0.034 |
| 771.1 | 0.029 |
| 771.2 | 0.026 |
| 771.3 | 0.029 |
| 771.4 | 0.034 |
| 771.5 | 0.035 |
| 771.6 | 0.036 |
| 771.7 | 0.036 |
| 771.8 | 0.04 |
| 771.9 | 0.038 |
| 772.0 | 0.035 |
| 772.1 | 0.034 |
| 772.2 | 0.035 |
| 772.3 | 0.038 |
| 772.4 | 0.037 |
| 772.5 | 0.038 |
| 772.6 | 0.036 |
| 772.7 | 0.036 |
| 772.8 | 0.034 |
| 772.9 | 0.038 |
| 773.0 | 0.036 |
| 773.1 | 0.036 |
| 773.2 | 0.032 |
| 773.3 | 0.033 |
| 773.4 | 0.034 |
| 773.5 | 0.033 |
| 773.6 | 0.034 |
| 773.7 | 0.037 |
| 773.8 | 0.042 |
| 773.9 | 0.041 |
| 774.0 | 0.039 |
| 774.1 | 0.036 |
| 774.2 | 0.039 |
| 774.3 | 0.039 |
| 774.4 | 0.044 |
| 774.5 | 0.043 |
| 774.6 | 0.045 |
| 774.7 | 0.044 |
| 774.8 | 0.043 |
| 774.9 | 0.045 |
| 775.0 | 0.045 |
| 775.1 | 0.049 |
| 775.2 | 0.048 |
| 775.3 | 0.05 |
| 775.4 | 0.051 |
| 775.5 | 0.053 |
| 775.6 | 0.056 |
| 775.7 | 0.057 |
| 775.8 | 0.061 |
| 775.9 | 0.061 |
| 776.0 | 0.061 |
| 776.1 | 0.064 |
| 776.2 | 0.071 |
| 776.3 | 0.078 |
| 776.4 | 0.085 |
| 776.5 | 0.093 |
| 776.6 | 0.103 |
| 776.7 | 0.112 |
| 776.8 | 0.124 |
| 776.9 | 0.135 |
| 777.0 | 0.151 |
| 777.1 | 0.168 |
| 777.2 | 0.184 |
| 777.3 | 0.195 |
| 777.4 | 0.206 |
| 777.5 | 0.215 |
| 777.6 | 0.223 |
| 777.7 | 0.225 |
| 777.8 | 0.226 |
| 777.9 | 0.225 |
| 778.0 | 0.221 |
| 778.1 | 0.214 |
| 778.2 | 0.201 |
| 778.3 | 0.194 |
| 778.4 | 0.186 |
| 778.5 | 0.181 |
| 778.6 | 0.174 |
| 778.7 | 0.167 |
| 778.8 | 0.161 |
| 778.9 | 0.153 |
| 779.0 | 0.149 |
| 779.1 | 0.14 |
| 779.2 | 0.135 |
| 779.3 | 0.126 |
| 779.4 | 0.121 |
| 779.5 | 0.117 |
| 779.6 | 0.113 |
| 779.7 | 0.114 |
| 779.8 | 0.11 |
| 779.9 | 0.104 |
| 780.0 | 0.094 |
| 780.1 | 0.089 |
| 780.2 | 0.087 |
| 780.3 | 0.086 |
| 780.4 | 0.079 |
| 780.5 | 0.078 |
| 780.6 | 0.077 |
| 780.7 | 0.079 |
| 780.8 | 0.076 |
| 780.9 | 0.075 |
| 781.0 | 0.071 |
| 781.1 | 0.073 |
| 781.2 | 0.074 |
| 781.3 | 0.074 |
| 781.4 | 0.073 |
| 781.5 | 0.073 |
| 781.6 | 0.075 |
| 781.7 | 0.078 |
| 781.8 | 0.077 |
| 781.9 | 0.076 |
| 782.0 | 0.075 |
| 782.1 | 0.074 |
| 782.2 | 0.073 |
| 782.3 | 0.074 |
| 782.4 | 0.073 |
| 782.5 | 0.074 |
| 782.6 | 0.076 |
| 782.7 | 0.08 |
| 782.8 | 0.083 |
| 782.9 | 0.084 |
| 783.0 | 0.087 |
| 783.1 | 0.084 |
| 783.2 | 0.082 |
| 783.3 | 0.081 |
| 783.4 | 0.086 |
| 783.5 | 0.086 |
| 783.6 | 0.087 |
| 783.7 | 0.087 |
| 783.8 | 0.09 |
| 783.9 | 0.089 |
| 784.0 | 0.095 |
| 784.1 | 0.095 |
| 784.2 | 0.104 |
| 784.3 | 0.104 |
| 784.4 | 0.109 |
| 784.5 | 0.107 |
| 784.6 | 0.11 |
| 784.7 | 0.117 |
| 784.8 | 0.127 |
| 784.9 | 0.137 |
| 785.0 | 0.145 |
| 785.1 | 0.154 |
| 785.2 | 0.164 |
| 785.3 | 0.176 |
| 785.4 | 0.18 |
| 785.5 | 0.184 |
| 785.6 | 0.185 |
| 785.7 | 0.189 |
| 785.8 | 0.186 |
| 785.9 | 0.181 |
| 786.0 | 0.181 |
| 786.1 | 0.182 |
| 786.2 | 0.18 |
| 786.3 | 0.174 |
| 786.4 | 0.172 |
| 786.5 | 0.174 |
| 786.6 | 0.175 |
| 786.7 | 0.173 |
| 786.8 | 0.165 |
| 786.9 | 0.159 |
| 787.0 | 0.158 |
| 787.1 | 0.157 |
| 787.2 | 0.156 |
| 787.3 | 0.148 |
| 787.4 | 0.142 |
| 787.5 | 0.14 |
| 787.6 | 0.139 |
| 787.7 | 0.138 |
| 787.8 | 0.131 |
| 787.9 | 0.125 |
| 788.0 | 0.119 |
| 788.1 | 0.115 |
| 788.2 | 0.115 |
| 788.3 | 0.114 |
| 788.4 | 0.115 |
| 788.5 | 0.114 |
| 788.6 | 0.119 |
| 788.7 | 0.118 |
| 788.8 | 0.117 |
| 788.9 | 0.117 |
| 789.0 | 0.121 |
| 789.1 | 0.124 |
| 789.2 | 0.13 |
| 789.3 | 0.134 |
| 789.4 | 0.141 |
| 789.5 | 0.143 |
| 789.6 | 0.148 |
| 789.7 | 0.147 |
| 789.8 | 0.146 |
| 789.9 | 0.15 |
| 790.0 | 0.158 |
| 790.1 | 0.162 |
| 790.2 | 0.164 |
| 790.3 | 0.168 |
| 790.4 | 0.178 |
| 790.5 | 0.194 |
| 790.6 | 0.202 |
| 790.7 | 0.212 |
| 790.8 | 0.22 |
| 790.9 | 0.234 |
| 791.0 | 0.256 |
| 791.1 | 0.275 |
| 791.2 | 0.308 |
| 791.3 | 0.345 |
| 791.4 | 0.387 |
| 791.5 | 0.428 |
| 791.6 | 0.463 |
| 791.7 | 0.496 |
| 791.8 | 0.515 |
| 791.9 | 0.521 |
| 792.0 | 0.514 |
| 792.1 | 0.504 |
| 792.2 | 0.49 |
| 792.3 | 0.482 |
| 792.4 | 0.483 |
| 792.5 | 0.497 |
| 792.6 | 0.52 |
| 792.7 | 0.548 |
| 792.8 | 0.587 |
| 792.9 | 0.626 |
| 793.0 | 0.654 |
| 793.1 | 0.665 |
| 793.2 | 0.66 |
| 793.3 | 0.64 |
| 793.4 | 0.608 |
| 793.5 | 0.568 |
| 793.6 | 0.532 |
| 793.7 | 0.497 |
| 793.8 | 0.469 |
| 793.9 | 0.45 |
| 794.0 | 0.443 |
| 794.1 | 0.451 |
| 794.2 | 0.471 |
| 794.3 | 0.504 |
| 794.4 | 0.554 |
| 794.5 | 0.614 |
| 794.6 | 0.689 |
| 794.7 | 0.765 |
| 794.8 | 0.856 |
| 794.9 | 0.94 |
| 795.0 | 1.006 |
| 795.1 | 1.034 |
| 795.2 | 1.026 |
| 795.3 | 0.985 |
| 795.4 | 0.925 |
| 795.5 | 0.845 |
| 795.6 | 0.753 |
| 795.7 | 0.657 |
| 795.8 | 0.576 |
| 795.9 | 0.512 |
| 796.0 | 0.463 |
| 796.1 | 0.418 |
| 796.2 | 0.376 |
| 796.3 | 0.339 |
| 796.4 | 0.309 |
| 796.5 | 0.287 |
| 796.6 | 0.27 |
| 796.7 | 0.256 |
| 796.8 | 0.253 |
| 796.9 | 0.248 |
| 797.0 | 0.245 |
| 797.1 | 0.235 |
| 797.2 | 0.233 |
| 797.3 | 0.232 |
| 797.4 | 0.235 |
| 797.5 | 0.237 |
| 797.6 | 0.243 |
| 797.7 | 0.252 |
| 797.8 | 0.262 |
| 797.9 | 0.277 |
| 798.0 | 0.303 |
| 798.1 | 0.336 |
| 798.2 | 0.375 |
| 798.3 | 0.415 |
| 798.4 | 0.463 |
| 798.5 | 0.509 |
| 798.6 | 0.55 |
| 798.7 | 0.577 |
| 798.8 | 0.587 |
| 798.9 | 0.577 |
| 799.0 | 0.556 |
| 799.1 | 0.523 |
| 799.2 | 0.484 |
| 799.3 | 0.447 |
| 799.4 | 0.413 |
| 799.5 | 0.381 |
| 799.6 | 0.349 |
| 799.7 | 0.323 |
| 799.8 | 0.303 |
| 799.9 | 0.281 |
| 800.0 | 0.265 |
| 800.1 | 0.25 |
| 800.2 | 0.242 |
| 800.3 | 0.231 |
| 800.4 | 0.22 |
| 800.5 | 0.208 |
| 800.6 | 0.201 |
| 800.7 | 0.202 |
| 800.8 | 0.205 |
| 800.9 | 0.207 |
| 801.0 | 0.212 |
| 801.1 | 0.213 |
| 801.2 | 0.216 |
| 801.3 | 0.212 |
| 801.4 | 0.214 |
| 801.5 | 0.226 |
| 801.6 | 0.243 |
| 801.7 | 0.263 |
| 801.8 | 0.277 |
| 801.9 | 0.293 |
| 802.0 | 0.309 |
| 802.1 | 0.328 |
| 802.2 | 0.351 |
| 802.3 | 0.377 |
| 802.4 | 0.4 |
| 802.5 | 0.422 |
| 802.6 | 0.439 |
| 802.7 | 0.455 |
| 802.8 | 0.463 |
| 802.9 | 0.473 |
| 803.0 | 0.484 |
| 803.1 | 0.499 |
| 803.2 | 0.515 |
| 803.3 | 0.532 |
| 803.4 | 0.551 |
| 803.5 | 0.571 |
| 803.6 | 0.596 |
| 803.7 | 0.624 |
| 803.8 | 0.653 |
| 803.9 | 0.693 |
| 804.0 | 0.74 |
| 804.1 | 0.794 |
| 804.2 | 0.846 |
| 804.3 | 0.894 |
| 804.4 | 0.939 |
| 804.5 | 0.968 |
| 804.6 | 0.983 |
| 804.7 | 0.983 |
| 804.8 | 0.971 |
| 804.9 | 0.955 |
| 805.0 | 0.933 |
| 805.1 | 0.913 |
| 805.2 | 0.899 |
| 805.3 | 0.894 |
| 805.4 | 0.893 |
| 805.5 | 0.904 |
| 805.6 | 0.923 |
| 805.7 | 0.949 |
| 805.8 | 0.97 |
| 805.9 | 0.988 |
| 806.0 | 1.003 |
| 806.1 | 1.014 |
| 806.2 | 1.02 |
| 806.3 | 1.018 |
| 806.4 | 1.021 |
| 806.5 | 1.017 |
| 806.6 | 1.018 |
| 806.7 | 1.012 |
| 806.8 | 1.016 |
| 806.9 | 1.021 |
| 807.0 | 1.031 |
| 807.1 | 1.041 |
| 807.2 | 1.06 |
| 807.3 | 1.088 |
| 807.4 | 1.127 |
| 807.5 | 1.174 |
| 807.6 | 1.234 |
| 807.7 | 1.299 |
| 807.8 | 1.365 |
| 807.9 | 1.42 |
| 808.0 | 1.46 |
| 808.1 | 1.477 |
| 808.2 | 1.478 |
| 808.3 | 1.458 |
| 808.4 | 1.422 |
| 808.5 | 1.369 |
| 808.6 | 1.301 |
| 808.7 | 1.222 |
| 808.8 | 1.134 |
| 808.9 | 1.043 |
| 809.0 | 0.96 |
| 809.1 | 0.881 |
| 809.2 | 0.816 |
| 809.3 | 0.752 |
| 809.4 | 0.698 |
| 809.5 | 0.648 |
| 809.6 | 0.603 |
| 809.7 | 0.564 |
| 809.8 | 0.537 |
| 809.9 | 0.517 |
| 810.0 | 0.502 |
| 810.1 | 0.493 |
| 810.2 | 0.495 |
| 810.3 | 0.498 |
| 810.4 | 0.508 |
| 810.5 | 0.523 |
| 810.6 | 0.548 |
| 810.7 | 0.576 |
| 810.8 | 0.606 |
| 810.9 | 0.641 |
| 811.0 | 0.671 |
| 811.1 | 0.702 |
| 811.2 | 0.734 |
| 811.3 | 0.765 |
| 811.4 | 0.792 |
| 811.5 | 0.814 |
| 811.6 | 0.833 |
| 811.7 | 0.851 |
| 811.8 | 0.868 |
| 811.9 | 0.882 |
| 812.0 | 0.903 |
| 812.1 | 0.926 |
| 812.2 | 0.954 |
| 812.3 | 0.984 |
| 812.4 | 1.012 |
| 812.5 | 1.032 |
| 812.6 | 1.045 |
| 812.7 | 1.049 |
| 812.8 | 1.049 |
| 812.9 | 1.04 |
| 813.0 | 1.022 |
| 813.1 | 0.997 |
| 813.2 | 0.967 |
| 813.3 | 0.927 |
| 813.4 | 0.883 |
| 813.5 | 0.829 |
| 813.6 | 0.773 |
| 813.7 | 0.709 |
| 813.8 | 0.647 |
| 813.9 | 0.585 |
| 814.0 | 0.528 |
| 814.1 | 0.471 |
| 814.2 | 0.422 |
| 814.3 | 0.383 |
| 814.4 | 0.358 |
| 814.5 | 0.342 |
| 814.6 | 0.33 |
| 814.7 | 0.317 |
| 814.8 | 0.311 |
| 814.9 | 0.302 |
| 815.0 | 0.3 |
| 815.1 | 0.297 |
| 815.2 | 0.302 |
| 815.3 | 0.306 |
| 815.4 | 0.309 |
| 815.5 | 0.317 |
| 815.6 | 0.332 |
| 815.7 | 0.349 |
| 815.8 | 0.366 |
| 815.9 | 0.378 |
| 816.0 | 0.377 |
| 816.1 | 0.376 |
| 816.2 | 0.368 |
| 816.3 | 0.367 |
| 816.4 | 0.361 |
| 816.5 | 0.355 |
| 816.6 | 0.351 |
| 816.7 | 0.349 |
| 816.8 | 0.351 |
| 816.9 | 0.357 |
| 817.0 | 0.371 |
| 817.1 | 0.383 |
| 817.2 | 0.401 |
| 817.3 | 0.419 |
| 817.4 | 0.441 |
| 817.5 | 0.457 |
| 817.6 | 0.461 |
| 817.7 | 0.46 |
| 817.8 | 0.446 |
| 817.9 | 0.425 |
| 818.0 | 0.39 |
| 818.1 | 0.352 |
| 818.2 | 0.322 |
| 818.3 | 0.295 |
| 818.4 | 0.274 |
| 818.5 | 0.249 |
| 818.6 | 0.232 |
| 818.7 | 0.217 |
| 818.8 | 0.205 |
| 818.9 | 0.199 |
| 819.0 | 0.199 |
| 819.1 | 0.201 |
| 819.2 | 0.204 |
| 819.3 | 0.207 |
| 819.4 | 0.214 |
| 819.5 | 0.222 |
| 819.6 | 0.24 |
| 819.7 | 0.256 |
| 819.8 | 0.274 |
| 819.9 | 0.299 |
| 820.0 | 0.329 |
| 820.1 | 0.364 |
| 820.2 | 0.396 |
| 820.3 | 0.438 |
| 820.4 | 0.483 |
| 820.5 | 0.534 |
| 820.6 | 0.585 |
| 820.7 | 0.636 |
| 820.8 | 0.682 |
| 820.9 | 0.713 |
| 821.0 | 0.721 |
| 821.1 | 0.71 |
| 821.2 | 0.683 |
| 821.3 | 0.648 |
| 821.4 | 0.6 |
| 821.5 | 0.541 |
| 821.6 | 0.477 |
| 821.7 | 0.413 |
| 821.8 | 0.365 |
| 821.9 | 0.326 |
| 822.0 | 0.293 |
| 822.1 | 0.261 |
| 822.2 | 0.229 |
| 822.3 | 0.212 |
| 822.4 | 0.195 |
| 822.5 | 0.18 |
| 822.6 | 0.163 |
| 822.7 | 0.148 |
| 822.8 | 0.138 |
| 822.9 | 0.132 |
| 823.0 | 0.13 |
| 823.1 | 0.133 |
| 823.2 | 0.131 |
| 823.3 | 0.13 |
| 823.4 | 0.13 |
| 823.5 | 0.131 |
| 823.6 | 0.134 |
| 823.7 | 0.137 |
| 823.8 | 0.14 |
| 823.9 | 0.145 |
| 824.0 | 0.151 |
| 824.1 | 0.157 |
| 824.2 | 0.164 |
| 824.3 | 0.165 |
| 824.4 | 0.166 |
| 824.5 | 0.16 |
| 824.6 | 0.166 |
| 824.7 | 0.161 |
| 824.8 | 0.164 |
| 824.9 | 0.147 |
| 825.0 | 0.134 |
| 825.1 | 0.119 |
| 825.2 | 0.117 |
| 825.3 | 0.119 |
| 825.4 | 0.12 |
| 825.5 | 0.116 |
| 825.6 | 0.107 |
| 825.7 | 0.104 |
| 825.8 | 0.096 |
| 825.9 | 0.097 |
| 826.0 | 0.093 |
| 826.1 | 0.09 |
| 826.2 | 0.088 |
| 826.3 | 0.085 |
| 826.4 | 0.086 |
| 826.5 | 0.086 |
| 826.6 | 0.087 |
| 826.7 | 0.09 |
| 826.8 | 0.089 |
| 826.9 | 0.087 |
| 827.0 | 0.091 |
| 827.1 | 0.1 |
| 827.2 | 0.106 |
| 827.3 | 0.11 |
| 827.4 | 0.11 |
| 827.5 | 0.117 |
| 827.6 | 0.123 |
| 827.7 | 0.127 |
| 827.8 | 0.136 |
| 827.9 | 0.148 |
| 828.0 | 0.162 |
| 828.1 | 0.164 |
| 828.2 | 0.154 |
| 828.3 | 0.148 |
| 828.4 | 0.141 |
| 828.5 | 0.143 |
| 828.6 | 0.136 |
| 828.7 | 0.122 |
| 828.8 | 0.113 |
| 828.9 | 0.103 |
| 829.0 | 0.099 |
| 829.1 | 0.093 |
| 829.2 | 0.086 |
| 829.3 | 0.084 |
| 829.4 | 0.074 |
| 829.5 | 0.073 |
| 829.6 | 0.068 |
| 829.7 | 0.074 |
| 829.8 | 0.069 |
| 829.9 | 0.068 |
| 830.0 | 0.006 |
| 830.1 | 0.004 |
| 830.2 | 0.012 |
| 830.3 | 0.015 |
| 830.4 | 0.008 |
| 830.5 | 0.004 |
| 830.6 | 0.005 |
| 830.7 | 0.01 |
| 830.8 | 0.014 |
| 830.9 | 0.007 |
| 831.0 | 0.001 |
| 831.1 | 0 |
| 831.2 | 0.002 |
| 831.3 | 0.005 |
| 831.4 | 0.004 |
| 831.5 | 0.001 |
| 831.6 | 0.004 |
| 831.7 | 0 |
| 831.8 | 0.004 |
| 831.9 | 0.007 |
| 832.0 | 0.007 |
| 832.1 | 0.006 |
| 832.2 | 0.004 |
| 832.3 | 0 |
| 832.4 | 0.009 |
| 832.5 | 0.009 |
| 832.6 | 0.013 |
| 832.7 | 0.016 |
| 832.8 | 0.009 |
| 832.9 | 0.005 |
| 833.0 | 0 |
| 833.1 | 0.002 |
| 833.2 | 0.005 |
| 833.3 | 0.008 |
| 833.4 | 0.001 |
| 833.5 | 0.008 |
| 833.6 | 0.001 |
| 833.7 | 0.003 |
| 833.8 | 0.004 |
| 833.9 | 0.011 |
| 834.0 | 0.007 |
| 834.1 | 0.007 |
| 834.2 | 0.009 |
| 834.3 | 0.009 |
| 834.4 | 0.005 |
| 834.5 | 0.008 |
| 834.6 | 0.012 |
| 834.7 | 0.013 |
| 834.8 | 0.013 |
| 834.9 | 0.016 |
| 835.0 | 0.02 |
| 835.1 | 0.015 |
| 835.2 | 0.01 |
| 835.3 | 0.007 |
| 835.4 | 0.011 |
| 835.5 | 0.016 |
| 835.6 | 0.015 |
| 835.7 | 0.013 |
| 835.8 | 0.011 |
| 835.9 | 0.012 |
| 836.0 | 0.014 |
| 836.1 | 0.01 |
| 836.2 | 0.014 |
| 836.3 | 0.015 |
| 836.4 | 0.019 |
| 836.5 | 0.015 |
| 836.6 | 0.009 |
| 836.7 | 0.01 |
| 836.8 | 0.01 |
| 836.9 | 0.01 |
| 837.0 | 0.01 |
| 837.1 | 0.019 |
| 837.2 | 0.004 |
| 837.3 | 0.012 |
| 837.4 | 0.013 |
| 837.5 | 0.017 |
| 837.6 | 0.014 |
| 837.7 | 0.014 |
| 837.8 | 0.003 |
| 837.9 | 0.013 |
| 838.0 | 0.016 |
| 838.1 | 0.017 |
| 838.2 | 0.006 |
| 838.3 | 0.006 |
| 838.4 | 0.006 |
| 838.5 | 0.007 |
| 838.6 | 0.013 |
| 838.7 | 0.016 |
| 838.8 | 0.018 |
| 838.9 | 0.018 |
| 839.0 | 0.01 |
| 839.1 | 0.014 |
| 839.2 | 0.012 |
| 839.3 | 0.022 |
| 839.4 | 0.017 |
| 839.5 | 0.017 |
| 839.6 | 0.011 |
| 839.7 | 0.016 |
| 839.8 | 0.018 |
| 839.9 | 0.016 |
| 840.0 | 0.011 |
| 840.1 | 0.013 |
| 840.2 | 0.012 |
| 840.3 | 0.009 |
| 840.4 | 0.007 |
| 840.5 | 0.003 |
| 840.6 | 0.006 |
| 840.7 | 0.007 |
| 840.8 | 0.008 |
| 840.9 | 0.008 |
| 841.0 | 0.005 |
| 841.1 | 0.009 |
| 841.2 | 0.014 |
| 841.3 | 0.016 |
| 841.4 | 0.02 |
| 841.5 | 0.012 |
| 841.6 | 0.011 |
| 841.7 | 0.008 |
| 841.8 | 0.012 |
| 841.9 | 0.019 |
| 842.0 | 0.021 |
| 842.1 | 0.019 |
| 842.2 | 0.004 |
| 842.3 | 0.002 |
| 842.4 | 0.002 |
| 842.5 | 0.007 |
| 842.6 | 0.008 |
| 842.7 | 0.01 |
| 842.8 | 0.017 |
| 842.9 | 0.021 |
| 843.0 | 0.006 |
| 843.1 | 0.002 |
| 843.2 | 0.005 |
| 843.3 | 0.007 |
| 843.4 | 0.009 |
| 843.5 | 0.005 |
| 843.6 | 0.004 |
| 843.7 | 0.008 |
| 843.8 | 0.017 |
| 843.9 | 0.023 |
| 844.0 | 0.023 |
| 844.1 | 0.012 |
| 844.2 | 0.012 |
| 844.3 | 0.012 |
| 844.4 | 0.02 |
| 844.5 | 0.024 |
| 844.6 | 0.022 |
| 844.7 | 0.019 |
| 844.8 | 0.023 |
| 844.9 | 0.025 |
| 845.0 | 0.024 |
| 845.1 | 0.013 |
| 845.2 | 0.006 |
| 845.3 | 0.008 |
| 845.4 | 0.014 |
| 845.5 | 0.033 |
| 845.6 | 0.035 |
| 845.7 | 0.036 |
| 845.8 | 0.02 |
| 845.9 | 0.007 |
| 846.0 | 0.009 |
| 846.1 | 0.012 |
| 846.2 | 0.028 |
| 846.3 | 0.014 |
| 846.4 | 0.007 |
| 846.5 | 0.008 |
| 846.6 | 0.019 |
| 846.7 | 0.024 |
| 846.8 | 0.01 |
| 846.9 | 0.008 |
| 847.0 | 0.005 |
| 847.1 | 0.009 |
| 847.2 | 0.001 |
| 847.3 | 0 |
| 847.4 | 0 |
| 847.5 | 0.009 |
| 847.6 | 0.01 |
| 847.7 | 0.007 |
| 847.8 | 0.006 |
| 847.9 | 0.02 |
| 848.0 | 0.03 |
| 848.1 | 0.033 |
| 848.2 | 0.026 |
| 848.3 | 0.013 |
| 848.4 | 0.011 |
| 848.5 | 0.016 |
| 848.6 | 0.035 |
| 848.7 | 0.039 |
| 848.8 | 0.04 |
| 848.9 | 0.033 |
| 849.0 | 0.026 |
| 849.1 | 0.023 |
| 849.2 | 0.01 |
| 849.3 | 0.011 |
| 849.4 | 0.004 |
| 849.5 | 0.016 |
| 849.6 | 0.018 |
| 849.7 | 0.028 |
| 849.8 | 0.027 |
| 849.9 | 0.031 |
| 850.0 | 0.025 |
| 850.1 | 0.03 |
| 850.2 | 0.024 |
| 850.3 | 0.025 |
| 850.4 | 0.023 |
| 850.5 | 0.021 |
| 850.6 | 0.013 |
| 850.7 | 0.027 |
| 850.8 | 0.038 |
| 850.9 | 0.04 |
| 851.0 | 0.017 |
| 851.1 | 0.008 |
| 851.2 | 0.012 |
| 851.3 | 0.015 |
| 851.4 | 0.018 |
| 851.5 | 0.016 |
| 851.6 | 0.027 |
| 851.7 | 0.017 |
| 851.8 | 0.002 |
| 851.9 | 0.006 |
| 852.0 | 0.004 |
| 852.1 | 0.011 |
| 852.2 | 0.004 |
| 852.3 | 0.01 |
| 852.4 | 0.02 |
| 852.5 | 0.028 |
| 852.6 | 0.027 |
| 852.7 | 0.025 |
| 852.8 | 0.026 |
| 852.9 | 0.016 |
| 853.0 | 0.018 |
| 853.1 | 0.016 |
| 853.2 | 0.003 |
| 853.3 | 0.008 |
| 853.4 | 0.036 |
| 853.5 | 0.038 |
| 853.6 | 0.029 |
| 853.7 | 0.021 |
| 853.8 | 0.017 |
| 853.9 | 0.024 |
| 854.0 | 0.014 |
| 854.1 | 0.025 |
| 854.2 | 0.011 |
| 854.3 | 0.037 |
| 854.4 | 0.037 |
| 854.5 | 0.054 |
| 854.6 | 0.036 |
| 854.7 | 0.048 |
| 854.8 | 0.051 |
| 854.9 | 0.064 |
| 855.0 | 0.062 |
| 855.1 | 0.064 |
| 855.2 | 0.05 |
| 855.3 | 0.036 |
| 855.4 | 0.01 |
| 855.5 | 0.005 |
| 855.6 | 0.006 |
| 855.7 | 0.021 |
| 855.8 | 0.025 |
| 855.9 | 0.031 |
| 856.0 | 0.037 |
| 856.1 | 0.024 |
| 856.2 | 0.011 |
| 856.3 | 0.008 |
| 856.4 | 0.027 |
| 856.5 | 0.039 |
| 856.6 | 0.03 |
| 856.7 | 0.02 |
| 856.8 | 0.017 |
| 856.9 | 0.01 |
| 857.0 | 0.008 |
| 857.1 | 0.01 |
| 857.2 | 0.041 |
| 857.3 | 0.063 |
| 857.4 | 0.067 |
| 857.5 | 0.047 |
| 857.6 | 0.037 |
| 857.7 | 0.031 |
| 857.8 | 0.023 |
| 857.9 | 0.013 |
| 858.0 | 0.026 |
| 858.1 | 0.028 |
| 858.2 | 0.028 |
| 858.3 | 0.015 |
| 858.4 | 0.006 |
| 858.5 | 0.001 |
| 858.6 | 0 |
| 858.7 | 0.015 |
| 858.8 | 0.043 |
| 858.9 | 0.043 |
| 859.0 | 0.05 |
| 859.1 | 0.032 |
| 859.2 | 0.027 |
| 859.3 | 0.029 |
| 859.4 | 0.04 |
| 859.5 | 0.041 |
| 859.6 | 0.041 |
| 859.7 | 0.029 |
| 859.8 | 0.034 |
| 859.9 | 0.028 |
| 860.0 | 0.04 |
| 860.1 | 0.027 |
| 860.2 | 0.017 |
| 860.3 | 0.025 |
| 860.4 | 0.041 |
| 860.5 | 0.052 |
| 860.6 | 0.028 |
| 860.7 | 0.013 |
| 860.8 | 0.005 |
| 860.9 | 0.018 |
| 861.0 | 0.044 |
| 861.1 | 0.048 |
| 861.2 | 0.034 |
| 861.3 | 0.029 |
| 861.4 | 0.037 |
| 861.5 | 0.039 |
| 861.6 | 0.025 |
| 861.7 | 0.021 |
| 861.8 | 0.023 |
| 861.9 | 0.028 |
| 862.0 | 0.017 |
| 862.1 | 0.008 |
| 862.2 | 0.012 |
| 862.3 | 0.015 |
| 862.4 | 0.018 |
| 862.5 | 0.016 |
| 862.6 | 0.027 |
| 862.7 | 0.017 |
| 862.8 | 0.002 |
| 862.9 | 0.006 |
| 863.0 | 0.017 |
| 863.1 | 0.008 |
| 863.2 | 0.012 |
| 863.3 | 0.015 |
| 863.4 | 0.018 |
| 863.5 | 0.016 |
| 863.6 | 0.027 |
| 863.7 | 0.017 |
| 863.8 | 0.002 |
| 863.9 | 0.006 |
| 864.0 | 0.004 |
| 864.1 | 0.011 |
| 864.2 | 0.004 |
| 864.3 | 0.01 |
| 864.4 | 0.02 |
| 864.5 | 0.028 |
| 864.6 | 0.027 |
| 864.7 | 0.025 |
| 864.8 | 0.026 |
| 864.9 | 0.016 |
| 865.0 | 0.018 |
| 865.1 | 0.016 |
| 865.2 | 0.003 |
| 865.3 | 0.008 |
| 865.4 | 0.036 |
| 865.5 | 0.038 |
| 865.6 | 0.029 |
| 865.7 | 0.021 |
| 865.8 | 0.017 |
| 865.9 | 0.024 |
| 866.0 | 0.014 |
| 866.1 | 0.009 |
| 866.2 | 0.003 |
| 866.3 | 0.011 |
| 866.4 | 0.007 |
| 866.5 | 0.01 |
| 866.6 | 0.013 |
| 866.7 | 0.011 |
| 866.8 | 0.019 |
| 866.9 | 0.021 |
| 867.0 | 0.051 |
| 867.1 | 0.066 |
| 867.2 | 0.074 |
| 867.3 | 0.049 |
| 867.4 | 0.028 |
| 867.5 | 0.031 |
| 867.6 | 0.053 |
| 867.7 | 0.081 |
| 867.8 | 0.077 |
| 867.9 | 0.087 |
| 868.0 | 0.087 |
| 868.1 | 0.106 |
| 868.2 | 0.123 |
| 868.3 | 0.134 |
| 868.4 | 0.173 |
| 868.5 | 0.197 |
| 868.6 | 0.254 |
| 868.7 | 0.285 |
| 868.8 | 0.316 |
| 868.9 | 0.327 |
| 869.0 | 0.352 |
| 869.1 | 0.359 |
| 869.2 | 0.359 |
| 869.3 | 0.343 |
| 869.4 | 0.324 |
| 869.5 | 0.316 |
| 869.6 | 0.299 |
| 869.7 | 0.294 |
| 869.8 | 0.282 |
| 869.9 | 0.278 |
| 870.0 | 0.288 |
| 870.1 | 0.333 |
| 870.2 | 0.385 |
| 870.3 | 0.44 |
| 870.4 | 0.494 |
| 870.5 | 0.592 |
| 870.6 | 0.69 |
| 870.7 | 0.795 |
| 870.8 | 0.863 |
| 870.9 | 0.943 |
| 871.0 | 0.997 |
| 871.1 | 1.054 |
| 871.2 | 1.065 |
| 871.3 | 1.025 |
| 871.4 | 0.961 |
| 871.5 | 0.878 |
| 871.6 | 0.825 |
| 871.7 | 0.737 |
| 871.8 | 0.656 |
| 871.9 | 0.562 |
| 872.0 | 0.493 |
| 872.1 | 0.417 |
| 872.2 | 0.348 |
| 872.3 | 0.296 |
| 872.4 | 0.265 |
| 872.5 | 0.23 |
| 872.6 | 0.191 |
| 872.7 | 0.168 |
| 872.8 | 0.131 |
| 872.9 | 0.112 |
| 873.0 | 0.077 |
| 873.1 | 0.077 |
| 873.2 | 0.063 |
| 873.3 | 0.081 |
| 873.4 | 0.076 |
| 873.5 | 0.079 |
| 873.6 | 0.075 |
| 873.7 | 0.084 |
| 873.8 | 0.083 |
| 873.9 | 0.082 |
| 874.0 | 0.103 |
| 874.1 | 0.114 |
| 874.2 | 0.114 |
| 874.3 | 0.124 |
| 874.4 | 0.123 |
| 874.5 | 0.128 |
| 874.6 | 0.108 |
| 874.7 | 0.112 |
| 874.8 | 0.117 |
| 874.9 | 0.131 |
| 875.0 | 0.146 |
| 875.1 | 0.165 |
| 875.2 | 0.197 |
| 875.3 | 0.234 |
| 875.4 | 0.277 |
| 875.5 | 0.329 |
| 875.6 | 0.391 |
| 875.7 | 0.461 |
| 875.8 | 0.525 |
| 875.9 | 0.634 |
| 876.0 | 0.714 |
| 876.1 | 0.78 |
| 876.2 | 0.78 |
| 876.3 | 0.773 |
| 876.4 | 0.73 |
| 876.5 | 0.675 |
| 876.6 | 0.619 |
| 876.7 | 0.54 |
| 876.8 | 0.461 |
| 876.9 | 0.375 |
| 877.0 | 0.329 |
| 877.1 | 0.284 |
| 877.2 | 0.252 |
| 877.3 | 0.219 |
| 877.4 | 0.186 |
| 877.5 | 0.15 |
| 877.6 | 0.126 |
| 877.7 | 0.106 |
| 877.8 | 0.098 |
| 877.9 | 0.086 |
| 878.0 | 0.094 |
| 878.1 | 0.092 |
| 878.2 | 0.093 |
| 878.3 | 0.092 |
| 878.4 | 0.102 |
| 878.5 | 0.108 |
| 878.6 | 0.114 |
| 878.7 | 0.125 |
| 878.8 | 0.146 |
| 878.9 | 0.166 |
| 879.0 | 0.194 |
| 879.1 | 0.208 |
| 879.2 | 0.223 |
| 879.3 | 0.233 |
| 879.4 | 0.254 |
| 879.5 | 0.269 |
| 879.6 | 0.276 |
| 879.7 | 0.278 |
| 879.8 | 0.28 |
| 879.9 | 0.275 |
| 880.0 | 0.277 |
| 880.1 | 0.274 |
| 880.2 | 0.272 |
| 880.3 | 0.257 |
| 880.4 | 0.238 |
| 880.5 | 0.211 |
| 880.6 | 0.181 |
| 880.7 | 0.149 |
| 880.8 | 0.123 |
| 880.9 | 0.1 |
| 881.0 | 0.083 |
| 881.1 | 0.061 |
| 881.2 | 0.04 |
| 881.3 | 0.03 |
| 881.4 | 0.019 |
| 881.5 | 0.018 |
| 881.6 | 0.016 |
| 881.7 | 0.014 |
| 881.8 | 0.018 |
| 881.9 | 0.017 |
| 882.0 | 0.026 |
| 882.1 | 0.026 |
| 882.2 | 0.034 |
| 882.3 | 0.039 |
| 882.4 | 0.048 |
| 882.5 | 0.061 |
| 882.6 | 0.083 |
| 882.7 | 0.095 |
| 882.8 | 0.115 |
| 882.9 | 0.13 |
| 883.0 | 0.159 |
| 883.1 | 0.18 |
| 883.2 | 0.215 |
| 883.3 | 0.254 |
| 883.4 | 0.314 |
| 883.5 | 0.375 |
| 883.6 | 0.472 |
| 883.7 | 0.568 |
| 883.8 | 0.67 |
| 883.9 | 0.741 |
| 884.0 | 0.847 |
| 884.1 | 0.96 |
| 884.2 | 1.087 |
| 884.3 | 1.169 |
| 884.4 | 1.269 |
| 884.5 | 1.352 |
| 884.6 | 1.435 |
| 884.7 | 1.482 |
| 884.8 | 1.524 |
| 884.9 | 1.552 |
| 885.0 | 1.565 |
| 885.1 | 1.556 |
| 885.2 | 1.513 |
| 885.3 | 1.436 |
| 885.4 | 1.344 |
| 885.5 | 1.208 |
| 885.6 | 1.057 |
| 885.7 | 0.898 |
| 885.8 | 0.782 |
| 885.9 | 0.675 |
| 886.0 | 0.579 |
| 886.1 | 0.493 |
| 886.2 | 0.423 |
| 886.3 | 0.347 |
| 886.4 | 0.281 |
| 886.5 | 0.233 |
| 886.6 | 0.209 |
| 886.7 | 0.184 |
| 886.8 | 0.156 |
| 886.9 | 0.125 |
| 887.0 | 0.111 |
| 887.1 | 0.091 |
| 887.2 | 0.079 |
| 887.3 | 0.06 |
| 887.4 | 0.05 |
| 887.5 | 0.045 |
| 887.6 | 0.04 |
| 887.7 | 0.037 |
| 887.8 | 0.036 |
| 887.9 | 0.035 |
| 888.0 | 0.028 |
| 888.1 | 0.022 |
| 888.2 | 0.023 |
| 888.3 | 0.025 |
| 888.4 | 0.03 |
| 888.5 | 0.034 |
| 888.6 | 0.049 |
| 888.7 | 0.063 |
| 888.8 | 0.076 |
| 888.9 | 0.083 |
| 889.0 | 0.088 |
| 889.1 | 0.103 |
| 889.2 | 0.123 |
| 889.3 | 0.146 |
| 889.4 | 0.166 |
| 889.5 | 0.195 |
| 889.6 | 0.229 |
| 889.7 | 0.266 |
| 889.8 | 0.309 |
| 889.9 | 0.361 |
| 890.0 | 0.41 |
| 890.1 | 0.453 |
| 890.2 | 0.502 |
| 890.3 | 0.549 |
| 890.4 | 0.592 |
| 890.5 | 0.614 |
| 890.6 | 0.623 |
| 890.7 | 0.621 |
| 890.8 | 0.609 |
| 890.9 | 0.588 |
| 891.0 | 0.548 |
| 891.1 | 0.502 |
| 891.2 | 0.455 |
| 891.3 | 0.413 |
| 891.4 | 0.367 |
| 891.5 | 0.318 |
| 891.6 | 0.282 |
| 891.7 | 0.248 |
| 891.8 | 0.217 |
| 891.9 | 0.18 |
| 892.0 | 0.153 |
| 892.1 | 0.133 |
| 892.2 | 0.117 |
| 892.3 | 0.099 |
| 892.4 | 0.09 |
| 892.5 | 0.084 |
| 892.6 | 0.08 |
| 892.7 | 0.071 |
| 892.8 | 0.068 |
| 892.9 | 0.067 |
| 893.0 | 0.065 |
| 893.1 | 0.059 |
| 893.2 | 0.059 |
| 893.3 | 0.059 |
| 893.4 | 0.058 |
| 893.5 | 0.058 |
| 893.6 | 0.056 |
| 893.7 | 0.06 |
| 893.8 | 0.057 |
| 893.9 | 0.054 |
| 894.0 | 0.047 |
| 894.1 | 0.045 |
| 894.2 | 0.043 |
| 894.3 | 0.044 |
| 894.4 | 0.04 |
| 894.5 | 0.038 |
| 894.6 | 0.031 |
| 894.7 | 0.029 |
| 894.8 | 0.024 |
| 894.9 | 0.026 |
| 895.0 | 0.021 |
| 895.1 | 0.018 |
| 895.2 | 0.015 |
| 895.3 | 0.016 |
| 895.4 | 0.013 |
| 895.5 | 0.013 |
| 895.6 | 0.013 |
| 895.7 | 0.014 |
| 895.8 | 0.006 |
| 895.9 | 0.003 |
| 896.0 | 0.001 |
| 896.1 | 0.002 |
| 896.2 | 0.002 |
| 896.3 | 0.004 |
| 896.4 | 0.009 |
| 896.5 | 0.01 |
| 896.6 | 0.007 |
| 896.7 | 0.005 |
| 896.8 | 0.003 |
| 896.9 | 0.006 |
| 897.0 | 0.006 |
| 897.1 | 0.008 |
| 897.2 | 0.011 |
| 897.3 | 0.018 |
| 897.4 | 0.02 |
| 897.5 | 0.021 |
| 897.6 | 0.021 |
| 897.7 | 0.033 |
| 897.8 | 0.041 |
| 897.9 | 0.054 |
| 898.0 | 0.061 |
| 898.1 | 0.074 |
| 898.2 | 0.081 |
| 898.3 | 0.094 |
| 898.4 | 0.103 |
| 898.5 | 0.118 |
| 898.6 | 0.128 |
| 898.7 | 0.142 |
| 898.8 | 0.15 |
| 898.9 | 0.163 |
| 899.0 | 0.171 |
| 899.1 | 0.185 |
| 899.2 | 0.192 |
| 899.3 | 0.203 |
| 899.4 | 0.202 |
| 899.5 | 0.197 |
| 899.6 | 0.19 |
| 899.7 | 0.188 |
| 899.8 | 0.182 |
| 899.9 | 0.17 |
| 900.0 | 0.159 |
| 900.1 | 0.153 |
| 900.2 | 0.143 |
| 900.3 | 0.135 |
| 900.4 | 0.126 |
| 900.5 | 0.118 |
| 900.6 | 0.107 |
| 900.7 | 0.1 |
| 900.8 | 0.098 |
| 900.9 | 0.096 |
| 901.0 | 0.088 |
| 901.1 | 0.078 |
| 901.2 | 0.069 |
| 901.3 | 0.069 |
| 901.4 | 0.068 |
| 901.5 | 0.065 |
| 901.6 | 0.059 |
| 901.7 | 0.058 |
| 901.8 | 0.057 |
| 901.9 | 0.052 |
| 902.0 | 0.045 |
| 902.1 | 0.04 |
| 902.2 | 0.035 |
| 902.3 | 0.033 |
| 902.4 | 0.03 |
| 902.5 | 0.032 |
| 902.6 | 0.032 |
| 902.7 | 0.03 |
| 902.8 | 0.024 |
| 902.9 | 0.016 |
| 903.0 | 0.037 |
| 903.1 | 0.038 |
| 903.2 | 0.039 |
| 903.3 | 0.007 |
| 903.4 | 0.01 |
| 903.5 | 0.008 |
| 903.6 | 0.008 |
| 903.7 | 0.005 |
| 903.8 | 0.003 |
| 903.9 | 0.003 |
| 904.0 | 0.001 |
| 904.1 | 0 |
| 904.2 | 0.003 |
| 904.3 | 0.001 |
| 904.4 | 0.005 |
| 904.5 | 0.001 |
| 904.6 | 0.002 |
| 904.7 | 0.002 |
| 904.8 | 0.004 |
| 904.9 | 0.005 |
| 905.0 | 0.005 |
| 905.1 | 0.001 |
| 905.2 | 0.005 |
| 905.3 | 0.006 |
| 905.4 | 0.007 |
| 905.5 | 0.002 |
| 905.6 | 0.005 |
| 905.7 | 0.006 |
| 905.8 | 0.007 |
| 905.9 | 0.006 |
| 906.0 | 0.003 |
| 906.1 | 0.002 |
| 906.2 | 0.002 |
| 906.3 | 0.004 |
| 906.4 | 0.003 |
| 906.5 | 0.001 |
| 906.6 | 0.006 |
| 906.7 | 0.003 |
| 906.8 | 0.002 |
| 906.9 | 0.002 |
| 907.0 | 0.004 |
| 907.1 | 0.003 |
| 907.2 | 0.001 |
| 907.3 | 0.005 |
| 907.4 | 0.004 |
| 907.5 | 0.004 |
| 907.6 | 0.006 |
| 907.7 | 0.003 |
| 907.8 | 0.002 |
| 907.9 | 0.002 |
| 908.0 | 0.004 |
| 908.1 | 0.003 |
| 908.2 | 0.001 |
| 908.3 | 0.002 |
| 908.4 | 0.002 |
| 908.5 | 0.002 |
| 908.6 | 0.004 |
| 908.7 | 0.002 |
| 908.8 | 0.007 |
| 908.9 | 0.005 |
| 909.0 | 0.005 |
| 909.1 | 0.003 |
| 909.2 | 0.005 |
| 909.3 | 0.007 |
| 909.4 | 0.007 |
| 909.5 | 0.007 |
| 909.6 | 0.006 |
| 909.7 | 0.008 |
| 909.8 | 0.002 |
| 909.9 | 0.001 |
| 910.0 | 0.005 |
| 910.1 | 0.007 |
| 910.2 | 0.007 |
| 910.3 | 0.007 |
| 910.4 | 0.006 |
| 910.5 | 0.002 |
| 910.6 | 0.002 |
| 910.7 | 0 |
| 910.8 | 0.005 |
| 910.9 | 0.005 |
| 911.0 | 0.003 |
| 911.1 | 0.001 |
| 911.2 | 0.005 |
| 911.3 | 0.005 |
| 911.4 | 0.007 |
| 911.5 | 0.007 |
| 911.6 | 0.007 |
| 911.7 | 0 |
| 911.8 | 0.002 |
| 911.9 | 0.007 |
| 912.0 | 0.005 |
| 912.1 | 0.001 |
| 912.2 | 0.002 |
| 912.3 | 0.007 |
| 912.4 | 0.005 |
| 912.5 | 0.005 |
| 912.6 | 0.005 |
| 912.7 | 0.006 |
| 912.8 | 0.007 |
| 912.9 | 0.006 |
| 913.0 | 0.005 |
| 913.1 | 0.006 |
| 913.2 | 0.006 |
| 913.3 | 0.008 |
| 913.4 | 0.005 |
| 913.5 | 0.004 |
| 913.6 | 0.002 |
| 913.7 | 0.003 |
| 913.8 | 0 |
| 913.9 | 0.003 |
| 914.0 | 0.001 |
| 914.1 | 0.002 |
| 914.2 | 0 |
| 914.3 | 0 |
| 914.4 | 0 |
| 914.5 | 0 |
| 914.6 | 0.002 |
| 914.7 | 0.002 |
| 914.8 | 0.002 |
| 914.9 | 0.002 |
| 915.0 | 0.001 |
| 915.1 | 0.001 |
| 915.2 | 0.001 |
| 915.3 | 0.002 |
| 915.4 | 0.003 |
| 915.5 | 0.002 |
| 915.6 | 0 |
| 915.7 | 0.002 |
| 915.8 | 0.002 |
| 915.9 | 0.003 |
| 916.0 | 0.003 |
| 916.1 | 0.001 |
| 916.2 | 0 |
| 916.3 | 0.001 |
| 916.4 | 0.004 |
| 916.5 | 0.008 |
| 916.6 | 0.007 |
| 916.7 | 0.009 |
| 916.8 | 0.007 |
| 916.9 | 0.008 |
| 917.0 | 0.006 |
| 917.1 | 0.007 |
| 917.2 | 0.006 |
| 917.3 | 0.006 |
| 917.4 | 0.006 |
| 917.5 | 0.006 |
| 917.6 | 0.006 |
| 917.7 | 0.005 |
| 917.8 | 0.005 |
| 917.9 | 0.004 |
| 918.0 | 0.002 |
| 918.1 | 0.002 |
| 918.2 | 0.001 |
| 918.3 | 0.004 |
| 918.4 | 0.003 |
| 918.5 | 0.006 |
| 918.6 | 0.005 |
| 918.7 | 0.006 |
| 918.8 | 0.001 |
| 918.9 | 0.003 |
| 919.0 | 0.002 |
| 919.1 | 0.005 |
| 919.2 | 0.006 |
| 919.3 | 0.007 |
| 919.4 | 0.007 |
| 919.5 | 0.007 |
| 919.6 | 0.008 |
| 919.7 | 0.009 |
| 919.8 | 0.008 |
| 919.9 | 0.006 |
| 920.0 | 0.006 |
| 920.1 | 0.008 |
| 920.2 | 0.01 |
| 920.3 | 0.013 |
| 920.4 | 0.013 |
| 920.5 | 0.011 |
| 920.6 | 0.009 |
| 920.7 | 0.008 |
| 920.8 | 0.008 |
| 920.9 | 0.009 |
| 921.0 | 0.007 |
| 921.1 | 0.006 |
| 921.2 | 0.004 |
| 921.3 | 0.002 |
| 921.4 | 0.002 |
| 921.5 | 0.003 |
| 921.6 | 0.003 |
| 921.7 | 0.004 |
| 921.8 | 0.004 |
| 921.9 | 0.007 |
| 922.0 | 0.005 |
| 922.1 | 0.004 |
| 922.2 | 0.002 |
| 922.3 | 0.006 |
| 922.4 | 0.005 |
| 922.5 | 0.005 |
| 922.6 | 0.005 |
| 922.7 | 0.006 |
| 922.8 | 0.006 |
| 922.9 | 0.007 |
| 923.0 | 0.006 |
| 923.1 | 0.007 |
| 923.2 | 0.005 |
| 923.3 | 0.007 |
| 923.4 | 0.007 |
| 923.5 | 0.008 |
| 923.6 | 0.008 |
| 923.7 | 0.007 |
| 923.8 | 0.007 |
| 923.9 | 0.008 |
| 924.0 | 0.01 |
| 924.1 | 0.011 |
| 924.2 | 0.01 |
| 924.3 | 0.008 |
| 924.4 | 0.005 |
| 924.5 | 0.004 |
| 924.6 | 0.004 |
| 924.7 | 0.005 |
| 924.8 | 0.004 |
| 924.9 | 0.004 |
| 925.0 | 0.003 |
| 925.1 | 0.002 |
| 925.2 | 0.002 |
| 925.3 | 0.003 |
| 925.4 | 0.003 |
| 925.5 | 0.002 |
| 925.6 | 0.001 |
| 925.7 | 0.001 |
| 925.8 | 0.001 |
| 925.9 | 0.003 |
| 926.0 | 0.001 |
| 926.1 | 0.003 |
| 926.2 | 0 |
| 926.3 | 0.001 |
| 926.4 | 0.001 |
| 926.5 | 0 |
| 926.6 | 0.001 |
| 926.7 | 0.001 |
| 926.8 | 0.003 |
| 926.9 | 0.002 |
| 927.0 | 0.004 |
| 927.1 | 0.005 |
| 927.2 | 0.007 |
| 927.3 | 0.007 |
| 927.4 | 0.006 |
| 927.5 | 0.004 |
| 927.6 | 0.004 |
| 927.7 | 0.005 |
| 927.8 | 0.005 |
| 927.9 | 0.006 |
| 928.0 | 0.005 |
| 928.1 | 0.005 |
| 928.2 | 0.002 |
| 928.3 | 0.002 |
| 928.4 | 0.002 |
| 928.5 | 0.001 |
| 928.6 | 0.004 |
| 928.7 | 0.004 |
| 928.8 | 0.004 |
| 928.9 | 0.001 |
| 929.0 | 0.002 |
| 929.1 | 0 |
| 929.2 | 0.001 |
| 929.3 | 0.003 |
| 929.4 | 0.003 |
| 929.5 | 0.003 |
| 929.6 | 0.003 |
| 929.7 | 0.004 |
| 929.8 | 0.003 |
| 929.9 | 0.004 |
| 930.0 | 0.004 |
| 930.1 | 0.005 |
| 930.2 | 0.006 |
| 930.3 | 0.006 |
| 930.4 | 0.007 |
| 930.5 | 0.007 |
| 930.6 | 0.006 |
| 930.7 | 0.006 |
| 930.8 | 0.006 |
| 930.9 | 0.007 |
| 931.0 | 0.008 |
| 931.1 | 0.009 |
| 931.2 | 0.009 |
| 931.3 | 0.008 |
| 931.4 | 0.007 |
| 931.5 | 0.007 |
| 931.6 | 0.009 |
| 931.7 | 0.008 |
| 931.8 | 0.01 |
| 931.9 | 0.009 |
| 932.0 | 0.007 |
| 932.1 | 0.007 |
| 932.2 | 0.005 |
| 932.3 | 0.006 |
| 932.4 | 0.005 |
| 932.5 | 0.005 |
| 932.6 | 0.005 |
| 932.7 | 0.004 |
| 932.8 | 0.002 |
| 932.9 | 0.002 |
| 933.0 | 0.004 |
| 933.1 | 0.005 |
| 933.2 | 0.005 |
| 933.3 | 0.005 |
| 933.4 | 0.005 |
| 933.5 | 0.006 |
| 933.6 | 0.007 |
| 933.7 | 0.007 |
| 933.8 | 0.007 |
| 933.9 | 0.008 |
| 934.0 | 0.007 |
| 934.1 | 0.009 |
| 934.2 | 0.01 |
| 934.3 | 0.01 |
| 934.4 | 0.009 |
| 934.5 | 0.011 |
| 934.6 | 0.011 |
| 934.7 | 0.012 |
| 934.8 | 0.011 |
| 934.9 | 0.012 |
| 935.0 | 0.011 |
| 935.1 | 0.011 |
| 935.2 | 0.01 |
| 935.3 | 0.01 |
| 935.4 | 0.01 |
| 935.5 | 0.01 |
| 935.6 | 0.009 |
| 935.7 | 0.006 |
| 935.8 | 0.007 |
| 935.9 | 0.006 |
| 936.0 | 0.008 |
| 936.1 | 0.007 |
| 936.2 | 0.006 |
| 936.3 | 0.005 |
| 936.4 | 0.006 |
| 936.5 | 0.007 |
| 936.6 | 0.007 |
| 936.7 | 0.005 |
| 936.8 | 0.004 |
| 936.9 | 0.004 |
| 937.0 | 0.005 |
| 937.1 | 0.007 |
| 937.2 | 0.008 |
| 937.3 | 0.009 |
| 937.4 | 0.01 |
| 937.5 | 0.012 |
| 937.6 | 0.01 |
| 937.7 | 0.009 |
| 937.8 | 0.007 |
| 937.9 | 0.009 |
| 938.0 | 0.009 |
| 938.1 | 0.012 |
| 938.2 | 0.011 |
| 938.3 | 0.013 |
| 938.4 | 0.012 |
| 938.5 | 0.014 |
| 938.6 | 0.012 |
| 938.7 | 0.011 |
| 938.8 | 0.01 |
| 938.9 | 0.011 |
| 939.0 | 0.009 |
| 939.1 | 0.008 |
| 939.2 | 0.007 |
| 939.3 | 0.009 |
| 939.4 | 0.008 |
| 939.5 | 0.008 |
| 939.6 | 0.007 |
| 939.7 | 0.006 |
| 939.8 | 0.007 |
| 939.9 | 0.007 |
| 940.0 | 0.007 |
| 940.1 | 0.008 |
| 940.2 | 0.006 |
| 940.3 | 0.007 |
| 940.4 | 0.007 |
| 940.5 | 0.008 |
| 940.6 | 0.006 |
| 940.7 | 0.006 |
| 940.8 | 0.007 |
| 940.9 | 0.008 |
| 941.0 | 0.01 |
| 941.1 | 0.01 |
| 941.2 | 0.01 |
| 941.3 | 0.01 |
| 941.4 | 0.011 |
| 941.5 | 0.014 |
| 941.6 | 0.014 |
| 941.7 | 0.015 |
| 941.8 | 0.015 |
| 941.9 | 0.018 |
| 942.0 | 0.019 |
| 942.1 | 0.02 |
| 942.2 | 0.018 |
| 942.3 | 0.019 |
| 942.4 | 0.019 |
| 942.5 | 0.022 |
| 942.6 | 0.023 |
| 942.7 | 0.024 |
| 942.8 | 0.026 |
| 942.9 | 0.027 |
| 943.0 | 0.029 |
| 943.1 | 0.029 |
| 943.2 | 0.029 |
| 943.3 | 0.028 |
| 943.4 | 0.025 |
| 943.5 | 0.024 |
| 943.6 | 0.02 |
| 943.7 | 0.018 |
| 943.8 | 0.015 |
| 943.9 | 0.014 |
| 944.0 | 0.013 |
| 944.1 | 0.013 |
| 944.2 | 0.012 |
| 944.3 | 0.011 |
| 944.4 | 0.009 |
| 944.5 | 0.009 |
| 944.6 | 0.01 |
| 944.7 | 0.01 |
| 944.8 | 0.01 |
| 944.9 | 0.009 |
| 945.0 | 0.009 |
| 945.1 | 0.008 |
| 945.2 | 0.008 |
| 945.3 | 0.008 |
| 945.4 | 0.008 |
| 945.5 | 0.007 |
| 945.6 | 0.006 |
| 945.7 | 0.006 |
| 945.8 | 0.006 |
| 945.9 | 0.005 |
| 946.0 | 0.006 |
| 946.1 | 0.007 |
| 946.2 | 0.006 |
| 946.3 | 0.006 |
| 946.4 | 0.005 |
| 946.5 | 0.005 |
| 946.6 | 0.004 |
| 946.7 | 0.003 |
| 946.8 | 0.002 |
| 946.9 | 0.003 |
| 947.0 | 0.002 |
| 947.1 | 0.003 |
| 947.2 | 0.002 |
| 947.3 | 0.003 |
| 947.4 | 0.003 |
| 947.5 | 0.005 |
| 947.6 | 0.006 |
| 947.7 | 0.006 |
| 947.8 | 0.007 |
| 947.9 | 0.008 |
| 948.0 | 0.009 |
| 948.1 | 0.009 |
| 948.2 | 0.01 |
| 948.3 | 0.012 |
| 948.4 | 0.013 |
| 948.5 | 0.014 |
| 948.6 | 0.014 |
| 948.7 | 0.015 |
| 948.8 | 0.017 |
| 948.9 | 0.019 |
| 949.0 | 0.021 |
| 949.1 | 0.023 |
| 949.2 | 0.025 |
| 949.3 | 0.028 |
| 949.4 | 0.028 |
| 949.5 | 0.03 |
| 949.6 | 0.031 |
| 949.7 | 0.032 |
| 949.8 | 0.03 |
| 949.9 | 0.029 |
| 950.0 | 0.027 |
| 950.1 | 0.025 |
| 950.2 | 0.021 |
| 950.3 | 0.018 |
| 950.4 | 0.017 |
| 950.5 | 0.017 |
| 950.6 | 0.015 |
| 950.7 | 0.013 |
| 950.8 | 0.013 |
| 950.9 | 0.011 |
| 951.0 | 0.011 |
| 951.1 | 0.01 |
| 951.2 | 0.01 |
| 951.3 | 0.009 |
| 951.4 | 0.009 |
| 951.5 | 0.009 |
| 951.6 | 0.008 |
| 951.7 | 0.007 |
| 951.8 | 0.007 |
| 951.9 | 0.006 |
| 952.0 | 0.006 |
| 952.1 | 0.006 |
| 952.2 | 0.007 |
| 952.3 | 0.008 |
| 952.4 | 0.007 |
| 952.5 | 0.005 |
| 952.6 | 0.004 |
| 952.7 | 0.003 |
| 952.8 | 0.004 |
| 952.9 | 0.004 |
| 953.0 | 0.004 |
| 953.1 | 0.004 |
| 953.2 | 0.003 |
| 953.3 | 0.003 |
| 953.4 | 0.003 |
| 953.5 | 0.003 |
| 953.6 | 0.003 |
| 953.7 | 0.004 |
| 953.8 | 0.006 |
| 953.9 | 0.006 |
| 954.0 | 0.007 |
| 954.1 | 0.007 |
| 954.2 | 0.008 |
| 954.3 | 0.008 |
| 954.4 | 0.009 |
| 954.5 | 0.008 |
| 954.6 | 0.008 |
| 954.7 | 0.007 |
| 954.8 | 0.007 |
| 954.9 | 0.005 |
| 955.0 | 0.004 |
| 955.1 | 0.003 |
| 955.2 | 0.003 |
| 955.3 | 0.002 |
| 955.4 | 0.002 |
| 955.5 | 0.002 |
| 955.6 | 0.002 |
| 955.7 | 0.001 |
| 955.8 | 0.003 |
| 955.9 | 0.002 |
| 956.0 | 0.003 |
| 956.1 | 0.002 |
| 956.2 | 0.004 |
| 956.3 | 0.005 |
| 956.4 | 0.005 |
| 956.5 | 0.006 |
| 956.6 | 0.006 |
| 956.7 | 0.006 |
| 956.8 | 0.005 |
| 956.9 | 0.005 |
| 957.0 | 0.004 |
| 957.1 | 0.005 |
| 957.2 | 0.005 |
| 957.3 | 0.006 |
| 957.4 | 0.005 |
| 957.5 | 0.005 |
| 957.6 | 0.005 |
| 957.7 | 0.006 |
| 957.8 | 0.004 |
| 957.9 | 0.003 |
| 958.0 | 0.001 |
| 958.1 | 0.001 |
| 958.2 | 0.001 |
| 958.3 | 0.002 |
| 958.4 | 0.002 |
| 958.5 | 0.002 |
| 958.6 | 0.004 |
| 958.7 | 0.005 |
| 958.8 | 0.007 |
| 958.9 | 0.005 |
| 959.0 | 0.005 |
| 959.1 | 0.005 |
| 959.2 | 0.006 |
| 959.3 | 0.007 |
| 959.4 | 0.007 |
| 959.5 | 0.007 |
| 959.6 | 0.007 |
| 959.7 | 0.006 |
| 959.8 | 0.006 |
| 959.9 | 0.005 |
| 960.0 | 0.005 |
| 960.1 | 0.004 |
| 960.2 | 0.003 |
| 960.3 | 0.003 |
| 960.4 | 0.003 |
| 960.5 | 0.004 |
| 960.6 | 0.004 |
| 960.7 | 0.005 |
| 960.8 | 0.006 |
| 960.9 | 0.007 |
| 961.0 | 0.008 |
| 961.1 | 0.009 |
| 961.2 | 0.009 |
| 961.3 | 0.009 |
| 961.4 | 0.008 |
| 961.5 | 0.008 |
| 961.6 | 0.007 |
| 961.7 | 0.007 |
| 961.8 | 0.006 |
| 961.9 | 0.006 |
| 962.0 | 0.006 |
| 962.1 | 0.005 |
| 962.2 | 0.005 |
| 962.3 | 0.004 |
| 962.4 | 0.004 |
| 962.5 | 0.005 |
| 962.6 | 0.006 |
| 962.7 | 0.007 |
| 962.8 | 0.008 |
| 962.9 | 0.008 |
| 963.0 | 0.009 |
| 963.1 | 0.01 |
| 963.2 | 0.01 |
| 963.3 | 0.01 |
| 963.4 | 0.009 |
| 963.5 | 0.01 |
| 963.6 | 0.01 |
| 963.7 | 0.009 |
| 963.8 | 0.008 |
| 963.9 | 0.007 |
| 964.0 | 0.006 |
| 964.1 | 0.007 |
| 964.2 | 0.007 |
| 964.3 | 0.008 |
| 964.4 | 0.008 |
| 964.5 | 0.009 |
| 964.6 | 0.01 |
| 964.7 | 0.011 |
| 964.8 | 0.011 |
| 964.9 | 0.012 |
| 965.0 | 0.012 |
| 965.1 | 0.011 |
| 965.2 | 0.011 |
| 965.3 | 0.01 |
| 965.4 | 0.01 |
| 965.5 | 0.009 |
| 965.6 | 0.009 |
| 965.7 | 0.009 |
| 965.8 | 0.01 |
| 965.9 | 0.009 |
| 966.0 | 0.008 |
| 966.1 | 0.007 |
| 966.2 | 0.009 |
| 966.3 | 0.009 |
| 966.4 | 0.01 |
| 966.5 | 0.01 |
| 966.6 | 0.01 |
| 966.7 | 0.01 |
| 966.8 | 0.01 |
| 966.9 | 0.01 |
| 967.0 | 0.009 |
| 967.1 | 0.009 |
| 967.2 | 0.01 |
| 967.3 | 0.01 |
| 967.4 | 0.01 |
| 967.5 | 0.01 |
| 967.6 | 0.009 |
| 967.7 | 0.009 |
| 967.8 | 0.009 |
| 967.9 | 0.009 |
| 968.0 | 0.009 |
| 968.1 | 0.009 |
| 968.2 | 0.009 |
| 968.3 | 0.009 |
| 968.4 | 0.008 |
| 968.5 | 0.008 |
| 968.6 | 0.008 |
| 968.7 | 0.008 |
| 968.8 | 0.009 |
| 968.9 | 0.01 |
| 969.0 | 0.01 |
| 969.1 | 0.009 |
| 969.2 | 0.009 |
| 969.3 | 0.008 |
| 969.4 | 0.009 |
| 969.5 | 0.009 |
| 969.6 | 0.009 |
| 969.7 | 0.008 |
| 969.8 | 0.008 |
| 969.9 | 0.008 |
| 970.0 | 0.007 |
| 970.1 | 0.006 |
| 970.2 | 0.007 |
| 970.3 | 0.008 |
| 970.4 | 0.008 |
| 970.5 | 0.009 |
| 970.6 | 0.009 |
| 970.7 | 0.008 |
| 970.8 | 0.008 |
| 970.9 | 0.008 |
| 971.0 | 0.009 |
| 971.1 | 0.008 |
| 971.2 | 0.007 |
| 971.3 | 0.006 |
| 971.4 | 0.007 |
| 971.5 | 0.007 |
| 971.6 | 0.008 |
| 971.7 | 0.006 |
| 971.8 | 0.006 |
| 971.9 | 0.007 |
| 972.0 | 0.008 |
| 972.1 | 0.008 |
| 972.2 | 0.008 |
| 972.3 | 0.007 |
| 972.4 | 0.007 |
| 972.5 | 0.007 |
| 972.6 | 0.007 |
| 972.7 | 0.007 |
| 972.8 | 0.006 |
| 972.9 | 0.006 |
| 973.0 | 0.006 |
| 973.1 | 0.006 |
| 973.2 | 0.005 |
| 973.3 | 0.005 |
| 973.4 | 0.006 |
| 973.5 | 0.006 |
| 973.6 | 0.006 |
| 973.7 | 0.006 |
| 973.8 | 0.007 |
| 973.9 | 0.006 |
| 974.0 | 0.007 |
| 974.1 | 0.006 |
| 974.2 | 0.006 |
| 974.3 | 0.005 |
| 974.4 | 0.007 |
| 974.5 | 0.007 |
| 974.6 | 0.007 |
| 974.7 | 0.007 |
| 974.8 | 0.007 |
| 974.9 | 0.007 |
| 975.0 | 0.007 |
| 975.1 | 0.007 |
| 975.2 | 0.007 |
| 975.3 | 0.007 |
| 975.4 | 0.006 |
| 975.5 | 0.006 |
| 975.6 | 0.007 |
| 975.7 | 0.007 |
| 975.8 | 0.007 |
| 975.9 | 0.007 |
| 976.0 | 0.007 |
| 976.1 | 0.007 |
| 976.2 | 0.007 |
| 976.3 | 0.007 |
| 976.4 | 0.007 |
| 976.5 | 0.007 |
| 976.6 | 0.008 |
| 976.7 | 0.007 |
| 976.8 | 0.006 |
| 976.9 | 0.006 |
| 977.0 | 0.007 |
| 977.1 | 0.007 |
| 977.2 | 0.007 |
| 977.3 | 0.007 |
| 977.4 | 0.007 |
| 977.5 | 0.007 |
| 977.6 | 0.007 |
| 977.7 | 0.007 |
| 977.8 | 0.008 |
| 977.9 | 0.008 |
| 978.0 | 0.008 |
| 978.1 | 0.008 |
| 978.2 | 0.008 |
| 978.3 | 0.007 |
| 978.4 | 0.006 |
| 978.5 | 0.006 |
| 978.6 | 0.006 |
| 978.7 | 0.006 |
| 978.8 | 0.006 |
| 978.9 | 0.007 |
| 979.0 | 0.007 |
| 979.1 | 0.006 |
| 979.2 | 0.006 |
| 979.3 | 0.006 |
| 979.4 | 0.006 |
| 979.5 | 0.006 |
| 979.6 | 0.005 |
| 979.7 | 0.005 |
| 979.8 | 0.006 |
| 979.9 | 0.007 |
| 980.0 | 0.007 |
| 980.1 | 0.007 |
| 980.2 | 0.006 |
| 980.3 | 0.007 |
| 980.4 | 0.007 |
| 980.5 | 0.007 |
| 980.6 | 0.006 |
| 980.7 | 0.006 |
| 980.8 | 0.006 |
| 980.9 | 0.007 |
| 981.0 | 0.007 |
| 981.1 | 0.008 |
| 981.2 | 0.007 |
| 981.3 | 0.006 |
| 981.4 | 0.007 |
| 981.5 | 0.007 |
| 981.6 | 0.007 |
| 981.7 | 0.007 |
| 981.8 | 0.006 |
| 981.9 | 0.006 |
| 982.0 | 0.006 |
| 982.1 | 0.006 |
| 982.2 | 0.006 |
| 982.3 | 0.005 |
| 982.4 | 0.006 |
| 982.5 | 0.006 |
| 982.6 | 0.006 |
| 982.7 | 0.006 |
| 982.8 | 0.006 |
| 982.9 | 0.006 |
| 983.0 | 0.006 |
| 983.1 | 0.007 |
| 983.2 | 0.007 |
| 983.3 | 0.007 |
| 983.4 | 0.008 |
| 983.5 | 0.008 |
| 983.6 | 0.007 |
| 983.7 | 0.007 |
| 983.8 | 0.007 |
| 983.9 | 0.008 |
| 984.0 | 0.007 |
| 984.1 | 0.008 |
| 984.2 | 0.007 |
| 984.3 | 0.008 |
| 984.4 | 0.007 |
| 984.5 | 0.007 |
| 984.6 | 0.007 |
| 984.7 | 0.007 |
| 984.8 | 0.007 |
| 984.9 | 0.006 |
| 985.0 | 0.005 |
| 985.1 | 0.004 |
| 985.2 | 0.005 |
| 985.3 | 0.007 |
| 985.4 | 0.007 |
| 985.5 | 0.006 |
| 985.6 | 0.005 |
| 985.7 | 0.005 |
| 985.8 | 0.006 |
| 985.9 | 0.005 |
| 986.0 | 0.005 |
| 986.1 | 0.006 |
| 986.2 | 0.006 |
| 986.3 | 0.006 |
| 986.4 | 0.006 |
| 986.5 | 0.007 |
| 986.6 | 0.006 |
| 986.7 | 0.006 |
| 986.8 | 0.006 |
| 986.9 | 0.005 |
| 987.0 | 0.004 |
| 987.1 | 0.005 |
| 987.2 | 0.005 |
| 987.3 | 0.006 |
| 987.4 | 0.006 |
| 987.5 | 0.006 |
| 987.6 | 0.006 |
| 987.7 | 0.006 |
| 987.8 | 0.006 |
| 987.9 | 0.006 |
| 988.0 | 0.006 |
| 988.1 | 0.006 |
| 988.2 | 0.007 |
| 988.3 | 0.007 |
| 988.4 | 0.007 |
| 988.5 | 0.007 |
| 988.6 | 0.007 |
| 988.7 | 0.007 |
| 988.8 | 0.007 |
| 988.9 | 0.008 |
| 989.0 | 0.008 |
| 989.1 | 0.007 |
| 989.2 | 0.007 |
| 989.3 | 0.007 |
| 989.4 | 0.007 |
| 989.5 | 0.007 |
| 989.6 | 0.007 |
| 989.7 | 0.007 |
| 989.8 | 0.006 |
| 989.9 | 0.006 |
| 990.0 | 0.007 |
| 990.1 | 0.007 |
| 990.2 | 0.008 |
| 990.3 | 0.008 |
| 990.4 | 0.007 |
| 990.5 | 0.008 |
| 990.6 | 0.007 |
| 990.7 | 0.007 |
| 990.8 | 0.007 |
| 990.9 | 0.008 |
| 991.0 | 0.008 |
| 991.1 | 0.008 |
| 991.2 | 0.009 |
| 991.3 | 0.009 |
| 991.4 | 0.008 |
| 991.5 | 0.007 |
| 991.6 | 0.008 |
| 991.7 | 0.009 |
| 991.8 | 0.009 |
| 991.9 | 0.008 |
| 992.0 | 0.009 |
| 992.1 | 0.009 |
| 992.2 | 0.009 |
| 992.3 | 0.009 |
| 992.4 | 0.008 |
| 992.5 | 0.008 |
| 992.6 | 0.008 |
| 992.7 | 0.008 |
| 992.8 | 0.008 |
| 992.9 | 0.007 |
| 993.0 | 0.008 |
| 993.1 | 0.008 |
| 993.2 | 0.008 |
| 993.3 | 0.008 |
| 993.4 | 0.008 |
| 993.5 | 0.008 |
| 993.6 | 0.008 |
| 993.7 | 0.008 |
| 993.8 | 0.008 |
| 993.9 | 0.008 |
| 994.0 | 0.008 |
| 994.1 | 0.008 |
| 994.2 | 0.008 |
| 994.3 | 0.008 |
| 994.4 | 0.008 |
| 994.5 | 0.008 |
| 994.6 | 0.007 |
| 994.7 | 0.007 |
| 994.8 | 0.008 |
| 994.9 | 0.008 |
| 995.0 | 0.008 |
| 995.1 | 0.008 |
| 995.2 | 0.007 |
| 995.3 | 0.008 |
| 995.4 | 0.008 |
| 995.5 | 0.009 |
| 995.6 | 0.009 |
| 995.7 | 0.009 |
| 995.8 | 0.009 |
| 995.9 | 0.008 |
| 996.0 | 0.008 |
| 996.1 | 0.008 |
| 996.2 | 0.008 |
| 996.3 | 0.008 |
| 996.4 | 0.008 |
| 996.5 | 0.008 |
| 996.6 | 0.008 |
| 996.7 | 0.009 |
| 996.8 | 0.008 |
| 996.9 | 0.008 |
| 997.0 | 0.007 |
| 997.1 | 0.007 |
| 997.2 | 0.007 |
| 997.3 | 0.008 |
| 997.4 | 0.007 |
| 997.5 | 0.008 |
| 997.6 | 0.007 |
| 997.7 | 0.008 |
| 997.8 | 0.007 |
| 997.9 | 0.007 |
| 998.0 | 0.007 |
| 998.1 | 0.007 |
| 998.2 | 0.006 |
| 998.3 | 0.006 |
| 998.4 | 0.006 |
| 998.5 | 0.006 |
| 998.6 | 0.007 |
| 998.7 | 0.007 |
| 998.8 | 0.007 |
| 998.9 | 0.006 |
| 999.0 | 0.007 |
| 999.1 | 0.007 |
| 999.2 | 0.007 |
| 999.3 | 0.007 |
| 999.4 | 0.006 |
| 999.5 | 0.006 |
| 999.6 | 0.006 |
| 999.7 | 0.006 |
| 999.8 | 0.006 |
| 999.9 | 0.007 |
| 1000.0 | 0.007 |